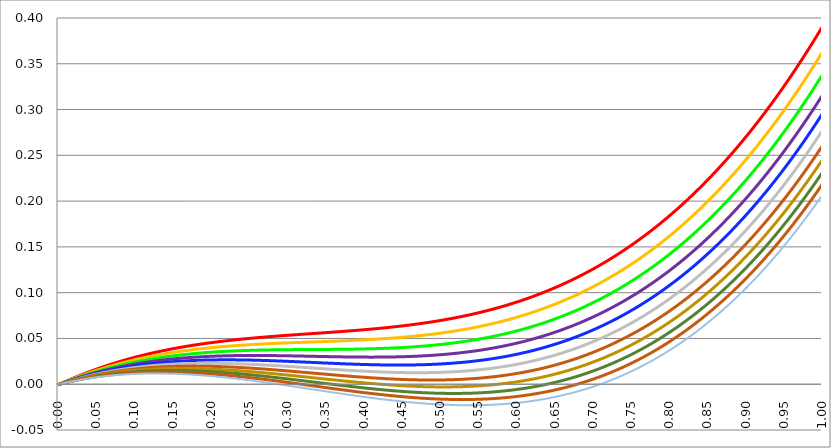
| Category | Series 1 | Series 0 | Series 3 | Series 4 | Series 5 | Series 2 | Series 6 | Series 7 | Series 8 | Series 9 | Series 10 |
|---|---|---|---|---|---|---|---|---|---|---|---|
| 0.0 | -0.001 | -0.001 | -0.001 | -0.001 | -0.001 | -0.001 | -0.001 | 0 | 0 | 0 | 0 |
| 0.0005 | -0.001 | -0.001 | -0.001 | 0 | 0 | 0 | 0 | 0 | 0 | 0 | 0 |
| 0.001 | 0 | 0 | 0 | 0 | 0 | 0 | 0 | 0 | 0 | 0 | 0 |
| 0.0015 | 0 | 0 | 0 | 0 | 0 | 0 | 0 | 0 | 0 | 0 | 0 |
| 0.002 | 0 | 0 | 0 | 0 | 0 | 0 | 0 | 0 | 0 | 0 | 0 |
| 0.0025 | 0 | 0 | 0 | 0 | 0 | 0 | 0 | 0 | 0 | 0 | 0 |
| 0.003 | 0 | 0 | 0 | 0 | 0 | 0 | 0 | 0 | 0 | 0 | 0 |
| 0.0035 | 0.001 | 0.001 | 0 | 0 | 0 | 0 | 0 | 0 | 0 | 0 | 0 |
| 0.004 | 0.001 | 0.001 | 0.001 | 0.001 | 0.001 | 0.001 | 0.001 | 0 | 0 | 0 | 0 |
| 0.0045 | 0.001 | 0.001 | 0.001 | 0.001 | 0.001 | 0.001 | 0.001 | 0.001 | 0.001 | 0.001 | 0 |
| 0.005 | 0.001 | 0.001 | 0.001 | 0.001 | 0.001 | 0.001 | 0.001 | 0.001 | 0.001 | 0.001 | 0.001 |
| 0.0055 | 0.001 | 0.001 | 0.001 | 0.001 | 0.001 | 0.001 | 0.001 | 0.001 | 0.001 | 0.001 | 0.001 |
| 0.006 | 0.002 | 0.001 | 0.001 | 0.001 | 0.001 | 0.001 | 0.001 | 0.001 | 0.001 | 0.001 | 0.001 |
| 0.0065 | 0.002 | 0.002 | 0.001 | 0.001 | 0.001 | 0.001 | 0.001 | 0.001 | 0.001 | 0.001 | 0.001 |
| 0.007 | 0.002 | 0.002 | 0.002 | 0.002 | 0.001 | 0.001 | 0.001 | 0.001 | 0.001 | 0.001 | 0.001 |
| 0.0075 | 0.002 | 0.002 | 0.002 | 0.002 | 0.002 | 0.001 | 0.001 | 0.001 | 0.001 | 0.001 | 0.001 |
| 0.008 | 0.002 | 0.002 | 0.002 | 0.002 | 0.002 | 0.002 | 0.001 | 0.001 | 0.001 | 0.001 | 0.001 |
| 0.0085 | 0.002 | 0.002 | 0.002 | 0.002 | 0.002 | 0.002 | 0.002 | 0.002 | 0.001 | 0.001 | 0.001 |
| 0.009 | 0.003 | 0.002 | 0.002 | 0.002 | 0.002 | 0.002 | 0.002 | 0.002 | 0.002 | 0.001 | 0.001 |
| 0.0095 | 0.003 | 0.003 | 0.002 | 0.002 | 0.002 | 0.002 | 0.002 | 0.002 | 0.002 | 0.002 | 0.001 |
| 0.01 | 0.003 | 0.003 | 0.003 | 0.002 | 0.002 | 0.002 | 0.002 | 0.002 | 0.002 | 0.002 | 0.002 |
| 0.0105 | 0.003 | 0.003 | 0.003 | 0.003 | 0.002 | 0.002 | 0.002 | 0.002 | 0.002 | 0.002 | 0.002 |
| 0.011 | 0.003 | 0.003 | 0.003 | 0.003 | 0.003 | 0.002 | 0.002 | 0.002 | 0.002 | 0.002 | 0.002 |
| 0.0115 | 0.004 | 0.003 | 0.003 | 0.003 | 0.003 | 0.003 | 0.002 | 0.002 | 0.002 | 0.002 | 0.002 |
| 0.012 | 0.004 | 0.003 | 0.003 | 0.003 | 0.003 | 0.003 | 0.002 | 0.002 | 0.002 | 0.002 | 0.002 |
| 0.0125 | 0.004 | 0.004 | 0.003 | 0.003 | 0.003 | 0.003 | 0.003 | 0.002 | 0.002 | 0.002 | 0.002 |
| 0.013 | 0.004 | 0.004 | 0.004 | 0.003 | 0.003 | 0.003 | 0.003 | 0.003 | 0.002 | 0.002 | 0.002 |
| 0.0135 | 0.004 | 0.004 | 0.004 | 0.003 | 0.003 | 0.003 | 0.003 | 0.003 | 0.002 | 0.002 | 0.002 |
| 0.014 | 0.004 | 0.004 | 0.004 | 0.004 | 0.003 | 0.003 | 0.003 | 0.003 | 0.003 | 0.002 | 0.002 |
| 0.0145 | 0.005 | 0.004 | 0.004 | 0.004 | 0.003 | 0.003 | 0.003 | 0.003 | 0.003 | 0.003 | 0.002 |
| 0.015 | 0.005 | 0.004 | 0.004 | 0.004 | 0.004 | 0.003 | 0.003 | 0.003 | 0.003 | 0.003 | 0.002 |
| 0.0155 | 0.005 | 0.005 | 0.004 | 0.004 | 0.004 | 0.004 | 0.003 | 0.003 | 0.003 | 0.003 | 0.003 |
| 0.016 | 0.005 | 0.005 | 0.004 | 0.004 | 0.004 | 0.004 | 0.003 | 0.003 | 0.003 | 0.003 | 0.003 |
| 0.0165 | 0.005 | 0.005 | 0.005 | 0.004 | 0.004 | 0.004 | 0.004 | 0.003 | 0.003 | 0.003 | 0.003 |
| 0.017 | 0.006 | 0.005 | 0.005 | 0.004 | 0.004 | 0.004 | 0.004 | 0.003 | 0.003 | 0.003 | 0.003 |
| 0.0175 | 0.006 | 0.005 | 0.005 | 0.005 | 0.004 | 0.004 | 0.004 | 0.003 | 0.003 | 0.003 | 0.003 |
| 0.018 | 0.006 | 0.005 | 0.005 | 0.005 | 0.004 | 0.004 | 0.004 | 0.004 | 0.003 | 0.003 | 0.003 |
| 0.0185 | 0.006 | 0.006 | 0.005 | 0.005 | 0.005 | 0.004 | 0.004 | 0.004 | 0.003 | 0.003 | 0.003 |
| 0.019 | 0.006 | 0.006 | 0.005 | 0.005 | 0.005 | 0.004 | 0.004 | 0.004 | 0.004 | 0.003 | 0.003 |
| 0.0195 | 0.006 | 0.006 | 0.006 | 0.005 | 0.005 | 0.004 | 0.004 | 0.004 | 0.004 | 0.003 | 0.003 |
| 0.02 | 0.007 | 0.006 | 0.006 | 0.005 | 0.005 | 0.005 | 0.004 | 0.004 | 0.004 | 0.004 | 0.003 |
| 0.0205 | 0.007 | 0.006 | 0.006 | 0.005 | 0.005 | 0.005 | 0.004 | 0.004 | 0.004 | 0.004 | 0.003 |
| 0.021 | 0.007 | 0.006 | 0.006 | 0.006 | 0.005 | 0.005 | 0.005 | 0.004 | 0.004 | 0.004 | 0.003 |
| 0.0215 | 0.007 | 0.007 | 0.006 | 0.006 | 0.005 | 0.005 | 0.005 | 0.004 | 0.004 | 0.004 | 0.004 |
| 0.022 | 0.007 | 0.007 | 0.006 | 0.006 | 0.005 | 0.005 | 0.005 | 0.004 | 0.004 | 0.004 | 0.004 |
| 0.0225 | 0.008 | 0.007 | 0.006 | 0.006 | 0.006 | 0.005 | 0.005 | 0.005 | 0.004 | 0.004 | 0.004 |
| 0.023 | 0.008 | 0.007 | 0.007 | 0.006 | 0.006 | 0.005 | 0.005 | 0.005 | 0.004 | 0.004 | 0.004 |
| 0.0235 | 0.008 | 0.007 | 0.007 | 0.006 | 0.006 | 0.005 | 0.005 | 0.005 | 0.004 | 0.004 | 0.004 |
| 0.024 | 0.008 | 0.007 | 0.007 | 0.006 | 0.006 | 0.006 | 0.005 | 0.005 | 0.005 | 0.004 | 0.004 |
| 0.0245 | 0.008 | 0.008 | 0.007 | 0.007 | 0.006 | 0.006 | 0.005 | 0.005 | 0.005 | 0.004 | 0.004 |
| 0.025 | 0.008 | 0.008 | 0.007 | 0.007 | 0.006 | 0.006 | 0.005 | 0.005 | 0.005 | 0.004 | 0.004 |
| 0.0255 | 0.009 | 0.008 | 0.007 | 0.007 | 0.006 | 0.006 | 0.005 | 0.005 | 0.005 | 0.004 | 0.004 |
| 0.026 | 0.009 | 0.008 | 0.007 | 0.007 | 0.006 | 0.006 | 0.006 | 0.005 | 0.005 | 0.005 | 0.004 |
| 0.0265 | 0.009 | 0.008 | 0.008 | 0.007 | 0.007 | 0.006 | 0.006 | 0.005 | 0.005 | 0.005 | 0.004 |
| 0.027 | 0.009 | 0.008 | 0.008 | 0.007 | 0.007 | 0.006 | 0.006 | 0.005 | 0.005 | 0.005 | 0.004 |
| 0.0275 | 0.009 | 0.009 | 0.008 | 0.007 | 0.007 | 0.006 | 0.006 | 0.006 | 0.005 | 0.005 | 0.005 |
| 0.028 | 0.009 | 0.009 | 0.008 | 0.007 | 0.007 | 0.006 | 0.006 | 0.006 | 0.005 | 0.005 | 0.005 |
| 0.0285 | 0.01 | 0.009 | 0.008 | 0.008 | 0.007 | 0.007 | 0.006 | 0.006 | 0.005 | 0.005 | 0.005 |
| 0.029 | 0.01 | 0.009 | 0.008 | 0.008 | 0.007 | 0.007 | 0.006 | 0.006 | 0.005 | 0.005 | 0.005 |
| 0.0295 | 0.01 | 0.009 | 0.008 | 0.008 | 0.007 | 0.007 | 0.006 | 0.006 | 0.006 | 0.005 | 0.005 |
| 0.03 | 0.01 | 0.009 | 0.009 | 0.008 | 0.007 | 0.007 | 0.006 | 0.006 | 0.006 | 0.005 | 0.005 |
| 0.0305 | 0.01 | 0.009 | 0.009 | 0.008 | 0.008 | 0.007 | 0.007 | 0.006 | 0.006 | 0.005 | 0.005 |
| 0.031 | 0.01 | 0.01 | 0.009 | 0.008 | 0.008 | 0.007 | 0.007 | 0.006 | 0.006 | 0.005 | 0.005 |
| 0.0315 | 0.011 | 0.01 | 0.009 | 0.008 | 0.008 | 0.007 | 0.007 | 0.006 | 0.006 | 0.005 | 0.005 |
| 0.032 | 0.011 | 0.01 | 0.009 | 0.008 | 0.008 | 0.007 | 0.007 | 0.006 | 0.006 | 0.006 | 0.005 |
| 0.0325 | 0.011 | 0.01 | 0.009 | 0.009 | 0.008 | 0.007 | 0.007 | 0.006 | 0.006 | 0.006 | 0.005 |
| 0.033 | 0.011 | 0.01 | 0.009 | 0.009 | 0.008 | 0.008 | 0.007 | 0.007 | 0.006 | 0.006 | 0.005 |
| 0.0335 | 0.011 | 0.01 | 0.01 | 0.009 | 0.008 | 0.008 | 0.007 | 0.007 | 0.006 | 0.006 | 0.005 |
| 0.034 | 0.011 | 0.01 | 0.01 | 0.009 | 0.008 | 0.008 | 0.007 | 0.007 | 0.006 | 0.006 | 0.005 |
| 0.0345 | 0.012 | 0.011 | 0.01 | 0.009 | 0.008 | 0.008 | 0.007 | 0.007 | 0.006 | 0.006 | 0.006 |
| 0.035 | 0.012 | 0.011 | 0.01 | 0.009 | 0.009 | 0.008 | 0.007 | 0.007 | 0.006 | 0.006 | 0.006 |
| 0.0355 | 0.012 | 0.011 | 0.01 | 0.009 | 0.009 | 0.008 | 0.008 | 0.007 | 0.007 | 0.006 | 0.006 |
| 0.036 | 0.012 | 0.011 | 0.01 | 0.009 | 0.009 | 0.008 | 0.008 | 0.007 | 0.007 | 0.006 | 0.006 |
| 0.0365 | 0.012 | 0.011 | 0.01 | 0.01 | 0.009 | 0.008 | 0.008 | 0.007 | 0.007 | 0.006 | 0.006 |
| 0.037 | 0.012 | 0.011 | 0.011 | 0.01 | 0.009 | 0.008 | 0.008 | 0.007 | 0.007 | 0.006 | 0.006 |
| 0.0375 | 0.013 | 0.012 | 0.011 | 0.01 | 0.009 | 0.008 | 0.008 | 0.007 | 0.007 | 0.006 | 0.006 |
| 0.038 | 0.013 | 0.012 | 0.011 | 0.01 | 0.009 | 0.009 | 0.008 | 0.007 | 0.007 | 0.006 | 0.006 |
| 0.0385 | 0.013 | 0.012 | 0.011 | 0.01 | 0.009 | 0.009 | 0.008 | 0.008 | 0.007 | 0.007 | 0.006 |
| 0.039 | 0.013 | 0.012 | 0.011 | 0.01 | 0.009 | 0.009 | 0.008 | 0.008 | 0.007 | 0.007 | 0.006 |
| 0.0395 | 0.013 | 0.012 | 0.011 | 0.01 | 0.01 | 0.009 | 0.008 | 0.008 | 0.007 | 0.007 | 0.006 |
| 0.04 | 0.013 | 0.012 | 0.011 | 0.01 | 0.01 | 0.009 | 0.008 | 0.008 | 0.007 | 0.007 | 0.006 |
| 0.0405 | 0.013 | 0.012 | 0.011 | 0.011 | 0.01 | 0.009 | 0.008 | 0.008 | 0.007 | 0.007 | 0.006 |
| 0.041 | 0.014 | 0.013 | 0.012 | 0.011 | 0.01 | 0.009 | 0.009 | 0.008 | 0.007 | 0.007 | 0.006 |
| 0.0415 | 0.014 | 0.013 | 0.012 | 0.011 | 0.01 | 0.009 | 0.009 | 0.008 | 0.007 | 0.007 | 0.007 |
| 0.042 | 0.014 | 0.013 | 0.012 | 0.011 | 0.01 | 0.009 | 0.009 | 0.008 | 0.008 | 0.007 | 0.007 |
| 0.0425 | 0.014 | 0.013 | 0.012 | 0.011 | 0.01 | 0.009 | 0.009 | 0.008 | 0.008 | 0.007 | 0.007 |
| 0.043 | 0.014 | 0.013 | 0.012 | 0.011 | 0.01 | 0.01 | 0.009 | 0.008 | 0.008 | 0.007 | 0.007 |
| 0.0435 | 0.014 | 0.013 | 0.012 | 0.011 | 0.01 | 0.01 | 0.009 | 0.008 | 0.008 | 0.007 | 0.007 |
| 0.044 | 0.015 | 0.013 | 0.012 | 0.011 | 0.011 | 0.01 | 0.009 | 0.008 | 0.008 | 0.007 | 0.007 |
| 0.0445 | 0.015 | 0.014 | 0.012 | 0.012 | 0.011 | 0.01 | 0.009 | 0.009 | 0.008 | 0.007 | 0.007 |
| 0.045 | 0.015 | 0.014 | 0.013 | 0.012 | 0.011 | 0.01 | 0.009 | 0.009 | 0.008 | 0.007 | 0.007 |
| 0.0455 | 0.015 | 0.014 | 0.013 | 0.012 | 0.011 | 0.01 | 0.009 | 0.009 | 0.008 | 0.008 | 0.007 |
| 0.046 | 0.015 | 0.014 | 0.013 | 0.012 | 0.011 | 0.01 | 0.009 | 0.009 | 0.008 | 0.008 | 0.007 |
| 0.0465 | 0.015 | 0.014 | 0.013 | 0.012 | 0.011 | 0.01 | 0.01 | 0.009 | 0.008 | 0.008 | 0.007 |
| 0.047 | 0.015 | 0.014 | 0.013 | 0.012 | 0.011 | 0.01 | 0.01 | 0.009 | 0.008 | 0.008 | 0.007 |
| 0.0475 | 0.016 | 0.014 | 0.013 | 0.012 | 0.011 | 0.01 | 0.01 | 0.009 | 0.008 | 0.008 | 0.007 |
| 0.048 | 0.016 | 0.015 | 0.013 | 0.012 | 0.011 | 0.011 | 0.01 | 0.009 | 0.008 | 0.008 | 0.007 |
| 0.0485 | 0.016 | 0.015 | 0.013 | 0.012 | 0.011 | 0.011 | 0.01 | 0.009 | 0.009 | 0.008 | 0.007 |
| 0.049 | 0.016 | 0.015 | 0.014 | 0.013 | 0.012 | 0.011 | 0.01 | 0.009 | 0.009 | 0.008 | 0.007 |
| 0.0495 | 0.016 | 0.015 | 0.014 | 0.013 | 0.012 | 0.011 | 0.01 | 0.009 | 0.009 | 0.008 | 0.007 |
| 0.05 | 0.016 | 0.015 | 0.014 | 0.013 | 0.012 | 0.011 | 0.01 | 0.009 | 0.009 | 0.008 | 0.008 |
| 0.0505 | 0.017 | 0.015 | 0.014 | 0.013 | 0.012 | 0.011 | 0.01 | 0.009 | 0.009 | 0.008 | 0.008 |
| 0.051 | 0.017 | 0.015 | 0.014 | 0.013 | 0.012 | 0.011 | 0.01 | 0.01 | 0.009 | 0.008 | 0.008 |
| 0.0515 | 0.017 | 0.015 | 0.014 | 0.013 | 0.012 | 0.011 | 0.01 | 0.01 | 0.009 | 0.008 | 0.008 |
| 0.052 | 0.017 | 0.016 | 0.014 | 0.013 | 0.012 | 0.011 | 0.01 | 0.01 | 0.009 | 0.008 | 0.008 |
| 0.0525 | 0.017 | 0.016 | 0.014 | 0.013 | 0.012 | 0.011 | 0.011 | 0.01 | 0.009 | 0.008 | 0.008 |
| 0.053 | 0.017 | 0.016 | 0.015 | 0.013 | 0.012 | 0.011 | 0.011 | 0.01 | 0.009 | 0.008 | 0.008 |
| 0.0535 | 0.017 | 0.016 | 0.015 | 0.014 | 0.013 | 0.012 | 0.011 | 0.01 | 0.009 | 0.009 | 0.008 |
| 0.054 | 0.018 | 0.016 | 0.015 | 0.014 | 0.013 | 0.012 | 0.011 | 0.01 | 0.009 | 0.009 | 0.008 |
| 0.0545 | 0.018 | 0.016 | 0.015 | 0.014 | 0.013 | 0.012 | 0.011 | 0.01 | 0.009 | 0.009 | 0.008 |
| 0.055 | 0.018 | 0.016 | 0.015 | 0.014 | 0.013 | 0.012 | 0.011 | 0.01 | 0.009 | 0.009 | 0.008 |
| 0.0555 | 0.018 | 0.017 | 0.015 | 0.014 | 0.013 | 0.012 | 0.011 | 0.01 | 0.009 | 0.009 | 0.008 |
| 0.056 | 0.018 | 0.017 | 0.015 | 0.014 | 0.013 | 0.012 | 0.011 | 0.01 | 0.01 | 0.009 | 0.008 |
| 0.0565 | 0.018 | 0.017 | 0.015 | 0.014 | 0.013 | 0.012 | 0.011 | 0.01 | 0.01 | 0.009 | 0.008 |
| 0.057 | 0.018 | 0.017 | 0.016 | 0.014 | 0.013 | 0.012 | 0.011 | 0.01 | 0.01 | 0.009 | 0.008 |
| 0.0575 | 0.019 | 0.017 | 0.016 | 0.014 | 0.013 | 0.012 | 0.011 | 0.01 | 0.01 | 0.009 | 0.008 |
| 0.058 | 0.019 | 0.017 | 0.016 | 0.015 | 0.013 | 0.012 | 0.011 | 0.011 | 0.01 | 0.009 | 0.008 |
| 0.0585 | 0.019 | 0.017 | 0.016 | 0.015 | 0.013 | 0.012 | 0.011 | 0.011 | 0.01 | 0.009 | 0.008 |
| 0.059 | 0.019 | 0.017 | 0.016 | 0.015 | 0.014 | 0.013 | 0.012 | 0.011 | 0.01 | 0.009 | 0.009 |
| 0.0595 | 0.019 | 0.018 | 0.016 | 0.015 | 0.014 | 0.013 | 0.012 | 0.011 | 0.01 | 0.009 | 0.009 |
| 0.06 | 0.019 | 0.018 | 0.016 | 0.015 | 0.014 | 0.013 | 0.012 | 0.011 | 0.01 | 0.009 | 0.009 |
| 0.0605 | 0.019 | 0.018 | 0.016 | 0.015 | 0.014 | 0.013 | 0.012 | 0.011 | 0.01 | 0.009 | 0.009 |
| 0.061 | 0.02 | 0.018 | 0.016 | 0.015 | 0.014 | 0.013 | 0.012 | 0.011 | 0.01 | 0.009 | 0.009 |
| 0.0615 | 0.02 | 0.018 | 0.017 | 0.015 | 0.014 | 0.013 | 0.012 | 0.011 | 0.01 | 0.009 | 0.009 |
| 0.062 | 0.02 | 0.018 | 0.017 | 0.015 | 0.014 | 0.013 | 0.012 | 0.011 | 0.01 | 0.009 | 0.009 |
| 0.0625 | 0.02 | 0.018 | 0.017 | 0.015 | 0.014 | 0.013 | 0.012 | 0.011 | 0.01 | 0.01 | 0.009 |
| 0.063 | 0.02 | 0.018 | 0.017 | 0.016 | 0.014 | 0.013 | 0.012 | 0.011 | 0.01 | 0.01 | 0.009 |
| 0.0635 | 0.02 | 0.019 | 0.017 | 0.016 | 0.014 | 0.013 | 0.012 | 0.011 | 0.01 | 0.01 | 0.009 |
| 0.064 | 0.02 | 0.019 | 0.017 | 0.016 | 0.014 | 0.013 | 0.012 | 0.011 | 0.01 | 0.01 | 0.009 |
| 0.0645 | 0.021 | 0.019 | 0.017 | 0.016 | 0.015 | 0.013 | 0.012 | 0.011 | 0.011 | 0.01 | 0.009 |
| 0.065 | 0.021 | 0.019 | 0.017 | 0.016 | 0.015 | 0.014 | 0.012 | 0.011 | 0.011 | 0.01 | 0.009 |
| 0.0655 | 0.021 | 0.019 | 0.017 | 0.016 | 0.015 | 0.014 | 0.013 | 0.012 | 0.011 | 0.01 | 0.009 |
| 0.066 | 0.021 | 0.019 | 0.018 | 0.016 | 0.015 | 0.014 | 0.013 | 0.012 | 0.011 | 0.01 | 0.009 |
| 0.0665 | 0.021 | 0.019 | 0.018 | 0.016 | 0.015 | 0.014 | 0.013 | 0.012 | 0.011 | 0.01 | 0.009 |
| 0.067 | 0.021 | 0.019 | 0.018 | 0.016 | 0.015 | 0.014 | 0.013 | 0.012 | 0.011 | 0.01 | 0.009 |
| 0.0675 | 0.021 | 0.02 | 0.018 | 0.016 | 0.015 | 0.014 | 0.013 | 0.012 | 0.011 | 0.01 | 0.009 |
| 0.068 | 0.021 | 0.02 | 0.018 | 0.017 | 0.015 | 0.014 | 0.013 | 0.012 | 0.011 | 0.01 | 0.009 |
| 0.0685 | 0.022 | 0.02 | 0.018 | 0.017 | 0.015 | 0.014 | 0.013 | 0.012 | 0.011 | 0.01 | 0.009 |
| 0.069 | 0.022 | 0.02 | 0.018 | 0.017 | 0.015 | 0.014 | 0.013 | 0.012 | 0.011 | 0.01 | 0.009 |
| 0.0695 | 0.022 | 0.02 | 0.018 | 0.017 | 0.015 | 0.014 | 0.013 | 0.012 | 0.011 | 0.01 | 0.009 |
| 0.07 | 0.022 | 0.02 | 0.018 | 0.017 | 0.016 | 0.014 | 0.013 | 0.012 | 0.011 | 0.01 | 0.009 |
| 0.0705 | 0.022 | 0.02 | 0.019 | 0.017 | 0.016 | 0.014 | 0.013 | 0.012 | 0.011 | 0.01 | 0.01 |
| 0.071 | 0.022 | 0.02 | 0.019 | 0.017 | 0.016 | 0.014 | 0.013 | 0.012 | 0.011 | 0.01 | 0.01 |
| 0.0715 | 0.022 | 0.02 | 0.019 | 0.017 | 0.016 | 0.015 | 0.013 | 0.012 | 0.011 | 0.01 | 0.01 |
| 0.072 | 0.023 | 0.021 | 0.019 | 0.017 | 0.016 | 0.015 | 0.013 | 0.012 | 0.011 | 0.01 | 0.01 |
| 0.0725 | 0.023 | 0.021 | 0.019 | 0.017 | 0.016 | 0.015 | 0.013 | 0.012 | 0.011 | 0.011 | 0.01 |
| 0.073 | 0.023 | 0.021 | 0.019 | 0.017 | 0.016 | 0.015 | 0.014 | 0.012 | 0.011 | 0.011 | 0.01 |
| 0.0735 | 0.023 | 0.021 | 0.019 | 0.018 | 0.016 | 0.015 | 0.014 | 0.013 | 0.012 | 0.011 | 0.01 |
| 0.074 | 0.023 | 0.021 | 0.019 | 0.018 | 0.016 | 0.015 | 0.014 | 0.013 | 0.012 | 0.011 | 0.01 |
| 0.0745 | 0.023 | 0.021 | 0.019 | 0.018 | 0.016 | 0.015 | 0.014 | 0.013 | 0.012 | 0.011 | 0.01 |
| 0.075 | 0.023 | 0.021 | 0.019 | 0.018 | 0.016 | 0.015 | 0.014 | 0.013 | 0.012 | 0.011 | 0.01 |
| 0.0755 | 0.023 | 0.021 | 0.02 | 0.018 | 0.016 | 0.015 | 0.014 | 0.013 | 0.012 | 0.011 | 0.01 |
| 0.076 | 0.024 | 0.022 | 0.02 | 0.018 | 0.017 | 0.015 | 0.014 | 0.013 | 0.012 | 0.011 | 0.01 |
| 0.0765 | 0.024 | 0.022 | 0.02 | 0.018 | 0.017 | 0.015 | 0.014 | 0.013 | 0.012 | 0.011 | 0.01 |
| 0.077 | 0.024 | 0.022 | 0.02 | 0.018 | 0.017 | 0.015 | 0.014 | 0.013 | 0.012 | 0.011 | 0.01 |
| 0.0775 | 0.024 | 0.022 | 0.02 | 0.018 | 0.017 | 0.015 | 0.014 | 0.013 | 0.012 | 0.011 | 0.01 |
| 0.078 | 0.024 | 0.022 | 0.02 | 0.018 | 0.017 | 0.015 | 0.014 | 0.013 | 0.012 | 0.011 | 0.01 |
| 0.0785 | 0.024 | 0.022 | 0.02 | 0.018 | 0.017 | 0.016 | 0.014 | 0.013 | 0.012 | 0.011 | 0.01 |
| 0.079 | 0.024 | 0.022 | 0.02 | 0.019 | 0.017 | 0.016 | 0.014 | 0.013 | 0.012 | 0.011 | 0.01 |
| 0.0795 | 0.024 | 0.022 | 0.02 | 0.019 | 0.017 | 0.016 | 0.014 | 0.013 | 0.012 | 0.011 | 0.01 |
| 0.08 | 0.025 | 0.022 | 0.02 | 0.019 | 0.017 | 0.016 | 0.014 | 0.013 | 0.012 | 0.011 | 0.01 |
| 0.0805 | 0.025 | 0.023 | 0.021 | 0.019 | 0.017 | 0.016 | 0.014 | 0.013 | 0.012 | 0.011 | 0.01 |
| 0.081 | 0.025 | 0.023 | 0.021 | 0.019 | 0.017 | 0.016 | 0.015 | 0.013 | 0.012 | 0.011 | 0.01 |
| 0.0815 | 0.025 | 0.023 | 0.021 | 0.019 | 0.017 | 0.016 | 0.015 | 0.013 | 0.012 | 0.011 | 0.01 |
| 0.082 | 0.025 | 0.023 | 0.021 | 0.019 | 0.017 | 0.016 | 0.015 | 0.013 | 0.012 | 0.011 | 0.01 |
| 0.0825 | 0.025 | 0.023 | 0.021 | 0.019 | 0.018 | 0.016 | 0.015 | 0.013 | 0.012 | 0.011 | 0.01 |
| 0.083 | 0.025 | 0.023 | 0.021 | 0.019 | 0.018 | 0.016 | 0.015 | 0.014 | 0.012 | 0.011 | 0.01 |
| 0.0835 | 0.025 | 0.023 | 0.021 | 0.019 | 0.018 | 0.016 | 0.015 | 0.014 | 0.012 | 0.011 | 0.01 |
| 0.084 | 0.026 | 0.023 | 0.021 | 0.019 | 0.018 | 0.016 | 0.015 | 0.014 | 0.012 | 0.011 | 0.01 |
| 0.0845 | 0.026 | 0.023 | 0.021 | 0.02 | 0.018 | 0.016 | 0.015 | 0.014 | 0.013 | 0.011 | 0.011 |
| 0.085 | 0.026 | 0.024 | 0.021 | 0.02 | 0.018 | 0.016 | 0.015 | 0.014 | 0.013 | 0.012 | 0.011 |
| 0.0855 | 0.026 | 0.024 | 0.022 | 0.02 | 0.018 | 0.016 | 0.015 | 0.014 | 0.013 | 0.012 | 0.011 |
| 0.086 | 0.026 | 0.024 | 0.022 | 0.02 | 0.018 | 0.017 | 0.015 | 0.014 | 0.013 | 0.012 | 0.011 |
| 0.0865 | 0.026 | 0.024 | 0.022 | 0.02 | 0.018 | 0.017 | 0.015 | 0.014 | 0.013 | 0.012 | 0.011 |
| 0.087 | 0.026 | 0.024 | 0.022 | 0.02 | 0.018 | 0.017 | 0.015 | 0.014 | 0.013 | 0.012 | 0.011 |
| 0.0875 | 0.026 | 0.024 | 0.022 | 0.02 | 0.018 | 0.017 | 0.015 | 0.014 | 0.013 | 0.012 | 0.011 |
| 0.088 | 0.027 | 0.024 | 0.022 | 0.02 | 0.018 | 0.017 | 0.015 | 0.014 | 0.013 | 0.012 | 0.011 |
| 0.0885 | 0.027 | 0.024 | 0.022 | 0.02 | 0.018 | 0.017 | 0.015 | 0.014 | 0.013 | 0.012 | 0.011 |
| 0.089 | 0.027 | 0.024 | 0.022 | 0.02 | 0.018 | 0.017 | 0.015 | 0.014 | 0.013 | 0.012 | 0.011 |
| 0.0895 | 0.027 | 0.024 | 0.022 | 0.02 | 0.019 | 0.017 | 0.015 | 0.014 | 0.013 | 0.012 | 0.011 |
| 0.09 | 0.027 | 0.025 | 0.022 | 0.02 | 0.019 | 0.017 | 0.016 | 0.014 | 0.013 | 0.012 | 0.011 |
| 0.0905 | 0.027 | 0.025 | 0.022 | 0.02 | 0.019 | 0.017 | 0.016 | 0.014 | 0.013 | 0.012 | 0.011 |
| 0.091 | 0.027 | 0.025 | 0.023 | 0.021 | 0.019 | 0.017 | 0.016 | 0.014 | 0.013 | 0.012 | 0.011 |
| 0.0915 | 0.027 | 0.025 | 0.023 | 0.021 | 0.019 | 0.017 | 0.016 | 0.014 | 0.013 | 0.012 | 0.011 |
| 0.092 | 0.027 | 0.025 | 0.023 | 0.021 | 0.019 | 0.017 | 0.016 | 0.014 | 0.013 | 0.012 | 0.011 |
| 0.0925 | 0.028 | 0.025 | 0.023 | 0.021 | 0.019 | 0.017 | 0.016 | 0.014 | 0.013 | 0.012 | 0.011 |
| 0.093 | 0.028 | 0.025 | 0.023 | 0.021 | 0.019 | 0.017 | 0.016 | 0.014 | 0.013 | 0.012 | 0.011 |
| 0.0935 | 0.028 | 0.025 | 0.023 | 0.021 | 0.019 | 0.017 | 0.016 | 0.014 | 0.013 | 0.012 | 0.011 |
| 0.094 | 0.028 | 0.025 | 0.023 | 0.021 | 0.019 | 0.017 | 0.016 | 0.015 | 0.013 | 0.012 | 0.011 |
| 0.0945 | 0.028 | 0.025 | 0.023 | 0.021 | 0.019 | 0.018 | 0.016 | 0.015 | 0.013 | 0.012 | 0.011 |
| 0.095 | 0.028 | 0.026 | 0.023 | 0.021 | 0.019 | 0.018 | 0.016 | 0.015 | 0.013 | 0.012 | 0.011 |
| 0.0955 | 0.028 | 0.026 | 0.023 | 0.021 | 0.019 | 0.018 | 0.016 | 0.015 | 0.013 | 0.012 | 0.011 |
| 0.096 | 0.028 | 0.026 | 0.023 | 0.021 | 0.019 | 0.018 | 0.016 | 0.015 | 0.013 | 0.012 | 0.011 |
| 0.0965 | 0.029 | 0.026 | 0.024 | 0.021 | 0.019 | 0.018 | 0.016 | 0.015 | 0.013 | 0.012 | 0.011 |
| 0.097 | 0.029 | 0.026 | 0.024 | 0.021 | 0.02 | 0.018 | 0.016 | 0.015 | 0.013 | 0.012 | 0.011 |
| 0.0975 | 0.029 | 0.026 | 0.024 | 0.022 | 0.02 | 0.018 | 0.016 | 0.015 | 0.013 | 0.012 | 0.011 |
| 0.098 | 0.029 | 0.026 | 0.024 | 0.022 | 0.02 | 0.018 | 0.016 | 0.015 | 0.014 | 0.012 | 0.011 |
| 0.0985 | 0.029 | 0.026 | 0.024 | 0.022 | 0.02 | 0.018 | 0.016 | 0.015 | 0.014 | 0.012 | 0.011 |
| 0.099 | 0.029 | 0.026 | 0.024 | 0.022 | 0.02 | 0.018 | 0.016 | 0.015 | 0.014 | 0.012 | 0.011 |
| 0.0995 | 0.029 | 0.026 | 0.024 | 0.022 | 0.02 | 0.018 | 0.016 | 0.015 | 0.014 | 0.012 | 0.011 |
| 0.1 | 0.029 | 0.027 | 0.024 | 0.022 | 0.02 | 0.018 | 0.017 | 0.015 | 0.014 | 0.012 | 0.011 |
| 0.1005 | 0.029 | 0.027 | 0.024 | 0.022 | 0.02 | 0.018 | 0.017 | 0.015 | 0.014 | 0.012 | 0.011 |
| 0.101 | 0.03 | 0.027 | 0.024 | 0.022 | 0.02 | 0.018 | 0.017 | 0.015 | 0.014 | 0.012 | 0.011 |
| 0.1015 | 0.03 | 0.027 | 0.024 | 0.022 | 0.02 | 0.018 | 0.017 | 0.015 | 0.014 | 0.012 | 0.011 |
| 0.102 | 0.03 | 0.027 | 0.024 | 0.022 | 0.02 | 0.018 | 0.017 | 0.015 | 0.014 | 0.012 | 0.011 |
| 0.1025 | 0.03 | 0.027 | 0.025 | 0.022 | 0.02 | 0.018 | 0.017 | 0.015 | 0.014 | 0.013 | 0.011 |
| 0.103 | 0.03 | 0.027 | 0.025 | 0.022 | 0.02 | 0.018 | 0.017 | 0.015 | 0.014 | 0.013 | 0.011 |
| 0.1035 | 0.03 | 0.027 | 0.025 | 0.022 | 0.02 | 0.019 | 0.017 | 0.015 | 0.014 | 0.013 | 0.011 |
| 0.104 | 0.03 | 0.027 | 0.025 | 0.023 | 0.02 | 0.019 | 0.017 | 0.015 | 0.014 | 0.013 | 0.011 |
| 0.1045 | 0.03 | 0.027 | 0.025 | 0.023 | 0.02 | 0.019 | 0.017 | 0.015 | 0.014 | 0.013 | 0.011 |
| 0.105 | 0.03 | 0.028 | 0.025 | 0.023 | 0.021 | 0.019 | 0.017 | 0.015 | 0.014 | 0.013 | 0.011 |
| 0.1055 | 0.03 | 0.028 | 0.025 | 0.023 | 0.021 | 0.019 | 0.017 | 0.015 | 0.014 | 0.013 | 0.011 |
| 0.106 | 0.031 | 0.028 | 0.025 | 0.023 | 0.021 | 0.019 | 0.017 | 0.015 | 0.014 | 0.013 | 0.011 |
| 0.1065 | 0.031 | 0.028 | 0.025 | 0.023 | 0.021 | 0.019 | 0.017 | 0.015 | 0.014 | 0.013 | 0.011 |
| 0.107 | 0.031 | 0.028 | 0.025 | 0.023 | 0.021 | 0.019 | 0.017 | 0.016 | 0.014 | 0.013 | 0.011 |
| 0.1075 | 0.031 | 0.028 | 0.025 | 0.023 | 0.021 | 0.019 | 0.017 | 0.016 | 0.014 | 0.013 | 0.011 |
| 0.108 | 0.031 | 0.028 | 0.025 | 0.023 | 0.021 | 0.019 | 0.017 | 0.016 | 0.014 | 0.013 | 0.011 |
| 0.1085 | 0.031 | 0.028 | 0.026 | 0.023 | 0.021 | 0.019 | 0.017 | 0.016 | 0.014 | 0.013 | 0.012 |
| 0.109 | 0.031 | 0.028 | 0.026 | 0.023 | 0.021 | 0.019 | 0.017 | 0.016 | 0.014 | 0.013 | 0.012 |
| 0.1095 | 0.031 | 0.028 | 0.026 | 0.023 | 0.021 | 0.019 | 0.017 | 0.016 | 0.014 | 0.013 | 0.012 |
| 0.11 | 0.031 | 0.028 | 0.026 | 0.023 | 0.021 | 0.019 | 0.017 | 0.016 | 0.014 | 0.013 | 0.012 |
| 0.1105 | 0.032 | 0.029 | 0.026 | 0.023 | 0.021 | 0.019 | 0.017 | 0.016 | 0.014 | 0.013 | 0.012 |
| 0.111 | 0.032 | 0.029 | 0.026 | 0.023 | 0.021 | 0.019 | 0.017 | 0.016 | 0.014 | 0.013 | 0.012 |
| 0.1115 | 0.032 | 0.029 | 0.026 | 0.024 | 0.021 | 0.019 | 0.017 | 0.016 | 0.014 | 0.013 | 0.012 |
| 0.112 | 0.032 | 0.029 | 0.026 | 0.024 | 0.021 | 0.019 | 0.017 | 0.016 | 0.014 | 0.013 | 0.012 |
| 0.1125 | 0.032 | 0.029 | 0.026 | 0.024 | 0.021 | 0.019 | 0.018 | 0.016 | 0.014 | 0.013 | 0.012 |
| 0.113 | 0.032 | 0.029 | 0.026 | 0.024 | 0.021 | 0.019 | 0.018 | 0.016 | 0.014 | 0.013 | 0.012 |
| 0.1135 | 0.032 | 0.029 | 0.026 | 0.024 | 0.022 | 0.019 | 0.018 | 0.016 | 0.014 | 0.013 | 0.012 |
| 0.114 | 0.032 | 0.029 | 0.026 | 0.024 | 0.022 | 0.02 | 0.018 | 0.016 | 0.014 | 0.013 | 0.012 |
| 0.1145 | 0.032 | 0.029 | 0.026 | 0.024 | 0.022 | 0.02 | 0.018 | 0.016 | 0.014 | 0.013 | 0.012 |
| 0.115 | 0.032 | 0.029 | 0.026 | 0.024 | 0.022 | 0.02 | 0.018 | 0.016 | 0.014 | 0.013 | 0.012 |
| 0.1155 | 0.033 | 0.029 | 0.027 | 0.024 | 0.022 | 0.02 | 0.018 | 0.016 | 0.014 | 0.013 | 0.012 |
| 0.116 | 0.033 | 0.029 | 0.027 | 0.024 | 0.022 | 0.02 | 0.018 | 0.016 | 0.014 | 0.013 | 0.012 |
| 0.1165 | 0.033 | 0.03 | 0.027 | 0.024 | 0.022 | 0.02 | 0.018 | 0.016 | 0.014 | 0.013 | 0.012 |
| 0.117 | 0.033 | 0.03 | 0.027 | 0.024 | 0.022 | 0.02 | 0.018 | 0.016 | 0.014 | 0.013 | 0.012 |
| 0.1175 | 0.033 | 0.03 | 0.027 | 0.024 | 0.022 | 0.02 | 0.018 | 0.016 | 0.015 | 0.013 | 0.012 |
| 0.118 | 0.033 | 0.03 | 0.027 | 0.024 | 0.022 | 0.02 | 0.018 | 0.016 | 0.015 | 0.013 | 0.012 |
| 0.1185 | 0.033 | 0.03 | 0.027 | 0.024 | 0.022 | 0.02 | 0.018 | 0.016 | 0.015 | 0.013 | 0.012 |
| 0.119 | 0.033 | 0.03 | 0.027 | 0.024 | 0.022 | 0.02 | 0.018 | 0.016 | 0.015 | 0.013 | 0.012 |
| 0.1195 | 0.033 | 0.03 | 0.027 | 0.025 | 0.022 | 0.02 | 0.018 | 0.016 | 0.015 | 0.013 | 0.012 |
| 0.12 | 0.033 | 0.03 | 0.027 | 0.025 | 0.022 | 0.02 | 0.018 | 0.016 | 0.015 | 0.013 | 0.012 |
| 0.1205 | 0.034 | 0.03 | 0.027 | 0.025 | 0.022 | 0.02 | 0.018 | 0.016 | 0.015 | 0.013 | 0.012 |
| 0.121 | 0.034 | 0.03 | 0.027 | 0.025 | 0.022 | 0.02 | 0.018 | 0.016 | 0.015 | 0.013 | 0.012 |
| 0.1215 | 0.034 | 0.03 | 0.027 | 0.025 | 0.022 | 0.02 | 0.018 | 0.016 | 0.015 | 0.013 | 0.012 |
| 0.122 | 0.034 | 0.03 | 0.027 | 0.025 | 0.022 | 0.02 | 0.018 | 0.016 | 0.015 | 0.013 | 0.012 |
| 0.1225 | 0.034 | 0.031 | 0.028 | 0.025 | 0.022 | 0.02 | 0.018 | 0.016 | 0.015 | 0.013 | 0.012 |
| 0.123 | 0.034 | 0.031 | 0.028 | 0.025 | 0.022 | 0.02 | 0.018 | 0.016 | 0.015 | 0.013 | 0.012 |
| 0.1235 | 0.034 | 0.031 | 0.028 | 0.025 | 0.023 | 0.02 | 0.018 | 0.016 | 0.015 | 0.013 | 0.012 |
| 0.124 | 0.034 | 0.031 | 0.028 | 0.025 | 0.023 | 0.02 | 0.018 | 0.016 | 0.015 | 0.013 | 0.012 |
| 0.1245 | 0.034 | 0.031 | 0.028 | 0.025 | 0.023 | 0.02 | 0.018 | 0.016 | 0.015 | 0.013 | 0.012 |
| 0.125 | 0.034 | 0.031 | 0.028 | 0.025 | 0.023 | 0.02 | 0.018 | 0.016 | 0.015 | 0.013 | 0.012 |
| 0.1255 | 0.034 | 0.031 | 0.028 | 0.025 | 0.023 | 0.02 | 0.018 | 0.016 | 0.015 | 0.013 | 0.012 |
| 0.126 | 0.035 | 0.031 | 0.028 | 0.025 | 0.023 | 0.02 | 0.018 | 0.017 | 0.015 | 0.013 | 0.012 |
| 0.1265 | 0.035 | 0.031 | 0.028 | 0.025 | 0.023 | 0.021 | 0.018 | 0.017 | 0.015 | 0.013 | 0.012 |
| 0.127 | 0.035 | 0.031 | 0.028 | 0.025 | 0.023 | 0.021 | 0.018 | 0.017 | 0.015 | 0.013 | 0.012 |
| 0.1275 | 0.035 | 0.031 | 0.028 | 0.025 | 0.023 | 0.021 | 0.018 | 0.017 | 0.015 | 0.013 | 0.012 |
| 0.128 | 0.035 | 0.031 | 0.028 | 0.025 | 0.023 | 0.021 | 0.019 | 0.017 | 0.015 | 0.013 | 0.012 |
| 0.1285 | 0.035 | 0.032 | 0.028 | 0.026 | 0.023 | 0.021 | 0.019 | 0.017 | 0.015 | 0.013 | 0.012 |
| 0.129 | 0.035 | 0.032 | 0.028 | 0.026 | 0.023 | 0.021 | 0.019 | 0.017 | 0.015 | 0.013 | 0.012 |
| 0.1295 | 0.035 | 0.032 | 0.028 | 0.026 | 0.023 | 0.021 | 0.019 | 0.017 | 0.015 | 0.013 | 0.012 |
| 0.13 | 0.035 | 0.032 | 0.029 | 0.026 | 0.023 | 0.021 | 0.019 | 0.017 | 0.015 | 0.013 | 0.012 |
| 0.1305 | 0.035 | 0.032 | 0.029 | 0.026 | 0.023 | 0.021 | 0.019 | 0.017 | 0.015 | 0.013 | 0.012 |
| 0.131 | 0.035 | 0.032 | 0.029 | 0.026 | 0.023 | 0.021 | 0.019 | 0.017 | 0.015 | 0.013 | 0.012 |
| 0.1315 | 0.036 | 0.032 | 0.029 | 0.026 | 0.023 | 0.021 | 0.019 | 0.017 | 0.015 | 0.013 | 0.012 |
| 0.132 | 0.036 | 0.032 | 0.029 | 0.026 | 0.023 | 0.021 | 0.019 | 0.017 | 0.015 | 0.013 | 0.012 |
| 0.1325 | 0.036 | 0.032 | 0.029 | 0.026 | 0.023 | 0.021 | 0.019 | 0.017 | 0.015 | 0.013 | 0.012 |
| 0.133 | 0.036 | 0.032 | 0.029 | 0.026 | 0.023 | 0.021 | 0.019 | 0.017 | 0.015 | 0.013 | 0.012 |
| 0.1335 | 0.036 | 0.032 | 0.029 | 0.026 | 0.023 | 0.021 | 0.019 | 0.017 | 0.015 | 0.013 | 0.012 |
| 0.134 | 0.036 | 0.032 | 0.029 | 0.026 | 0.023 | 0.021 | 0.019 | 0.017 | 0.015 | 0.013 | 0.012 |
| 0.1345 | 0.036 | 0.032 | 0.029 | 0.026 | 0.023 | 0.021 | 0.019 | 0.017 | 0.015 | 0.013 | 0.012 |
| 0.135 | 0.036 | 0.033 | 0.029 | 0.026 | 0.024 | 0.021 | 0.019 | 0.017 | 0.015 | 0.013 | 0.012 |
| 0.1355 | 0.036 | 0.033 | 0.029 | 0.026 | 0.024 | 0.021 | 0.019 | 0.017 | 0.015 | 0.013 | 0.012 |
| 0.136 | 0.036 | 0.033 | 0.029 | 0.026 | 0.024 | 0.021 | 0.019 | 0.017 | 0.015 | 0.013 | 0.012 |
| 0.1365 | 0.036 | 0.033 | 0.029 | 0.026 | 0.024 | 0.021 | 0.019 | 0.017 | 0.015 | 0.013 | 0.012 |
| 0.137 | 0.037 | 0.033 | 0.029 | 0.026 | 0.024 | 0.021 | 0.019 | 0.017 | 0.015 | 0.013 | 0.012 |
| 0.1375 | 0.037 | 0.033 | 0.029 | 0.026 | 0.024 | 0.021 | 0.019 | 0.017 | 0.015 | 0.013 | 0.012 |
| 0.138 | 0.037 | 0.033 | 0.03 | 0.027 | 0.024 | 0.021 | 0.019 | 0.017 | 0.015 | 0.013 | 0.012 |
| 0.1385 | 0.037 | 0.033 | 0.03 | 0.027 | 0.024 | 0.021 | 0.019 | 0.017 | 0.015 | 0.013 | 0.012 |
| 0.139 | 0.037 | 0.033 | 0.03 | 0.027 | 0.024 | 0.021 | 0.019 | 0.017 | 0.015 | 0.013 | 0.012 |
| 0.1395 | 0.037 | 0.033 | 0.03 | 0.027 | 0.024 | 0.021 | 0.019 | 0.017 | 0.015 | 0.013 | 0.012 |
| 0.14 | 0.037 | 0.033 | 0.03 | 0.027 | 0.024 | 0.021 | 0.019 | 0.017 | 0.015 | 0.013 | 0.012 |
| 0.1405 | 0.037 | 0.033 | 0.03 | 0.027 | 0.024 | 0.021 | 0.019 | 0.017 | 0.015 | 0.013 | 0.012 |
| 0.141 | 0.037 | 0.033 | 0.03 | 0.027 | 0.024 | 0.021 | 0.019 | 0.017 | 0.015 | 0.013 | 0.012 |
| 0.1415 | 0.037 | 0.033 | 0.03 | 0.027 | 0.024 | 0.021 | 0.019 | 0.017 | 0.015 | 0.013 | 0.012 |
| 0.142 | 0.037 | 0.034 | 0.03 | 0.027 | 0.024 | 0.021 | 0.019 | 0.017 | 0.015 | 0.013 | 0.012 |
| 0.1425 | 0.037 | 0.034 | 0.03 | 0.027 | 0.024 | 0.022 | 0.019 | 0.017 | 0.015 | 0.013 | 0.012 |
| 0.143 | 0.038 | 0.034 | 0.03 | 0.027 | 0.024 | 0.022 | 0.019 | 0.017 | 0.015 | 0.013 | 0.012 |
| 0.1435 | 0.038 | 0.034 | 0.03 | 0.027 | 0.024 | 0.022 | 0.019 | 0.017 | 0.015 | 0.013 | 0.012 |
| 0.144 | 0.038 | 0.034 | 0.03 | 0.027 | 0.024 | 0.022 | 0.019 | 0.017 | 0.015 | 0.013 | 0.012 |
| 0.1445 | 0.038 | 0.034 | 0.03 | 0.027 | 0.024 | 0.022 | 0.019 | 0.017 | 0.015 | 0.013 | 0.012 |
| 0.145 | 0.038 | 0.034 | 0.03 | 0.027 | 0.024 | 0.022 | 0.019 | 0.017 | 0.015 | 0.013 | 0.012 |
| 0.1455 | 0.038 | 0.034 | 0.03 | 0.027 | 0.024 | 0.022 | 0.019 | 0.017 | 0.015 | 0.013 | 0.012 |
| 0.146 | 0.038 | 0.034 | 0.03 | 0.027 | 0.024 | 0.022 | 0.019 | 0.017 | 0.015 | 0.013 | 0.012 |
| 0.1465 | 0.038 | 0.034 | 0.031 | 0.027 | 0.024 | 0.022 | 0.019 | 0.017 | 0.015 | 0.013 | 0.012 |
| 0.147 | 0.038 | 0.034 | 0.031 | 0.027 | 0.024 | 0.022 | 0.019 | 0.017 | 0.015 | 0.013 | 0.012 |
| 0.1475 | 0.038 | 0.034 | 0.031 | 0.027 | 0.024 | 0.022 | 0.019 | 0.017 | 0.015 | 0.013 | 0.012 |
| 0.148 | 0.038 | 0.034 | 0.031 | 0.027 | 0.024 | 0.022 | 0.019 | 0.017 | 0.015 | 0.013 | 0.012 |
| 0.1485 | 0.038 | 0.034 | 0.031 | 0.027 | 0.024 | 0.022 | 0.019 | 0.017 | 0.015 | 0.013 | 0.011 |
| 0.149 | 0.039 | 0.034 | 0.031 | 0.028 | 0.025 | 0.022 | 0.019 | 0.017 | 0.015 | 0.013 | 0.011 |
| 0.1495 | 0.039 | 0.035 | 0.031 | 0.028 | 0.025 | 0.022 | 0.019 | 0.017 | 0.015 | 0.013 | 0.011 |
| 0.15 | 0.039 | 0.035 | 0.031 | 0.028 | 0.025 | 0.022 | 0.019 | 0.017 | 0.015 | 0.013 | 0.011 |
| 0.1505 | 0.039 | 0.035 | 0.031 | 0.028 | 0.025 | 0.022 | 0.019 | 0.017 | 0.015 | 0.013 | 0.011 |
| 0.151 | 0.039 | 0.035 | 0.031 | 0.028 | 0.025 | 0.022 | 0.019 | 0.017 | 0.015 | 0.013 | 0.011 |
| 0.1515 | 0.039 | 0.035 | 0.031 | 0.028 | 0.025 | 0.022 | 0.019 | 0.017 | 0.015 | 0.013 | 0.011 |
| 0.152 | 0.039 | 0.035 | 0.031 | 0.028 | 0.025 | 0.022 | 0.019 | 0.017 | 0.015 | 0.013 | 0.011 |
| 0.1525 | 0.039 | 0.035 | 0.031 | 0.028 | 0.025 | 0.022 | 0.019 | 0.017 | 0.015 | 0.013 | 0.011 |
| 0.153 | 0.039 | 0.035 | 0.031 | 0.028 | 0.025 | 0.022 | 0.019 | 0.017 | 0.015 | 0.013 | 0.011 |
| 0.1535 | 0.039 | 0.035 | 0.031 | 0.028 | 0.025 | 0.022 | 0.019 | 0.017 | 0.015 | 0.013 | 0.011 |
| 0.154 | 0.039 | 0.035 | 0.031 | 0.028 | 0.025 | 0.022 | 0.02 | 0.017 | 0.015 | 0.013 | 0.011 |
| 0.1545 | 0.039 | 0.035 | 0.031 | 0.028 | 0.025 | 0.022 | 0.02 | 0.017 | 0.015 | 0.013 | 0.011 |
| 0.155 | 0.039 | 0.035 | 0.031 | 0.028 | 0.025 | 0.022 | 0.02 | 0.017 | 0.015 | 0.013 | 0.011 |
| 0.1555 | 0.04 | 0.035 | 0.031 | 0.028 | 0.025 | 0.022 | 0.02 | 0.017 | 0.015 | 0.013 | 0.011 |
| 0.156 | 0.04 | 0.035 | 0.032 | 0.028 | 0.025 | 0.022 | 0.02 | 0.017 | 0.015 | 0.013 | 0.011 |
| 0.1565 | 0.04 | 0.035 | 0.032 | 0.028 | 0.025 | 0.022 | 0.02 | 0.017 | 0.015 | 0.013 | 0.011 |
| 0.157 | 0.04 | 0.035 | 0.032 | 0.028 | 0.025 | 0.022 | 0.02 | 0.017 | 0.015 | 0.013 | 0.011 |
| 0.1575 | 0.04 | 0.036 | 0.032 | 0.028 | 0.025 | 0.022 | 0.02 | 0.017 | 0.015 | 0.013 | 0.011 |
| 0.158 | 0.04 | 0.036 | 0.032 | 0.028 | 0.025 | 0.022 | 0.02 | 0.017 | 0.015 | 0.013 | 0.011 |
| 0.1585 | 0.04 | 0.036 | 0.032 | 0.028 | 0.025 | 0.022 | 0.02 | 0.017 | 0.015 | 0.013 | 0.011 |
| 0.159 | 0.04 | 0.036 | 0.032 | 0.028 | 0.025 | 0.022 | 0.02 | 0.017 | 0.015 | 0.013 | 0.011 |
| 0.1595 | 0.04 | 0.036 | 0.032 | 0.028 | 0.025 | 0.022 | 0.02 | 0.017 | 0.015 | 0.013 | 0.011 |
| 0.16 | 0.04 | 0.036 | 0.032 | 0.028 | 0.025 | 0.022 | 0.02 | 0.017 | 0.015 | 0.013 | 0.011 |
| 0.1605 | 0.04 | 0.036 | 0.032 | 0.028 | 0.025 | 0.022 | 0.02 | 0.017 | 0.015 | 0.013 | 0.011 |
| 0.161 | 0.04 | 0.036 | 0.032 | 0.028 | 0.025 | 0.022 | 0.02 | 0.017 | 0.015 | 0.013 | 0.011 |
| 0.1615 | 0.04 | 0.036 | 0.032 | 0.028 | 0.025 | 0.022 | 0.02 | 0.017 | 0.015 | 0.013 | 0.011 |
| 0.162 | 0.041 | 0.036 | 0.032 | 0.029 | 0.025 | 0.022 | 0.02 | 0.017 | 0.015 | 0.013 | 0.011 |
| 0.1625 | 0.041 | 0.036 | 0.032 | 0.029 | 0.025 | 0.022 | 0.02 | 0.017 | 0.015 | 0.013 | 0.011 |
| 0.163 | 0.041 | 0.036 | 0.032 | 0.029 | 0.025 | 0.022 | 0.02 | 0.017 | 0.015 | 0.013 | 0.011 |
| 0.1635 | 0.041 | 0.036 | 0.032 | 0.029 | 0.025 | 0.022 | 0.02 | 0.017 | 0.015 | 0.013 | 0.011 |
| 0.164 | 0.041 | 0.036 | 0.032 | 0.029 | 0.025 | 0.022 | 0.02 | 0.017 | 0.015 | 0.013 | 0.011 |
| 0.1645 | 0.041 | 0.036 | 0.032 | 0.029 | 0.025 | 0.022 | 0.02 | 0.017 | 0.015 | 0.013 | 0.011 |
| 0.165 | 0.041 | 0.036 | 0.032 | 0.029 | 0.025 | 0.022 | 0.02 | 0.017 | 0.015 | 0.013 | 0.011 |
| 0.1655 | 0.041 | 0.036 | 0.032 | 0.029 | 0.025 | 0.022 | 0.02 | 0.017 | 0.015 | 0.013 | 0.011 |
| 0.166 | 0.041 | 0.037 | 0.032 | 0.029 | 0.025 | 0.022 | 0.02 | 0.017 | 0.015 | 0.013 | 0.011 |
| 0.1665 | 0.041 | 0.037 | 0.032 | 0.029 | 0.025 | 0.022 | 0.02 | 0.017 | 0.015 | 0.013 | 0.011 |
| 0.167 | 0.041 | 0.037 | 0.033 | 0.029 | 0.026 | 0.022 | 0.02 | 0.017 | 0.015 | 0.013 | 0.011 |
| 0.1675 | 0.041 | 0.037 | 0.033 | 0.029 | 0.026 | 0.022 | 0.02 | 0.017 | 0.015 | 0.013 | 0.011 |
| 0.168 | 0.041 | 0.037 | 0.033 | 0.029 | 0.026 | 0.023 | 0.02 | 0.017 | 0.015 | 0.013 | 0.011 |
| 0.1685 | 0.041 | 0.037 | 0.033 | 0.029 | 0.026 | 0.023 | 0.02 | 0.017 | 0.015 | 0.013 | 0.011 |
| 0.169 | 0.042 | 0.037 | 0.033 | 0.029 | 0.026 | 0.023 | 0.02 | 0.017 | 0.015 | 0.013 | 0.011 |
| 0.1695 | 0.042 | 0.037 | 0.033 | 0.029 | 0.026 | 0.023 | 0.02 | 0.017 | 0.015 | 0.013 | 0.011 |
| 0.17 | 0.042 | 0.037 | 0.033 | 0.029 | 0.026 | 0.023 | 0.02 | 0.017 | 0.015 | 0.013 | 0.011 |
| 0.1705 | 0.042 | 0.037 | 0.033 | 0.029 | 0.026 | 0.023 | 0.02 | 0.017 | 0.015 | 0.013 | 0.011 |
| 0.171 | 0.042 | 0.037 | 0.033 | 0.029 | 0.026 | 0.023 | 0.02 | 0.017 | 0.015 | 0.013 | 0.011 |
| 0.1715 | 0.042 | 0.037 | 0.033 | 0.029 | 0.026 | 0.023 | 0.02 | 0.017 | 0.015 | 0.013 | 0.011 |
| 0.172 | 0.042 | 0.037 | 0.033 | 0.029 | 0.026 | 0.023 | 0.02 | 0.017 | 0.015 | 0.013 | 0.011 |
| 0.1725 | 0.042 | 0.037 | 0.033 | 0.029 | 0.026 | 0.023 | 0.02 | 0.017 | 0.015 | 0.013 | 0.011 |
| 0.173 | 0.042 | 0.037 | 0.033 | 0.029 | 0.026 | 0.023 | 0.02 | 0.017 | 0.015 | 0.013 | 0.011 |
| 0.1735 | 0.042 | 0.037 | 0.033 | 0.029 | 0.026 | 0.023 | 0.02 | 0.017 | 0.015 | 0.013 | 0.011 |
| 0.174 | 0.042 | 0.037 | 0.033 | 0.029 | 0.026 | 0.023 | 0.02 | 0.017 | 0.015 | 0.013 | 0.011 |
| 0.1745 | 0.042 | 0.037 | 0.033 | 0.029 | 0.026 | 0.023 | 0.02 | 0.017 | 0.015 | 0.013 | 0.011 |
| 0.175 | 0.042 | 0.038 | 0.033 | 0.029 | 0.026 | 0.023 | 0.02 | 0.017 | 0.015 | 0.013 | 0.01 |
| 0.1755 | 0.042 | 0.038 | 0.033 | 0.029 | 0.026 | 0.023 | 0.02 | 0.017 | 0.015 | 0.012 | 0.01 |
| 0.176 | 0.042 | 0.038 | 0.033 | 0.029 | 0.026 | 0.023 | 0.02 | 0.017 | 0.015 | 0.012 | 0.01 |
| 0.1765 | 0.043 | 0.038 | 0.033 | 0.029 | 0.026 | 0.023 | 0.02 | 0.017 | 0.015 | 0.012 | 0.01 |
| 0.177 | 0.043 | 0.038 | 0.033 | 0.029 | 0.026 | 0.023 | 0.02 | 0.017 | 0.015 | 0.012 | 0.01 |
| 0.1775 | 0.043 | 0.038 | 0.033 | 0.029 | 0.026 | 0.023 | 0.02 | 0.017 | 0.015 | 0.012 | 0.01 |
| 0.178 | 0.043 | 0.038 | 0.033 | 0.03 | 0.026 | 0.023 | 0.02 | 0.017 | 0.015 | 0.012 | 0.01 |
| 0.1785 | 0.043 | 0.038 | 0.033 | 0.03 | 0.026 | 0.023 | 0.02 | 0.017 | 0.015 | 0.012 | 0.01 |
| 0.179 | 0.043 | 0.038 | 0.034 | 0.03 | 0.026 | 0.023 | 0.02 | 0.017 | 0.015 | 0.012 | 0.01 |
| 0.1795 | 0.043 | 0.038 | 0.034 | 0.03 | 0.026 | 0.023 | 0.02 | 0.017 | 0.015 | 0.012 | 0.01 |
| 0.18 | 0.043 | 0.038 | 0.034 | 0.03 | 0.026 | 0.023 | 0.02 | 0.017 | 0.015 | 0.012 | 0.01 |
| 0.1805 | 0.043 | 0.038 | 0.034 | 0.03 | 0.026 | 0.023 | 0.02 | 0.017 | 0.015 | 0.012 | 0.01 |
| 0.181 | 0.043 | 0.038 | 0.034 | 0.03 | 0.026 | 0.023 | 0.02 | 0.017 | 0.015 | 0.012 | 0.01 |
| 0.1815 | 0.043 | 0.038 | 0.034 | 0.03 | 0.026 | 0.023 | 0.02 | 0.017 | 0.015 | 0.012 | 0.01 |
| 0.182 | 0.043 | 0.038 | 0.034 | 0.03 | 0.026 | 0.023 | 0.02 | 0.017 | 0.015 | 0.012 | 0.01 |
| 0.1825 | 0.043 | 0.038 | 0.034 | 0.03 | 0.026 | 0.023 | 0.02 | 0.017 | 0.014 | 0.012 | 0.01 |
| 0.183 | 0.043 | 0.038 | 0.034 | 0.03 | 0.026 | 0.023 | 0.02 | 0.017 | 0.014 | 0.012 | 0.01 |
| 0.1835 | 0.043 | 0.038 | 0.034 | 0.03 | 0.026 | 0.023 | 0.02 | 0.017 | 0.014 | 0.012 | 0.01 |
| 0.184 | 0.043 | 0.038 | 0.034 | 0.03 | 0.026 | 0.023 | 0.02 | 0.017 | 0.014 | 0.012 | 0.01 |
| 0.1845 | 0.044 | 0.038 | 0.034 | 0.03 | 0.026 | 0.023 | 0.02 | 0.017 | 0.014 | 0.012 | 0.01 |
| 0.185 | 0.044 | 0.039 | 0.034 | 0.03 | 0.026 | 0.023 | 0.02 | 0.017 | 0.014 | 0.012 | 0.01 |
| 0.1855 | 0.044 | 0.039 | 0.034 | 0.03 | 0.026 | 0.023 | 0.02 | 0.017 | 0.014 | 0.012 | 0.01 |
| 0.186 | 0.044 | 0.039 | 0.034 | 0.03 | 0.026 | 0.023 | 0.02 | 0.017 | 0.014 | 0.012 | 0.01 |
| 0.1865 | 0.044 | 0.039 | 0.034 | 0.03 | 0.026 | 0.023 | 0.02 | 0.017 | 0.014 | 0.012 | 0.01 |
| 0.187 | 0.044 | 0.039 | 0.034 | 0.03 | 0.026 | 0.023 | 0.02 | 0.017 | 0.014 | 0.012 | 0.01 |
| 0.1875 | 0.044 | 0.039 | 0.034 | 0.03 | 0.026 | 0.023 | 0.02 | 0.017 | 0.014 | 0.012 | 0.01 |
| 0.188 | 0.044 | 0.039 | 0.034 | 0.03 | 0.026 | 0.023 | 0.02 | 0.017 | 0.014 | 0.012 | 0.01 |
| 0.1885 | 0.044 | 0.039 | 0.034 | 0.03 | 0.026 | 0.023 | 0.02 | 0.017 | 0.014 | 0.012 | 0.01 |
| 0.189 | 0.044 | 0.039 | 0.034 | 0.03 | 0.026 | 0.023 | 0.02 | 0.017 | 0.014 | 0.012 | 0.01 |
| 0.1895 | 0.044 | 0.039 | 0.034 | 0.03 | 0.026 | 0.023 | 0.02 | 0.017 | 0.014 | 0.012 | 0.01 |
| 0.19 | 0.044 | 0.039 | 0.034 | 0.03 | 0.026 | 0.023 | 0.02 | 0.017 | 0.014 | 0.012 | 0.01 |
| 0.1905 | 0.044 | 0.039 | 0.034 | 0.03 | 0.026 | 0.023 | 0.02 | 0.017 | 0.014 | 0.012 | 0.01 |
| 0.191 | 0.044 | 0.039 | 0.034 | 0.03 | 0.026 | 0.023 | 0.02 | 0.017 | 0.014 | 0.012 | 0.01 |
| 0.1915 | 0.044 | 0.039 | 0.034 | 0.03 | 0.026 | 0.023 | 0.02 | 0.017 | 0.014 | 0.012 | 0.01 |
| 0.192 | 0.044 | 0.039 | 0.034 | 0.03 | 0.026 | 0.023 | 0.02 | 0.017 | 0.014 | 0.012 | 0.009 |
| 0.1925 | 0.044 | 0.039 | 0.034 | 0.03 | 0.026 | 0.023 | 0.02 | 0.017 | 0.014 | 0.012 | 0.009 |
| 0.193 | 0.045 | 0.039 | 0.035 | 0.03 | 0.026 | 0.023 | 0.02 | 0.017 | 0.014 | 0.012 | 0.009 |
| 0.1935 | 0.045 | 0.039 | 0.035 | 0.03 | 0.026 | 0.023 | 0.02 | 0.017 | 0.014 | 0.012 | 0.009 |
| 0.194 | 0.045 | 0.039 | 0.035 | 0.03 | 0.026 | 0.023 | 0.02 | 0.017 | 0.014 | 0.012 | 0.009 |
| 0.1945 | 0.045 | 0.039 | 0.035 | 0.03 | 0.026 | 0.023 | 0.02 | 0.017 | 0.014 | 0.012 | 0.009 |
| 0.195 | 0.045 | 0.039 | 0.035 | 0.03 | 0.026 | 0.023 | 0.02 | 0.017 | 0.014 | 0.012 | 0.009 |
| 0.1955 | 0.045 | 0.039 | 0.035 | 0.03 | 0.026 | 0.023 | 0.02 | 0.017 | 0.014 | 0.012 | 0.009 |
| 0.196 | 0.045 | 0.04 | 0.035 | 0.03 | 0.026 | 0.023 | 0.02 | 0.017 | 0.014 | 0.011 | 0.009 |
| 0.1965 | 0.045 | 0.04 | 0.035 | 0.03 | 0.026 | 0.023 | 0.02 | 0.017 | 0.014 | 0.011 | 0.009 |
| 0.197 | 0.045 | 0.04 | 0.035 | 0.03 | 0.026 | 0.023 | 0.02 | 0.017 | 0.014 | 0.011 | 0.009 |
| 0.1975 | 0.045 | 0.04 | 0.035 | 0.03 | 0.026 | 0.023 | 0.02 | 0.017 | 0.014 | 0.011 | 0.009 |
| 0.198 | 0.045 | 0.04 | 0.035 | 0.03 | 0.026 | 0.023 | 0.02 | 0.017 | 0.014 | 0.011 | 0.009 |
| 0.1985 | 0.045 | 0.04 | 0.035 | 0.03 | 0.026 | 0.023 | 0.02 | 0.017 | 0.014 | 0.011 | 0.009 |
| 0.199 | 0.045 | 0.04 | 0.035 | 0.03 | 0.026 | 0.023 | 0.02 | 0.017 | 0.014 | 0.011 | 0.009 |
| 0.1995 | 0.045 | 0.04 | 0.035 | 0.03 | 0.026 | 0.023 | 0.02 | 0.017 | 0.014 | 0.011 | 0.009 |
| 0.2 | 0.045 | 0.04 | 0.035 | 0.03 | 0.026 | 0.023 | 0.02 | 0.017 | 0.014 | 0.011 | 0.009 |
| 0.2005 | 0.045 | 0.04 | 0.035 | 0.031 | 0.026 | 0.023 | 0.02 | 0.017 | 0.014 | 0.011 | 0.009 |
| 0.201 | 0.045 | 0.04 | 0.035 | 0.031 | 0.026 | 0.023 | 0.02 | 0.016 | 0.014 | 0.011 | 0.009 |
| 0.2015 | 0.046 | 0.04 | 0.035 | 0.031 | 0.027 | 0.023 | 0.02 | 0.016 | 0.014 | 0.011 | 0.009 |
| 0.202 | 0.046 | 0.04 | 0.035 | 0.031 | 0.027 | 0.023 | 0.02 | 0.016 | 0.014 | 0.011 | 0.009 |
| 0.2025 | 0.046 | 0.04 | 0.035 | 0.031 | 0.027 | 0.023 | 0.019 | 0.016 | 0.014 | 0.011 | 0.009 |
| 0.203 | 0.046 | 0.04 | 0.035 | 0.031 | 0.027 | 0.023 | 0.019 | 0.016 | 0.014 | 0.011 | 0.009 |
| 0.2035 | 0.046 | 0.04 | 0.035 | 0.031 | 0.027 | 0.023 | 0.019 | 0.016 | 0.014 | 0.011 | 0.009 |
| 0.204 | 0.046 | 0.04 | 0.035 | 0.031 | 0.027 | 0.023 | 0.019 | 0.016 | 0.014 | 0.011 | 0.009 |
| 0.2045 | 0.046 | 0.04 | 0.035 | 0.031 | 0.027 | 0.023 | 0.019 | 0.016 | 0.014 | 0.011 | 0.009 |
| 0.205 | 0.046 | 0.04 | 0.035 | 0.031 | 0.027 | 0.023 | 0.019 | 0.016 | 0.014 | 0.011 | 0.009 |
| 0.2055 | 0.046 | 0.04 | 0.035 | 0.031 | 0.027 | 0.023 | 0.019 | 0.016 | 0.013 | 0.011 | 0.008 |
| 0.206 | 0.046 | 0.04 | 0.035 | 0.031 | 0.027 | 0.023 | 0.019 | 0.016 | 0.013 | 0.011 | 0.008 |
| 0.2065 | 0.046 | 0.04 | 0.035 | 0.031 | 0.027 | 0.023 | 0.019 | 0.016 | 0.013 | 0.011 | 0.008 |
| 0.207 | 0.046 | 0.04 | 0.035 | 0.031 | 0.027 | 0.023 | 0.019 | 0.016 | 0.013 | 0.011 | 0.008 |
| 0.2075 | 0.046 | 0.04 | 0.035 | 0.031 | 0.027 | 0.023 | 0.019 | 0.016 | 0.013 | 0.011 | 0.008 |
| 0.208 | 0.046 | 0.04 | 0.035 | 0.031 | 0.027 | 0.023 | 0.019 | 0.016 | 0.013 | 0.011 | 0.008 |
| 0.2085 | 0.046 | 0.041 | 0.035 | 0.031 | 0.027 | 0.023 | 0.019 | 0.016 | 0.013 | 0.011 | 0.008 |
| 0.209 | 0.046 | 0.041 | 0.035 | 0.031 | 0.027 | 0.023 | 0.019 | 0.016 | 0.013 | 0.011 | 0.008 |
| 0.2095 | 0.046 | 0.041 | 0.035 | 0.031 | 0.027 | 0.023 | 0.019 | 0.016 | 0.013 | 0.011 | 0.008 |
| 0.21 | 0.046 | 0.041 | 0.035 | 0.031 | 0.027 | 0.023 | 0.019 | 0.016 | 0.013 | 0.011 | 0.008 |
| 0.2105 | 0.046 | 0.041 | 0.035 | 0.031 | 0.027 | 0.023 | 0.019 | 0.016 | 0.013 | 0.011 | 0.008 |
| 0.211 | 0.047 | 0.041 | 0.036 | 0.031 | 0.027 | 0.023 | 0.019 | 0.016 | 0.013 | 0.011 | 0.008 |
| 0.2115 | 0.047 | 0.041 | 0.036 | 0.031 | 0.027 | 0.023 | 0.019 | 0.016 | 0.013 | 0.01 | 0.008 |
| 0.212 | 0.047 | 0.041 | 0.036 | 0.031 | 0.027 | 0.023 | 0.019 | 0.016 | 0.013 | 0.01 | 0.008 |
| 0.2125 | 0.047 | 0.041 | 0.036 | 0.031 | 0.027 | 0.023 | 0.019 | 0.016 | 0.013 | 0.01 | 0.008 |
| 0.213 | 0.047 | 0.041 | 0.036 | 0.031 | 0.027 | 0.023 | 0.019 | 0.016 | 0.013 | 0.01 | 0.008 |
| 0.2135 | 0.047 | 0.041 | 0.036 | 0.031 | 0.027 | 0.023 | 0.019 | 0.016 | 0.013 | 0.01 | 0.008 |
| 0.214 | 0.047 | 0.041 | 0.036 | 0.031 | 0.027 | 0.023 | 0.019 | 0.016 | 0.013 | 0.01 | 0.008 |
| 0.2145 | 0.047 | 0.041 | 0.036 | 0.031 | 0.027 | 0.023 | 0.019 | 0.016 | 0.013 | 0.01 | 0.008 |
| 0.215 | 0.047 | 0.041 | 0.036 | 0.031 | 0.027 | 0.023 | 0.019 | 0.016 | 0.013 | 0.01 | 0.008 |
| 0.2155 | 0.047 | 0.041 | 0.036 | 0.031 | 0.027 | 0.023 | 0.019 | 0.016 | 0.013 | 0.01 | 0.008 |
| 0.216 | 0.047 | 0.041 | 0.036 | 0.031 | 0.027 | 0.023 | 0.019 | 0.016 | 0.013 | 0.01 | 0.008 |
| 0.2165 | 0.047 | 0.041 | 0.036 | 0.031 | 0.027 | 0.023 | 0.019 | 0.016 | 0.013 | 0.01 | 0.008 |
| 0.217 | 0.047 | 0.041 | 0.036 | 0.031 | 0.027 | 0.023 | 0.019 | 0.016 | 0.013 | 0.01 | 0.008 |
| 0.2175 | 0.047 | 0.041 | 0.036 | 0.031 | 0.027 | 0.023 | 0.019 | 0.016 | 0.013 | 0.01 | 0.008 |
| 0.218 | 0.047 | 0.041 | 0.036 | 0.031 | 0.027 | 0.023 | 0.019 | 0.016 | 0.013 | 0.01 | 0.007 |
| 0.2185 | 0.047 | 0.041 | 0.036 | 0.031 | 0.027 | 0.023 | 0.019 | 0.016 | 0.013 | 0.01 | 0.007 |
| 0.219 | 0.047 | 0.041 | 0.036 | 0.031 | 0.027 | 0.023 | 0.019 | 0.016 | 0.013 | 0.01 | 0.007 |
| 0.2195 | 0.047 | 0.041 | 0.036 | 0.031 | 0.027 | 0.023 | 0.019 | 0.016 | 0.013 | 0.01 | 0.007 |
| 0.22 | 0.047 | 0.041 | 0.036 | 0.031 | 0.027 | 0.023 | 0.019 | 0.016 | 0.013 | 0.01 | 0.007 |
| 0.2205 | 0.047 | 0.041 | 0.036 | 0.031 | 0.027 | 0.023 | 0.019 | 0.016 | 0.013 | 0.01 | 0.007 |
| 0.221 | 0.048 | 0.041 | 0.036 | 0.031 | 0.027 | 0.023 | 0.019 | 0.016 | 0.013 | 0.01 | 0.007 |
| 0.2215 | 0.048 | 0.041 | 0.036 | 0.031 | 0.027 | 0.023 | 0.019 | 0.016 | 0.013 | 0.01 | 0.007 |
| 0.222 | 0.048 | 0.041 | 0.036 | 0.031 | 0.027 | 0.023 | 0.019 | 0.016 | 0.013 | 0.01 | 0.007 |
| 0.2225 | 0.048 | 0.042 | 0.036 | 0.031 | 0.027 | 0.023 | 0.019 | 0.016 | 0.012 | 0.01 | 0.007 |
| 0.223 | 0.048 | 0.042 | 0.036 | 0.031 | 0.027 | 0.023 | 0.019 | 0.016 | 0.012 | 0.01 | 0.007 |
| 0.2235 | 0.048 | 0.042 | 0.036 | 0.031 | 0.027 | 0.023 | 0.019 | 0.015 | 0.012 | 0.01 | 0.007 |
| 0.224 | 0.048 | 0.042 | 0.036 | 0.031 | 0.027 | 0.023 | 0.019 | 0.015 | 0.012 | 0.01 | 0.007 |
| 0.2245 | 0.048 | 0.042 | 0.036 | 0.031 | 0.027 | 0.023 | 0.019 | 0.015 | 0.012 | 0.009 | 0.007 |
| 0.225 | 0.048 | 0.042 | 0.036 | 0.031 | 0.027 | 0.023 | 0.019 | 0.015 | 0.012 | 0.009 | 0.007 |
| 0.2255 | 0.048 | 0.042 | 0.036 | 0.031 | 0.027 | 0.023 | 0.019 | 0.015 | 0.012 | 0.009 | 0.007 |
| 0.226 | 0.048 | 0.042 | 0.036 | 0.031 | 0.027 | 0.023 | 0.019 | 0.015 | 0.012 | 0.009 | 0.007 |
| 0.2265 | 0.048 | 0.042 | 0.036 | 0.031 | 0.027 | 0.023 | 0.019 | 0.015 | 0.012 | 0.009 | 0.007 |
| 0.227 | 0.048 | 0.042 | 0.036 | 0.031 | 0.027 | 0.022 | 0.019 | 0.015 | 0.012 | 0.009 | 0.007 |
| 0.2275 | 0.048 | 0.042 | 0.036 | 0.031 | 0.027 | 0.022 | 0.019 | 0.015 | 0.012 | 0.009 | 0.007 |
| 0.228 | 0.048 | 0.042 | 0.036 | 0.031 | 0.027 | 0.022 | 0.019 | 0.015 | 0.012 | 0.009 | 0.007 |
| 0.2285 | 0.048 | 0.042 | 0.036 | 0.031 | 0.027 | 0.022 | 0.019 | 0.015 | 0.012 | 0.009 | 0.007 |
| 0.229 | 0.048 | 0.042 | 0.036 | 0.031 | 0.027 | 0.022 | 0.019 | 0.015 | 0.012 | 0.009 | 0.006 |
| 0.2295 | 0.048 | 0.042 | 0.036 | 0.031 | 0.027 | 0.022 | 0.019 | 0.015 | 0.012 | 0.009 | 0.006 |
| 0.23 | 0.048 | 0.042 | 0.036 | 0.031 | 0.027 | 0.022 | 0.019 | 0.015 | 0.012 | 0.009 | 0.006 |
| 0.2305 | 0.048 | 0.042 | 0.036 | 0.031 | 0.027 | 0.022 | 0.019 | 0.015 | 0.012 | 0.009 | 0.006 |
| 0.231 | 0.048 | 0.042 | 0.036 | 0.031 | 0.027 | 0.022 | 0.019 | 0.015 | 0.012 | 0.009 | 0.006 |
| 0.2315 | 0.048 | 0.042 | 0.036 | 0.031 | 0.027 | 0.022 | 0.019 | 0.015 | 0.012 | 0.009 | 0.006 |
| 0.232 | 0.049 | 0.042 | 0.036 | 0.031 | 0.027 | 0.022 | 0.019 | 0.015 | 0.012 | 0.009 | 0.006 |
| 0.2325 | 0.049 | 0.042 | 0.036 | 0.031 | 0.027 | 0.022 | 0.019 | 0.015 | 0.012 | 0.009 | 0.006 |
| 0.233 | 0.049 | 0.042 | 0.036 | 0.031 | 0.027 | 0.022 | 0.018 | 0.015 | 0.012 | 0.009 | 0.006 |
| 0.2335 | 0.049 | 0.042 | 0.036 | 0.031 | 0.027 | 0.022 | 0.018 | 0.015 | 0.012 | 0.009 | 0.006 |
| 0.234 | 0.049 | 0.042 | 0.036 | 0.031 | 0.027 | 0.022 | 0.018 | 0.015 | 0.012 | 0.009 | 0.006 |
| 0.2345 | 0.049 | 0.042 | 0.036 | 0.031 | 0.027 | 0.022 | 0.018 | 0.015 | 0.012 | 0.009 | 0.006 |
| 0.235 | 0.049 | 0.042 | 0.037 | 0.031 | 0.027 | 0.022 | 0.018 | 0.015 | 0.012 | 0.009 | 0.006 |
| 0.2355 | 0.049 | 0.042 | 0.037 | 0.031 | 0.027 | 0.022 | 0.018 | 0.015 | 0.012 | 0.009 | 0.006 |
| 0.236 | 0.049 | 0.042 | 0.037 | 0.031 | 0.027 | 0.022 | 0.018 | 0.015 | 0.012 | 0.009 | 0.006 |
| 0.2365 | 0.049 | 0.042 | 0.037 | 0.031 | 0.027 | 0.022 | 0.018 | 0.015 | 0.011 | 0.009 | 0.006 |
| 0.237 | 0.049 | 0.042 | 0.037 | 0.031 | 0.027 | 0.022 | 0.018 | 0.015 | 0.011 | 0.008 | 0.006 |
| 0.2375 | 0.049 | 0.042 | 0.037 | 0.031 | 0.027 | 0.022 | 0.018 | 0.015 | 0.011 | 0.008 | 0.006 |
| 0.238 | 0.049 | 0.042 | 0.037 | 0.031 | 0.027 | 0.022 | 0.018 | 0.015 | 0.011 | 0.008 | 0.006 |
| 0.2385 | 0.049 | 0.043 | 0.037 | 0.031 | 0.027 | 0.022 | 0.018 | 0.015 | 0.011 | 0.008 | 0.006 |
| 0.239 | 0.049 | 0.043 | 0.037 | 0.031 | 0.027 | 0.022 | 0.018 | 0.015 | 0.011 | 0.008 | 0.005 |
| 0.2395 | 0.049 | 0.043 | 0.037 | 0.031 | 0.027 | 0.022 | 0.018 | 0.015 | 0.011 | 0.008 | 0.005 |
| 0.24 | 0.049 | 0.043 | 0.037 | 0.031 | 0.027 | 0.022 | 0.018 | 0.015 | 0.011 | 0.008 | 0.005 |
| 0.2405 | 0.049 | 0.043 | 0.037 | 0.031 | 0.027 | 0.022 | 0.018 | 0.015 | 0.011 | 0.008 | 0.005 |
| 0.241 | 0.049 | 0.043 | 0.037 | 0.031 | 0.027 | 0.022 | 0.018 | 0.014 | 0.011 | 0.008 | 0.005 |
| 0.2415 | 0.049 | 0.043 | 0.037 | 0.031 | 0.027 | 0.022 | 0.018 | 0.014 | 0.011 | 0.008 | 0.005 |
| 0.242 | 0.049 | 0.043 | 0.037 | 0.031 | 0.026 | 0.022 | 0.018 | 0.014 | 0.011 | 0.008 | 0.005 |
| 0.2425 | 0.049 | 0.043 | 0.037 | 0.031 | 0.026 | 0.022 | 0.018 | 0.014 | 0.011 | 0.008 | 0.005 |
| 0.243 | 0.049 | 0.043 | 0.037 | 0.031 | 0.026 | 0.022 | 0.018 | 0.014 | 0.011 | 0.008 | 0.005 |
| 0.2435 | 0.049 | 0.043 | 0.037 | 0.031 | 0.026 | 0.022 | 0.018 | 0.014 | 0.011 | 0.008 | 0.005 |
| 0.244 | 0.05 | 0.043 | 0.037 | 0.031 | 0.026 | 0.022 | 0.018 | 0.014 | 0.011 | 0.008 | 0.005 |
| 0.2445 | 0.05 | 0.043 | 0.037 | 0.031 | 0.026 | 0.022 | 0.018 | 0.014 | 0.011 | 0.008 | 0.005 |
| 0.245 | 0.05 | 0.043 | 0.037 | 0.031 | 0.026 | 0.022 | 0.018 | 0.014 | 0.011 | 0.008 | 0.005 |
| 0.2455 | 0.05 | 0.043 | 0.037 | 0.031 | 0.026 | 0.022 | 0.018 | 0.014 | 0.011 | 0.008 | 0.005 |
| 0.246 | 0.05 | 0.043 | 0.037 | 0.031 | 0.026 | 0.022 | 0.018 | 0.014 | 0.011 | 0.008 | 0.005 |
| 0.2465 | 0.05 | 0.043 | 0.037 | 0.031 | 0.026 | 0.022 | 0.018 | 0.014 | 0.011 | 0.008 | 0.005 |
| 0.247 | 0.05 | 0.043 | 0.037 | 0.031 | 0.026 | 0.022 | 0.018 | 0.014 | 0.011 | 0.008 | 0.005 |
| 0.2475 | 0.05 | 0.043 | 0.037 | 0.031 | 0.026 | 0.022 | 0.018 | 0.014 | 0.011 | 0.008 | 0.005 |
| 0.248 | 0.05 | 0.043 | 0.037 | 0.031 | 0.026 | 0.022 | 0.018 | 0.014 | 0.011 | 0.007 | 0.005 |
| 0.2485 | 0.05 | 0.043 | 0.037 | 0.031 | 0.026 | 0.022 | 0.018 | 0.014 | 0.011 | 0.007 | 0.005 |
| 0.249 | 0.05 | 0.043 | 0.037 | 0.031 | 0.026 | 0.022 | 0.018 | 0.014 | 0.011 | 0.007 | 0.004 |
| 0.2495 | 0.05 | 0.043 | 0.037 | 0.031 | 0.026 | 0.022 | 0.018 | 0.014 | 0.01 | 0.007 | 0.004 |
| 0.25 | 0.05 | 0.043 | 0.037 | 0.031 | 0.026 | 0.022 | 0.018 | 0.014 | 0.01 | 0.007 | 0.004 |
| 0.2505 | 0.05 | 0.043 | 0.037 | 0.031 | 0.026 | 0.022 | 0.018 | 0.014 | 0.01 | 0.007 | 0.004 |
| 0.251 | 0.05 | 0.043 | 0.037 | 0.031 | 0.026 | 0.022 | 0.018 | 0.014 | 0.01 | 0.007 | 0.004 |
| 0.2515 | 0.05 | 0.043 | 0.037 | 0.031 | 0.026 | 0.022 | 0.018 | 0.014 | 0.01 | 0.007 | 0.004 |
| 0.252 | 0.05 | 0.043 | 0.037 | 0.031 | 0.026 | 0.022 | 0.018 | 0.014 | 0.01 | 0.007 | 0.004 |
| 0.2525 | 0.05 | 0.043 | 0.037 | 0.031 | 0.026 | 0.022 | 0.018 | 0.014 | 0.01 | 0.007 | 0.004 |
| 0.253 | 0.05 | 0.043 | 0.037 | 0.031 | 0.026 | 0.022 | 0.018 | 0.014 | 0.01 | 0.007 | 0.004 |
| 0.2535 | 0.05 | 0.043 | 0.037 | 0.031 | 0.026 | 0.022 | 0.017 | 0.014 | 0.01 | 0.007 | 0.004 |
| 0.254 | 0.05 | 0.043 | 0.037 | 0.031 | 0.026 | 0.022 | 0.017 | 0.014 | 0.01 | 0.007 | 0.004 |
| 0.2545 | 0.05 | 0.043 | 0.037 | 0.031 | 0.026 | 0.022 | 0.017 | 0.014 | 0.01 | 0.007 | 0.004 |
| 0.255 | 0.05 | 0.043 | 0.037 | 0.031 | 0.026 | 0.022 | 0.017 | 0.014 | 0.01 | 0.007 | 0.004 |
| 0.2555 | 0.05 | 0.043 | 0.037 | 0.031 | 0.026 | 0.022 | 0.017 | 0.014 | 0.01 | 0.007 | 0.004 |
| 0.256 | 0.05 | 0.043 | 0.037 | 0.031 | 0.026 | 0.022 | 0.017 | 0.013 | 0.01 | 0.007 | 0.004 |
| 0.2565 | 0.05 | 0.043 | 0.037 | 0.031 | 0.026 | 0.022 | 0.017 | 0.013 | 0.01 | 0.007 | 0.004 |
| 0.257 | 0.051 | 0.043 | 0.037 | 0.031 | 0.026 | 0.022 | 0.017 | 0.013 | 0.01 | 0.007 | 0.004 |
| 0.2575 | 0.051 | 0.043 | 0.037 | 0.031 | 0.026 | 0.022 | 0.017 | 0.013 | 0.01 | 0.007 | 0.004 |
| 0.258 | 0.051 | 0.044 | 0.037 | 0.031 | 0.026 | 0.022 | 0.017 | 0.013 | 0.01 | 0.007 | 0.004 |
| 0.2585 | 0.051 | 0.044 | 0.037 | 0.031 | 0.026 | 0.022 | 0.017 | 0.013 | 0.01 | 0.006 | 0.003 |
| 0.259 | 0.051 | 0.044 | 0.037 | 0.031 | 0.026 | 0.021 | 0.017 | 0.013 | 0.01 | 0.006 | 0.003 |
| 0.2595 | 0.051 | 0.044 | 0.037 | 0.031 | 0.026 | 0.021 | 0.017 | 0.013 | 0.01 | 0.006 | 0.003 |
| 0.26 | 0.051 | 0.044 | 0.037 | 0.031 | 0.026 | 0.021 | 0.017 | 0.013 | 0.01 | 0.006 | 0.003 |
| 0.2605 | 0.051 | 0.044 | 0.037 | 0.031 | 0.026 | 0.021 | 0.017 | 0.013 | 0.01 | 0.006 | 0.003 |
| 0.261 | 0.051 | 0.044 | 0.037 | 0.031 | 0.026 | 0.021 | 0.017 | 0.013 | 0.01 | 0.006 | 0.003 |
| 0.2615 | 0.051 | 0.044 | 0.037 | 0.031 | 0.026 | 0.021 | 0.017 | 0.013 | 0.009 | 0.006 | 0.003 |
| 0.262 | 0.051 | 0.044 | 0.037 | 0.031 | 0.026 | 0.021 | 0.017 | 0.013 | 0.009 | 0.006 | 0.003 |
| 0.2625 | 0.051 | 0.044 | 0.037 | 0.031 | 0.026 | 0.021 | 0.017 | 0.013 | 0.009 | 0.006 | 0.003 |
| 0.263 | 0.051 | 0.044 | 0.037 | 0.031 | 0.026 | 0.021 | 0.017 | 0.013 | 0.009 | 0.006 | 0.003 |
| 0.2635 | 0.051 | 0.044 | 0.037 | 0.031 | 0.026 | 0.021 | 0.017 | 0.013 | 0.009 | 0.006 | 0.003 |
| 0.264 | 0.051 | 0.044 | 0.037 | 0.031 | 0.026 | 0.021 | 0.017 | 0.013 | 0.009 | 0.006 | 0.003 |
| 0.2645 | 0.051 | 0.044 | 0.037 | 0.031 | 0.026 | 0.021 | 0.017 | 0.013 | 0.009 | 0.006 | 0.003 |
| 0.265 | 0.051 | 0.044 | 0.037 | 0.031 | 0.026 | 0.021 | 0.017 | 0.013 | 0.009 | 0.006 | 0.003 |
| 0.2655 | 0.051 | 0.044 | 0.037 | 0.031 | 0.026 | 0.021 | 0.017 | 0.013 | 0.009 | 0.006 | 0.003 |
| 0.266 | 0.051 | 0.044 | 0.037 | 0.031 | 0.026 | 0.021 | 0.017 | 0.013 | 0.009 | 0.006 | 0.003 |
| 0.2665 | 0.051 | 0.044 | 0.037 | 0.031 | 0.026 | 0.021 | 0.017 | 0.013 | 0.009 | 0.006 | 0.003 |
| 0.267 | 0.051 | 0.044 | 0.037 | 0.031 | 0.026 | 0.021 | 0.017 | 0.013 | 0.009 | 0.006 | 0.002 |
| 0.2675 | 0.051 | 0.044 | 0.037 | 0.031 | 0.026 | 0.021 | 0.017 | 0.013 | 0.009 | 0.006 | 0.002 |
| 0.268 | 0.051 | 0.044 | 0.037 | 0.031 | 0.026 | 0.021 | 0.017 | 0.013 | 0.009 | 0.006 | 0.002 |
| 0.2685 | 0.051 | 0.044 | 0.037 | 0.031 | 0.026 | 0.021 | 0.017 | 0.013 | 0.009 | 0.005 | 0.002 |
| 0.269 | 0.051 | 0.044 | 0.037 | 0.031 | 0.026 | 0.021 | 0.017 | 0.013 | 0.009 | 0.005 | 0.002 |
| 0.2695 | 0.051 | 0.044 | 0.037 | 0.031 | 0.026 | 0.021 | 0.017 | 0.013 | 0.009 | 0.005 | 0.002 |
| 0.27 | 0.051 | 0.044 | 0.037 | 0.031 | 0.026 | 0.021 | 0.017 | 0.012 | 0.009 | 0.005 | 0.002 |
| 0.2705 | 0.052 | 0.044 | 0.037 | 0.031 | 0.026 | 0.021 | 0.017 | 0.012 | 0.009 | 0.005 | 0.002 |
| 0.271 | 0.052 | 0.044 | 0.037 | 0.031 | 0.026 | 0.021 | 0.016 | 0.012 | 0.009 | 0.005 | 0.002 |
| 0.2715 | 0.052 | 0.044 | 0.037 | 0.031 | 0.026 | 0.021 | 0.016 | 0.012 | 0.009 | 0.005 | 0.002 |
| 0.272 | 0.052 | 0.044 | 0.037 | 0.031 | 0.026 | 0.021 | 0.016 | 0.012 | 0.009 | 0.005 | 0.002 |
| 0.2725 | 0.052 | 0.044 | 0.037 | 0.031 | 0.026 | 0.021 | 0.016 | 0.012 | 0.009 | 0.005 | 0.002 |
| 0.273 | 0.052 | 0.044 | 0.037 | 0.031 | 0.026 | 0.021 | 0.016 | 0.012 | 0.008 | 0.005 | 0.002 |
| 0.2735 | 0.052 | 0.044 | 0.037 | 0.031 | 0.026 | 0.021 | 0.016 | 0.012 | 0.008 | 0.005 | 0.002 |
| 0.274 | 0.052 | 0.044 | 0.037 | 0.031 | 0.026 | 0.021 | 0.016 | 0.012 | 0.008 | 0.005 | 0.002 |
| 0.2745 | 0.052 | 0.044 | 0.037 | 0.031 | 0.026 | 0.021 | 0.016 | 0.012 | 0.008 | 0.005 | 0.002 |
| 0.275 | 0.052 | 0.044 | 0.037 | 0.031 | 0.026 | 0.021 | 0.016 | 0.012 | 0.008 | 0.005 | 0.002 |
| 0.2755 | 0.052 | 0.044 | 0.037 | 0.031 | 0.026 | 0.021 | 0.016 | 0.012 | 0.008 | 0.005 | 0.002 |
| 0.276 | 0.052 | 0.044 | 0.037 | 0.031 | 0.026 | 0.021 | 0.016 | 0.012 | 0.008 | 0.005 | 0.001 |
| 0.2765 | 0.052 | 0.044 | 0.037 | 0.031 | 0.026 | 0.021 | 0.016 | 0.012 | 0.008 | 0.005 | 0.001 |
| 0.277 | 0.052 | 0.044 | 0.037 | 0.031 | 0.026 | 0.021 | 0.016 | 0.012 | 0.008 | 0.005 | 0.001 |
| 0.2775 | 0.052 | 0.044 | 0.037 | 0.031 | 0.026 | 0.021 | 0.016 | 0.012 | 0.008 | 0.005 | 0.001 |
| 0.278 | 0.052 | 0.044 | 0.037 | 0.031 | 0.026 | 0.021 | 0.016 | 0.012 | 0.008 | 0.004 | 0.001 |
| 0.2785 | 0.052 | 0.044 | 0.038 | 0.031 | 0.026 | 0.021 | 0.016 | 0.012 | 0.008 | 0.004 | 0.001 |
| 0.279 | 0.052 | 0.044 | 0.038 | 0.031 | 0.026 | 0.021 | 0.016 | 0.012 | 0.008 | 0.004 | 0.001 |
| 0.2795 | 0.052 | 0.044 | 0.038 | 0.031 | 0.026 | 0.021 | 0.016 | 0.012 | 0.008 | 0.004 | 0.001 |
| 0.28 | 0.052 | 0.044 | 0.038 | 0.031 | 0.026 | 0.021 | 0.016 | 0.012 | 0.008 | 0.004 | 0.001 |
| 0.2805 | 0.052 | 0.044 | 0.038 | 0.031 | 0.026 | 0.021 | 0.016 | 0.012 | 0.008 | 0.004 | 0.001 |
| 0.281 | 0.052 | 0.044 | 0.038 | 0.031 | 0.026 | 0.021 | 0.016 | 0.012 | 0.008 | 0.004 | 0.001 |
| 0.2815 | 0.052 | 0.044 | 0.038 | 0.031 | 0.026 | 0.02 | 0.016 | 0.012 | 0.008 | 0.004 | 0.001 |
| 0.282 | 0.052 | 0.045 | 0.038 | 0.031 | 0.026 | 0.02 | 0.016 | 0.012 | 0.008 | 0.004 | 0.001 |
| 0.2825 | 0.052 | 0.045 | 0.038 | 0.031 | 0.026 | 0.02 | 0.016 | 0.011 | 0.008 | 0.004 | 0.001 |
| 0.283 | 0.052 | 0.045 | 0.038 | 0.031 | 0.026 | 0.02 | 0.016 | 0.011 | 0.008 | 0.004 | 0.001 |
| 0.2835 | 0.052 | 0.045 | 0.038 | 0.031 | 0.026 | 0.02 | 0.016 | 0.011 | 0.007 | 0.004 | 0.001 |
| 0.284 | 0.052 | 0.045 | 0.038 | 0.031 | 0.026 | 0.02 | 0.016 | 0.011 | 0.007 | 0.004 | 0.001 |
| 0.2845 | 0.052 | 0.045 | 0.038 | 0.031 | 0.026 | 0.02 | 0.016 | 0.011 | 0.007 | 0.004 | 0 |
| 0.285 | 0.052 | 0.045 | 0.038 | 0.031 | 0.026 | 0.02 | 0.016 | 0.011 | 0.007 | 0.004 | 0 |
| 0.2855 | 0.053 | 0.045 | 0.038 | 0.031 | 0.025 | 0.02 | 0.016 | 0.011 | 0.007 | 0.004 | 0 |
| 0.286 | 0.053 | 0.045 | 0.038 | 0.031 | 0.025 | 0.02 | 0.016 | 0.011 | 0.007 | 0.004 | 0 |
| 0.2865 | 0.053 | 0.045 | 0.038 | 0.031 | 0.025 | 0.02 | 0.015 | 0.011 | 0.007 | 0.004 | 0 |
| 0.287 | 0.053 | 0.045 | 0.038 | 0.031 | 0.025 | 0.02 | 0.015 | 0.011 | 0.007 | 0.004 | 0 |
| 0.2875 | 0.053 | 0.045 | 0.038 | 0.031 | 0.025 | 0.02 | 0.015 | 0.011 | 0.007 | 0.003 | 0 |
| 0.288 | 0.053 | 0.045 | 0.038 | 0.031 | 0.025 | 0.02 | 0.015 | 0.011 | 0.007 | 0.003 | 0 |
| 0.2885 | 0.053 | 0.045 | 0.038 | 0.031 | 0.025 | 0.02 | 0.015 | 0.011 | 0.007 | 0.003 | 0 |
| 0.289 | 0.053 | 0.045 | 0.038 | 0.031 | 0.025 | 0.02 | 0.015 | 0.011 | 0.007 | 0.003 | 0 |
| 0.2895 | 0.053 | 0.045 | 0.038 | 0.031 | 0.025 | 0.02 | 0.015 | 0.011 | 0.007 | 0.003 | 0 |
| 0.29 | 0.053 | 0.045 | 0.038 | 0.031 | 0.025 | 0.02 | 0.015 | 0.011 | 0.007 | 0.003 | 0 |
| 0.2905 | 0.053 | 0.045 | 0.038 | 0.031 | 0.025 | 0.02 | 0.015 | 0.011 | 0.007 | 0.003 | 0 |
| 0.291 | 0.053 | 0.045 | 0.038 | 0.031 | 0.025 | 0.02 | 0.015 | 0.011 | 0.007 | 0.003 | 0 |
| 0.2915 | 0.053 | 0.045 | 0.038 | 0.031 | 0.025 | 0.02 | 0.015 | 0.011 | 0.007 | 0.003 | 0 |
| 0.292 | 0.053 | 0.045 | 0.038 | 0.031 | 0.025 | 0.02 | 0.015 | 0.011 | 0.007 | 0.003 | 0 |
| 0.2925 | 0.053 | 0.045 | 0.038 | 0.031 | 0.025 | 0.02 | 0.015 | 0.011 | 0.007 | 0.003 | -0.001 |
| 0.293 | 0.053 | 0.045 | 0.038 | 0.031 | 0.025 | 0.02 | 0.015 | 0.011 | 0.007 | 0.003 | -0.001 |
| 0.2935 | 0.053 | 0.045 | 0.038 | 0.031 | 0.025 | 0.02 | 0.015 | 0.011 | 0.007 | 0.003 | -0.001 |
| 0.294 | 0.053 | 0.045 | 0.038 | 0.031 | 0.025 | 0.02 | 0.015 | 0.011 | 0.006 | 0.003 | -0.001 |
| 0.2945 | 0.053 | 0.045 | 0.038 | 0.031 | 0.025 | 0.02 | 0.015 | 0.01 | 0.006 | 0.003 | -0.001 |
| 0.295 | 0.053 | 0.045 | 0.038 | 0.031 | 0.025 | 0.02 | 0.015 | 0.01 | 0.006 | 0.003 | -0.001 |
| 0.2955 | 0.053 | 0.045 | 0.038 | 0.031 | 0.025 | 0.02 | 0.015 | 0.01 | 0.006 | 0.003 | -0.001 |
| 0.296 | 0.053 | 0.045 | 0.038 | 0.031 | 0.025 | 0.02 | 0.015 | 0.01 | 0.006 | 0.003 | -0.001 |
| 0.2965 | 0.053 | 0.045 | 0.038 | 0.031 | 0.025 | 0.02 | 0.015 | 0.01 | 0.006 | 0.002 | -0.001 |
| 0.297 | 0.053 | 0.045 | 0.038 | 0.031 | 0.025 | 0.02 | 0.015 | 0.01 | 0.006 | 0.002 | -0.001 |
| 0.2975 | 0.053 | 0.045 | 0.038 | 0.031 | 0.025 | 0.02 | 0.015 | 0.01 | 0.006 | 0.002 | -0.001 |
| 0.298 | 0.053 | 0.045 | 0.038 | 0.031 | 0.025 | 0.02 | 0.015 | 0.01 | 0.006 | 0.002 | -0.001 |
| 0.2985 | 0.053 | 0.045 | 0.038 | 0.031 | 0.025 | 0.02 | 0.015 | 0.01 | 0.006 | 0.002 | -0.001 |
| 0.299 | 0.053 | 0.045 | 0.038 | 0.031 | 0.025 | 0.02 | 0.015 | 0.01 | 0.006 | 0.002 | -0.001 |
| 0.2995 | 0.053 | 0.045 | 0.038 | 0.031 | 0.025 | 0.02 | 0.015 | 0.01 | 0.006 | 0.002 | -0.001 |
| 0.3 | 0.053 | 0.045 | 0.038 | 0.031 | 0.025 | 0.02 | 0.015 | 0.01 | 0.006 | 0.002 | -0.001 |
| 0.3005 | 0.053 | 0.045 | 0.038 | 0.031 | 0.025 | 0.02 | 0.015 | 0.01 | 0.006 | 0.002 | -0.001 |
| 0.301 | 0.053 | 0.045 | 0.038 | 0.031 | 0.025 | 0.019 | 0.015 | 0.01 | 0.006 | 0.002 | -0.002 |
| 0.3015 | 0.053 | 0.045 | 0.038 | 0.031 | 0.025 | 0.019 | 0.014 | 0.01 | 0.006 | 0.002 | -0.002 |
| 0.302 | 0.054 | 0.045 | 0.038 | 0.031 | 0.025 | 0.019 | 0.014 | 0.01 | 0.006 | 0.002 | -0.002 |
| 0.3025 | 0.054 | 0.045 | 0.038 | 0.031 | 0.025 | 0.019 | 0.014 | 0.01 | 0.006 | 0.002 | -0.002 |
| 0.303 | 0.054 | 0.045 | 0.038 | 0.031 | 0.025 | 0.019 | 0.014 | 0.01 | 0.006 | 0.002 | -0.002 |
| 0.3035 | 0.054 | 0.045 | 0.038 | 0.031 | 0.025 | 0.019 | 0.014 | 0.01 | 0.006 | 0.002 | -0.002 |
| 0.304 | 0.054 | 0.045 | 0.038 | 0.031 | 0.025 | 0.019 | 0.014 | 0.01 | 0.005 | 0.002 | -0.002 |
| 0.3045 | 0.054 | 0.045 | 0.038 | 0.031 | 0.025 | 0.019 | 0.014 | 0.01 | 0.005 | 0.002 | -0.002 |
| 0.305 | 0.054 | 0.045 | 0.038 | 0.031 | 0.025 | 0.019 | 0.014 | 0.01 | 0.005 | 0.002 | -0.002 |
| 0.3055 | 0.054 | 0.045 | 0.038 | 0.031 | 0.025 | 0.019 | 0.014 | 0.01 | 0.005 | 0.001 | -0.002 |
| 0.306 | 0.054 | 0.045 | 0.038 | 0.031 | 0.025 | 0.019 | 0.014 | 0.01 | 0.005 | 0.001 | -0.002 |
| 0.3065 | 0.054 | 0.045 | 0.038 | 0.031 | 0.025 | 0.019 | 0.014 | 0.009 | 0.005 | 0.001 | -0.002 |
| 0.307 | 0.054 | 0.045 | 0.038 | 0.031 | 0.025 | 0.019 | 0.014 | 0.009 | 0.005 | 0.001 | -0.002 |
| 0.3075 | 0.054 | 0.045 | 0.038 | 0.031 | 0.025 | 0.019 | 0.014 | 0.009 | 0.005 | 0.001 | -0.002 |
| 0.308 | 0.054 | 0.045 | 0.038 | 0.031 | 0.025 | 0.019 | 0.014 | 0.009 | 0.005 | 0.001 | -0.002 |
| 0.3085 | 0.054 | 0.045 | 0.038 | 0.031 | 0.025 | 0.019 | 0.014 | 0.009 | 0.005 | 0.001 | -0.002 |
| 0.309 | 0.054 | 0.045 | 0.038 | 0.031 | 0.025 | 0.019 | 0.014 | 0.009 | 0.005 | 0.001 | -0.003 |
| 0.3095 | 0.054 | 0.045 | 0.038 | 0.031 | 0.025 | 0.019 | 0.014 | 0.009 | 0.005 | 0.001 | -0.003 |
| 0.31 | 0.054 | 0.045 | 0.038 | 0.031 | 0.025 | 0.019 | 0.014 | 0.009 | 0.005 | 0.001 | -0.003 |
| 0.3105 | 0.054 | 0.045 | 0.038 | 0.031 | 0.025 | 0.019 | 0.014 | 0.009 | 0.005 | 0.001 | -0.003 |
| 0.311 | 0.054 | 0.045 | 0.038 | 0.031 | 0.025 | 0.019 | 0.014 | 0.009 | 0.005 | 0.001 | -0.003 |
| 0.3115 | 0.054 | 0.046 | 0.038 | 0.031 | 0.025 | 0.019 | 0.014 | 0.009 | 0.005 | 0.001 | -0.003 |
| 0.312 | 0.054 | 0.046 | 0.038 | 0.031 | 0.025 | 0.019 | 0.014 | 0.009 | 0.005 | 0.001 | -0.003 |
| 0.3125 | 0.054 | 0.046 | 0.038 | 0.031 | 0.025 | 0.019 | 0.014 | 0.009 | 0.005 | 0.001 | -0.003 |
| 0.313 | 0.054 | 0.046 | 0.038 | 0.031 | 0.025 | 0.019 | 0.014 | 0.009 | 0.005 | 0.001 | -0.003 |
| 0.3135 | 0.054 | 0.046 | 0.038 | 0.031 | 0.025 | 0.019 | 0.014 | 0.009 | 0.005 | 0.001 | -0.003 |
| 0.314 | 0.054 | 0.046 | 0.038 | 0.031 | 0.025 | 0.019 | 0.014 | 0.009 | 0.004 | 0 | -0.003 |
| 0.3145 | 0.054 | 0.046 | 0.038 | 0.031 | 0.025 | 0.019 | 0.014 | 0.009 | 0.004 | 0 | -0.003 |
| 0.315 | 0.054 | 0.046 | 0.038 | 0.031 | 0.024 | 0.019 | 0.014 | 0.009 | 0.004 | 0 | -0.003 |
| 0.3155 | 0.054 | 0.046 | 0.038 | 0.031 | 0.024 | 0.019 | 0.013 | 0.009 | 0.004 | 0 | -0.003 |
| 0.316 | 0.054 | 0.046 | 0.038 | 0.031 | 0.024 | 0.019 | 0.013 | 0.009 | 0.004 | 0 | -0.003 |
| 0.3165 | 0.054 | 0.046 | 0.038 | 0.031 | 0.024 | 0.019 | 0.013 | 0.009 | 0.004 | 0 | -0.003 |
| 0.317 | 0.054 | 0.046 | 0.038 | 0.031 | 0.024 | 0.019 | 0.013 | 0.009 | 0.004 | 0 | -0.004 |
| 0.3175 | 0.054 | 0.046 | 0.038 | 0.031 | 0.024 | 0.019 | 0.013 | 0.009 | 0.004 | 0 | -0.004 |
| 0.318 | 0.054 | 0.046 | 0.038 | 0.031 | 0.024 | 0.019 | 0.013 | 0.008 | 0.004 | 0 | -0.004 |
| 0.3185 | 0.055 | 0.046 | 0.038 | 0.031 | 0.024 | 0.019 | 0.013 | 0.008 | 0.004 | 0 | -0.004 |
| 0.319 | 0.055 | 0.046 | 0.038 | 0.031 | 0.024 | 0.019 | 0.013 | 0.008 | 0.004 | 0 | -0.004 |
| 0.3195 | 0.055 | 0.046 | 0.038 | 0.031 | 0.024 | 0.018 | 0.013 | 0.008 | 0.004 | 0 | -0.004 |
| 0.32 | 0.055 | 0.046 | 0.038 | 0.031 | 0.024 | 0.018 | 0.013 | 0.008 | 0.004 | 0 | -0.004 |
| 0.3205 | 0.055 | 0.046 | 0.038 | 0.031 | 0.024 | 0.018 | 0.013 | 0.008 | 0.004 | 0 | -0.004 |
| 0.321 | 0.055 | 0.046 | 0.038 | 0.031 | 0.024 | 0.018 | 0.013 | 0.008 | 0.004 | 0 | -0.004 |
| 0.3215 | 0.055 | 0.046 | 0.038 | 0.031 | 0.024 | 0.018 | 0.013 | 0.008 | 0.004 | 0 | -0.004 |
| 0.322 | 0.055 | 0.046 | 0.038 | 0.031 | 0.024 | 0.018 | 0.013 | 0.008 | 0.004 | 0 | -0.004 |
| 0.3225 | 0.055 | 0.046 | 0.038 | 0.031 | 0.024 | 0.018 | 0.013 | 0.008 | 0.004 | 0 | -0.004 |
| 0.323 | 0.055 | 0.046 | 0.038 | 0.031 | 0.024 | 0.018 | 0.013 | 0.008 | 0.004 | -0.001 | -0.004 |
| 0.3235 | 0.055 | 0.046 | 0.038 | 0.031 | 0.024 | 0.018 | 0.013 | 0.008 | 0.004 | -0.001 | -0.004 |
| 0.324 | 0.055 | 0.046 | 0.038 | 0.031 | 0.024 | 0.018 | 0.013 | 0.008 | 0.003 | -0.001 | -0.004 |
| 0.3245 | 0.055 | 0.046 | 0.038 | 0.031 | 0.024 | 0.018 | 0.013 | 0.008 | 0.003 | -0.001 | -0.004 |
| 0.325 | 0.055 | 0.046 | 0.038 | 0.031 | 0.024 | 0.018 | 0.013 | 0.008 | 0.003 | -0.001 | -0.005 |
| 0.3255 | 0.055 | 0.046 | 0.038 | 0.031 | 0.024 | 0.018 | 0.013 | 0.008 | 0.003 | -0.001 | -0.005 |
| 0.326 | 0.055 | 0.046 | 0.038 | 0.031 | 0.024 | 0.018 | 0.013 | 0.008 | 0.003 | -0.001 | -0.005 |
| 0.3265 | 0.055 | 0.046 | 0.038 | 0.031 | 0.024 | 0.018 | 0.013 | 0.008 | 0.003 | -0.001 | -0.005 |
| 0.327 | 0.055 | 0.046 | 0.038 | 0.031 | 0.024 | 0.018 | 0.013 | 0.008 | 0.003 | -0.001 | -0.005 |
| 0.3275 | 0.055 | 0.046 | 0.038 | 0.031 | 0.024 | 0.018 | 0.013 | 0.008 | 0.003 | -0.001 | -0.005 |
| 0.328 | 0.055 | 0.046 | 0.038 | 0.031 | 0.024 | 0.018 | 0.013 | 0.008 | 0.003 | -0.001 | -0.005 |
| 0.3285 | 0.055 | 0.046 | 0.038 | 0.031 | 0.024 | 0.018 | 0.013 | 0.008 | 0.003 | -0.001 | -0.005 |
| 0.329 | 0.055 | 0.046 | 0.038 | 0.031 | 0.024 | 0.018 | 0.012 | 0.008 | 0.003 | -0.001 | -0.005 |
| 0.3295 | 0.055 | 0.046 | 0.038 | 0.031 | 0.024 | 0.018 | 0.012 | 0.007 | 0.003 | -0.001 | -0.005 |
| 0.33 | 0.055 | 0.046 | 0.038 | 0.031 | 0.024 | 0.018 | 0.012 | 0.007 | 0.003 | -0.001 | -0.005 |
| 0.3305 | 0.055 | 0.046 | 0.038 | 0.031 | 0.024 | 0.018 | 0.012 | 0.007 | 0.003 | -0.001 | -0.005 |
| 0.331 | 0.055 | 0.046 | 0.038 | 0.031 | 0.024 | 0.018 | 0.012 | 0.007 | 0.003 | -0.001 | -0.005 |
| 0.3315 | 0.055 | 0.046 | 0.038 | 0.031 | 0.024 | 0.018 | 0.012 | 0.007 | 0.003 | -0.002 | -0.005 |
| 0.332 | 0.055 | 0.046 | 0.038 | 0.031 | 0.024 | 0.018 | 0.012 | 0.007 | 0.003 | -0.002 | -0.005 |
| 0.3325 | 0.055 | 0.046 | 0.038 | 0.031 | 0.024 | 0.018 | 0.012 | 0.007 | 0.003 | -0.002 | -0.006 |
| 0.333 | 0.055 | 0.046 | 0.038 | 0.031 | 0.024 | 0.018 | 0.012 | 0.007 | 0.003 | -0.002 | -0.006 |
| 0.3335 | 0.055 | 0.046 | 0.038 | 0.03 | 0.024 | 0.018 | 0.012 | 0.007 | 0.002 | -0.002 | -0.006 |
| 0.334 | 0.055 | 0.046 | 0.038 | 0.03 | 0.024 | 0.018 | 0.012 | 0.007 | 0.002 | -0.002 | -0.006 |
| 0.3345 | 0.055 | 0.046 | 0.038 | 0.03 | 0.024 | 0.018 | 0.012 | 0.007 | 0.002 | -0.002 | -0.006 |
| 0.335 | 0.055 | 0.046 | 0.038 | 0.03 | 0.024 | 0.018 | 0.012 | 0.007 | 0.002 | -0.002 | -0.006 |
| 0.3355 | 0.055 | 0.046 | 0.038 | 0.03 | 0.024 | 0.018 | 0.012 | 0.007 | 0.002 | -0.002 | -0.006 |
| 0.336 | 0.056 | 0.046 | 0.038 | 0.03 | 0.024 | 0.018 | 0.012 | 0.007 | 0.002 | -0.002 | -0.006 |
| 0.3365 | 0.056 | 0.046 | 0.038 | 0.03 | 0.024 | 0.018 | 0.012 | 0.007 | 0.002 | -0.002 | -0.006 |
| 0.337 | 0.056 | 0.046 | 0.038 | 0.03 | 0.024 | 0.018 | 0.012 | 0.007 | 0.002 | -0.002 | -0.006 |
| 0.3375 | 0.056 | 0.046 | 0.038 | 0.03 | 0.024 | 0.017 | 0.012 | 0.007 | 0.002 | -0.002 | -0.006 |
| 0.338 | 0.056 | 0.046 | 0.038 | 0.03 | 0.024 | 0.017 | 0.012 | 0.007 | 0.002 | -0.002 | -0.006 |
| 0.3385 | 0.056 | 0.046 | 0.038 | 0.03 | 0.024 | 0.017 | 0.012 | 0.007 | 0.002 | -0.002 | -0.006 |
| 0.339 | 0.056 | 0.046 | 0.038 | 0.03 | 0.024 | 0.017 | 0.012 | 0.007 | 0.002 | -0.002 | -0.006 |
| 0.3395 | 0.056 | 0.046 | 0.038 | 0.03 | 0.024 | 0.017 | 0.012 | 0.007 | 0.002 | -0.002 | -0.006 |
| 0.34 | 0.056 | 0.046 | 0.038 | 0.03 | 0.024 | 0.017 | 0.012 | 0.007 | 0.002 | -0.002 | -0.006 |
| 0.3405 | 0.056 | 0.046 | 0.038 | 0.03 | 0.024 | 0.017 | 0.012 | 0.006 | 0.002 | -0.003 | -0.007 |
| 0.341 | 0.056 | 0.046 | 0.038 | 0.03 | 0.024 | 0.017 | 0.012 | 0.006 | 0.002 | -0.003 | -0.007 |
| 0.3415 | 0.056 | 0.046 | 0.038 | 0.03 | 0.023 | 0.017 | 0.012 | 0.006 | 0.002 | -0.003 | -0.007 |
| 0.342 | 0.056 | 0.046 | 0.038 | 0.03 | 0.023 | 0.017 | 0.012 | 0.006 | 0.002 | -0.003 | -0.007 |
| 0.3425 | 0.056 | 0.046 | 0.038 | 0.03 | 0.023 | 0.017 | 0.012 | 0.006 | 0.002 | -0.003 | -0.007 |
| 0.343 | 0.056 | 0.046 | 0.038 | 0.03 | 0.023 | 0.017 | 0.011 | 0.006 | 0.002 | -0.003 | -0.007 |
| 0.3435 | 0.056 | 0.046 | 0.038 | 0.03 | 0.023 | 0.017 | 0.011 | 0.006 | 0.001 | -0.003 | -0.007 |
| 0.344 | 0.056 | 0.046 | 0.038 | 0.03 | 0.023 | 0.017 | 0.011 | 0.006 | 0.001 | -0.003 | -0.007 |
| 0.3445 | 0.056 | 0.046 | 0.038 | 0.03 | 0.023 | 0.017 | 0.011 | 0.006 | 0.001 | -0.003 | -0.007 |
| 0.345 | 0.056 | 0.047 | 0.038 | 0.03 | 0.023 | 0.017 | 0.011 | 0.006 | 0.001 | -0.003 | -0.007 |
| 0.3455 | 0.056 | 0.047 | 0.038 | 0.03 | 0.023 | 0.017 | 0.011 | 0.006 | 0.001 | -0.003 | -0.007 |
| 0.346 | 0.056 | 0.047 | 0.038 | 0.03 | 0.023 | 0.017 | 0.011 | 0.006 | 0.001 | -0.003 | -0.007 |
| 0.3465 | 0.056 | 0.047 | 0.038 | 0.03 | 0.023 | 0.017 | 0.011 | 0.006 | 0.001 | -0.003 | -0.007 |
| 0.347 | 0.056 | 0.047 | 0.038 | 0.03 | 0.023 | 0.017 | 0.011 | 0.006 | 0.001 | -0.003 | -0.007 |
| 0.3475 | 0.056 | 0.047 | 0.038 | 0.03 | 0.023 | 0.017 | 0.011 | 0.006 | 0.001 | -0.003 | -0.007 |
| 0.348 | 0.056 | 0.047 | 0.038 | 0.03 | 0.023 | 0.017 | 0.011 | 0.006 | 0.001 | -0.003 | -0.007 |
| 0.3485 | 0.056 | 0.047 | 0.038 | 0.03 | 0.023 | 0.017 | 0.011 | 0.006 | 0.001 | -0.003 | -0.008 |
| 0.349 | 0.056 | 0.047 | 0.038 | 0.03 | 0.023 | 0.017 | 0.011 | 0.006 | 0.001 | -0.004 | -0.008 |
| 0.3495 | 0.056 | 0.047 | 0.038 | 0.03 | 0.023 | 0.017 | 0.011 | 0.006 | 0.001 | -0.004 | -0.008 |
| 0.35 | 0.056 | 0.047 | 0.038 | 0.03 | 0.023 | 0.017 | 0.011 | 0.006 | 0.001 | -0.004 | -0.008 |
| 0.3505 | 0.056 | 0.047 | 0.038 | 0.03 | 0.023 | 0.017 | 0.011 | 0.006 | 0.001 | -0.004 | -0.008 |
| 0.351 | 0.056 | 0.047 | 0.038 | 0.03 | 0.023 | 0.017 | 0.011 | 0.006 | 0.001 | -0.004 | -0.008 |
| 0.3515 | 0.056 | 0.047 | 0.038 | 0.03 | 0.023 | 0.017 | 0.011 | 0.006 | 0.001 | -0.004 | -0.008 |
| 0.352 | 0.056 | 0.047 | 0.038 | 0.03 | 0.023 | 0.017 | 0.011 | 0.005 | 0.001 | -0.004 | -0.008 |
| 0.3525 | 0.056 | 0.047 | 0.038 | 0.03 | 0.023 | 0.017 | 0.011 | 0.005 | 0.001 | -0.004 | -0.008 |
| 0.353 | 0.056 | 0.047 | 0.038 | 0.03 | 0.023 | 0.017 | 0.011 | 0.005 | 0.001 | -0.004 | -0.008 |
| 0.3535 | 0.057 | 0.047 | 0.038 | 0.03 | 0.023 | 0.017 | 0.011 | 0.005 | 0 | -0.004 | -0.008 |
| 0.354 | 0.057 | 0.047 | 0.038 | 0.03 | 0.023 | 0.017 | 0.011 | 0.005 | 0 | -0.004 | -0.008 |
| 0.3545 | 0.057 | 0.047 | 0.038 | 0.03 | 0.023 | 0.017 | 0.011 | 0.005 | 0 | -0.004 | -0.008 |
| 0.355 | 0.057 | 0.047 | 0.038 | 0.03 | 0.023 | 0.016 | 0.011 | 0.005 | 0 | -0.004 | -0.008 |
| 0.3555 | 0.057 | 0.047 | 0.038 | 0.03 | 0.023 | 0.016 | 0.011 | 0.005 | 0 | -0.004 | -0.008 |
| 0.356 | 0.057 | 0.047 | 0.038 | 0.03 | 0.023 | 0.016 | 0.011 | 0.005 | 0 | -0.004 | -0.008 |
| 0.3565 | 0.057 | 0.047 | 0.038 | 0.03 | 0.023 | 0.016 | 0.01 | 0.005 | 0 | -0.004 | -0.009 |
| 0.357 | 0.057 | 0.047 | 0.038 | 0.03 | 0.023 | 0.016 | 0.01 | 0.005 | 0 | -0.004 | -0.009 |
| 0.3575 | 0.057 | 0.047 | 0.038 | 0.03 | 0.023 | 0.016 | 0.01 | 0.005 | 0 | -0.004 | -0.009 |
| 0.358 | 0.057 | 0.047 | 0.038 | 0.03 | 0.023 | 0.016 | 0.01 | 0.005 | 0 | -0.005 | -0.009 |
| 0.3585 | 0.057 | 0.047 | 0.038 | 0.03 | 0.023 | 0.016 | 0.01 | 0.005 | 0 | -0.005 | -0.009 |
| 0.359 | 0.057 | 0.047 | 0.038 | 0.03 | 0.023 | 0.016 | 0.01 | 0.005 | 0 | -0.005 | -0.009 |
| 0.3595 | 0.057 | 0.047 | 0.038 | 0.03 | 0.023 | 0.016 | 0.01 | 0.005 | 0 | -0.005 | -0.009 |
| 0.36 | 0.057 | 0.047 | 0.038 | 0.03 | 0.023 | 0.016 | 0.01 | 0.005 | 0 | -0.005 | -0.009 |
| 0.3605 | 0.057 | 0.047 | 0.038 | 0.03 | 0.023 | 0.016 | 0.01 | 0.005 | 0 | -0.005 | -0.009 |
| 0.361 | 0.057 | 0.047 | 0.038 | 0.03 | 0.023 | 0.016 | 0.01 | 0.005 | 0 | -0.005 | -0.009 |
| 0.3615 | 0.057 | 0.047 | 0.038 | 0.03 | 0.023 | 0.016 | 0.01 | 0.005 | 0 | -0.005 | -0.009 |
| 0.362 | 0.057 | 0.047 | 0.038 | 0.03 | 0.023 | 0.016 | 0.01 | 0.005 | 0 | -0.005 | -0.009 |
| 0.3625 | 0.057 | 0.047 | 0.038 | 0.03 | 0.023 | 0.016 | 0.01 | 0.005 | 0 | -0.005 | -0.009 |
| 0.363 | 0.057 | 0.047 | 0.038 | 0.03 | 0.023 | 0.016 | 0.01 | 0.005 | 0 | -0.005 | -0.009 |
| 0.3635 | 0.057 | 0.047 | 0.038 | 0.03 | 0.023 | 0.016 | 0.01 | 0.004 | -0.001 | -0.005 | -0.009 |
| 0.364 | 0.057 | 0.047 | 0.038 | 0.03 | 0.023 | 0.016 | 0.01 | 0.004 | -0.001 | -0.005 | -0.009 |
| 0.3645 | 0.057 | 0.047 | 0.038 | 0.03 | 0.023 | 0.016 | 0.01 | 0.004 | -0.001 | -0.005 | -0.01 |
| 0.365 | 0.057 | 0.047 | 0.038 | 0.03 | 0.023 | 0.016 | 0.01 | 0.004 | -0.001 | -0.005 | -0.01 |
| 0.3655 | 0.057 | 0.047 | 0.038 | 0.03 | 0.023 | 0.016 | 0.01 | 0.004 | -0.001 | -0.005 | -0.01 |
| 0.366 | 0.057 | 0.047 | 0.038 | 0.03 | 0.023 | 0.016 | 0.01 | 0.004 | -0.001 | -0.005 | -0.01 |
| 0.3665 | 0.057 | 0.047 | 0.038 | 0.03 | 0.023 | 0.016 | 0.01 | 0.004 | -0.001 | -0.006 | -0.01 |
| 0.367 | 0.057 | 0.047 | 0.038 | 0.03 | 0.023 | 0.016 | 0.01 | 0.004 | -0.001 | -0.006 | -0.01 |
| 0.3675 | 0.057 | 0.047 | 0.038 | 0.03 | 0.023 | 0.016 | 0.01 | 0.004 | -0.001 | -0.006 | -0.01 |
| 0.368 | 0.057 | 0.047 | 0.038 | 0.03 | 0.023 | 0.016 | 0.01 | 0.004 | -0.001 | -0.006 | -0.01 |
| 0.3685 | 0.057 | 0.047 | 0.038 | 0.03 | 0.023 | 0.016 | 0.01 | 0.004 | -0.001 | -0.006 | -0.01 |
| 0.369 | 0.057 | 0.047 | 0.038 | 0.03 | 0.022 | 0.016 | 0.01 | 0.004 | -0.001 | -0.006 | -0.01 |
| 0.3695 | 0.057 | 0.047 | 0.038 | 0.03 | 0.022 | 0.016 | 0.01 | 0.004 | -0.001 | -0.006 | -0.01 |
| 0.37 | 0.058 | 0.047 | 0.038 | 0.03 | 0.022 | 0.016 | 0.01 | 0.004 | -0.001 | -0.006 | -0.01 |
| 0.3705 | 0.058 | 0.047 | 0.038 | 0.03 | 0.022 | 0.016 | 0.01 | 0.004 | -0.001 | -0.006 | -0.01 |
| 0.371 | 0.058 | 0.047 | 0.038 | 0.03 | 0.022 | 0.016 | 0.009 | 0.004 | -0.001 | -0.006 | -0.01 |
| 0.3715 | 0.058 | 0.047 | 0.038 | 0.03 | 0.022 | 0.016 | 0.009 | 0.004 | -0.001 | -0.006 | -0.01 |
| 0.372 | 0.058 | 0.047 | 0.038 | 0.03 | 0.022 | 0.016 | 0.009 | 0.004 | -0.001 | -0.006 | -0.01 |
| 0.3725 | 0.058 | 0.047 | 0.038 | 0.03 | 0.022 | 0.016 | 0.009 | 0.004 | -0.001 | -0.006 | -0.011 |
| 0.373 | 0.058 | 0.047 | 0.038 | 0.03 | 0.022 | 0.016 | 0.009 | 0.004 | -0.001 | -0.006 | -0.011 |
| 0.3735 | 0.058 | 0.047 | 0.038 | 0.03 | 0.022 | 0.016 | 0.009 | 0.004 | -0.002 | -0.006 | -0.011 |
| 0.374 | 0.058 | 0.047 | 0.038 | 0.03 | 0.022 | 0.015 | 0.009 | 0.004 | -0.002 | -0.006 | -0.011 |
| 0.3745 | 0.058 | 0.047 | 0.038 | 0.03 | 0.022 | 0.015 | 0.009 | 0.004 | -0.002 | -0.006 | -0.011 |
| 0.375 | 0.058 | 0.047 | 0.038 | 0.03 | 0.022 | 0.015 | 0.009 | 0.004 | -0.002 | -0.006 | -0.011 |
| 0.3755 | 0.058 | 0.047 | 0.038 | 0.03 | 0.022 | 0.015 | 0.009 | 0.003 | -0.002 | -0.006 | -0.011 |
| 0.376 | 0.058 | 0.048 | 0.038 | 0.03 | 0.022 | 0.015 | 0.009 | 0.003 | -0.002 | -0.007 | -0.011 |
| 0.3765 | 0.058 | 0.048 | 0.038 | 0.03 | 0.022 | 0.015 | 0.009 | 0.003 | -0.002 | -0.007 | -0.011 |
| 0.377 | 0.058 | 0.048 | 0.038 | 0.03 | 0.022 | 0.015 | 0.009 | 0.003 | -0.002 | -0.007 | -0.011 |
| 0.3775 | 0.058 | 0.048 | 0.038 | 0.03 | 0.022 | 0.015 | 0.009 | 0.003 | -0.002 | -0.007 | -0.011 |
| 0.378 | 0.058 | 0.048 | 0.038 | 0.03 | 0.022 | 0.015 | 0.009 | 0.003 | -0.002 | -0.007 | -0.011 |
| 0.3785 | 0.058 | 0.048 | 0.038 | 0.03 | 0.022 | 0.015 | 0.009 | 0.003 | -0.002 | -0.007 | -0.011 |
| 0.379 | 0.058 | 0.048 | 0.038 | 0.03 | 0.022 | 0.015 | 0.009 | 0.003 | -0.002 | -0.007 | -0.011 |
| 0.3795 | 0.058 | 0.048 | 0.038 | 0.03 | 0.022 | 0.015 | 0.009 | 0.003 | -0.002 | -0.007 | -0.011 |
| 0.38 | 0.058 | 0.048 | 0.038 | 0.03 | 0.022 | 0.015 | 0.009 | 0.003 | -0.002 | -0.007 | -0.011 |
| 0.3805 | 0.058 | 0.048 | 0.038 | 0.03 | 0.022 | 0.015 | 0.009 | 0.003 | -0.002 | -0.007 | -0.011 |
| 0.381 | 0.058 | 0.048 | 0.038 | 0.03 | 0.022 | 0.015 | 0.009 | 0.003 | -0.002 | -0.007 | -0.012 |
| 0.3815 | 0.058 | 0.048 | 0.038 | 0.03 | 0.022 | 0.015 | 0.009 | 0.003 | -0.002 | -0.007 | -0.012 |
| 0.382 | 0.058 | 0.048 | 0.038 | 0.03 | 0.022 | 0.015 | 0.009 | 0.003 | -0.002 | -0.007 | -0.012 |
| 0.3825 | 0.058 | 0.048 | 0.038 | 0.03 | 0.022 | 0.015 | 0.009 | 0.003 | -0.002 | -0.007 | -0.012 |
| 0.383 | 0.058 | 0.048 | 0.038 | 0.03 | 0.022 | 0.015 | 0.009 | 0.003 | -0.002 | -0.007 | -0.012 |
| 0.3835 | 0.058 | 0.048 | 0.038 | 0.03 | 0.022 | 0.015 | 0.009 | 0.003 | -0.002 | -0.007 | -0.012 |
| 0.384 | 0.058 | 0.048 | 0.038 | 0.03 | 0.022 | 0.015 | 0.009 | 0.003 | -0.003 | -0.007 | -0.012 |
| 0.3845 | 0.058 | 0.048 | 0.038 | 0.03 | 0.022 | 0.015 | 0.009 | 0.003 | -0.003 | -0.007 | -0.012 |
| 0.385 | 0.058 | 0.048 | 0.038 | 0.03 | 0.022 | 0.015 | 0.009 | 0.003 | -0.003 | -0.008 | -0.012 |
| 0.3855 | 0.058 | 0.048 | 0.038 | 0.03 | 0.022 | 0.015 | 0.009 | 0.003 | -0.003 | -0.008 | -0.012 |
| 0.386 | 0.059 | 0.048 | 0.038 | 0.03 | 0.022 | 0.015 | 0.008 | 0.003 | -0.003 | -0.008 | -0.012 |
| 0.3865 | 0.059 | 0.048 | 0.038 | 0.03 | 0.022 | 0.015 | 0.008 | 0.003 | -0.003 | -0.008 | -0.012 |
| 0.387 | 0.059 | 0.048 | 0.038 | 0.03 | 0.022 | 0.015 | 0.008 | 0.003 | -0.003 | -0.008 | -0.012 |
| 0.3875 | 0.059 | 0.048 | 0.038 | 0.03 | 0.022 | 0.015 | 0.008 | 0.003 | -0.003 | -0.008 | -0.012 |
| 0.388 | 0.059 | 0.048 | 0.038 | 0.03 | 0.022 | 0.015 | 0.008 | 0.002 | -0.003 | -0.008 | -0.012 |
| 0.3885 | 0.059 | 0.048 | 0.038 | 0.03 | 0.022 | 0.015 | 0.008 | 0.002 | -0.003 | -0.008 | -0.012 |
| 0.389 | 0.059 | 0.048 | 0.038 | 0.03 | 0.022 | 0.015 | 0.008 | 0.002 | -0.003 | -0.008 | -0.012 |
| 0.3895 | 0.059 | 0.048 | 0.038 | 0.03 | 0.022 | 0.015 | 0.008 | 0.002 | -0.003 | -0.008 | -0.013 |
| 0.39 | 0.059 | 0.048 | 0.038 | 0.03 | 0.022 | 0.015 | 0.008 | 0.002 | -0.003 | -0.008 | -0.013 |
| 0.3905 | 0.059 | 0.048 | 0.038 | 0.03 | 0.022 | 0.015 | 0.008 | 0.002 | -0.003 | -0.008 | -0.013 |
| 0.391 | 0.059 | 0.048 | 0.038 | 0.03 | 0.022 | 0.015 | 0.008 | 0.002 | -0.003 | -0.008 | -0.013 |
| 0.3915 | 0.059 | 0.048 | 0.038 | 0.03 | 0.022 | 0.015 | 0.008 | 0.002 | -0.003 | -0.008 | -0.013 |
| 0.392 | 0.059 | 0.048 | 0.038 | 0.03 | 0.022 | 0.015 | 0.008 | 0.002 | -0.003 | -0.008 | -0.013 |
| 0.3925 | 0.059 | 0.048 | 0.038 | 0.03 | 0.022 | 0.015 | 0.008 | 0.002 | -0.003 | -0.008 | -0.013 |
| 0.393 | 0.059 | 0.048 | 0.038 | 0.03 | 0.022 | 0.015 | 0.008 | 0.002 | -0.003 | -0.008 | -0.013 |
| 0.3935 | 0.059 | 0.048 | 0.038 | 0.03 | 0.022 | 0.015 | 0.008 | 0.002 | -0.003 | -0.008 | -0.013 |
| 0.394 | 0.059 | 0.048 | 0.038 | 0.03 | 0.022 | 0.015 | 0.008 | 0.002 | -0.003 | -0.008 | -0.013 |
| 0.3945 | 0.059 | 0.048 | 0.038 | 0.03 | 0.022 | 0.014 | 0.008 | 0.002 | -0.004 | -0.009 | -0.013 |
| 0.395 | 0.059 | 0.048 | 0.038 | 0.03 | 0.022 | 0.014 | 0.008 | 0.002 | -0.004 | -0.009 | -0.013 |
| 0.3955 | 0.059 | 0.048 | 0.038 | 0.03 | 0.022 | 0.014 | 0.008 | 0.002 | -0.004 | -0.009 | -0.013 |
| 0.396 | 0.059 | 0.048 | 0.038 | 0.03 | 0.022 | 0.014 | 0.008 | 0.002 | -0.004 | -0.009 | -0.013 |
| 0.3965 | 0.059 | 0.048 | 0.038 | 0.03 | 0.022 | 0.014 | 0.008 | 0.002 | -0.004 | -0.009 | -0.013 |
| 0.397 | 0.059 | 0.048 | 0.038 | 0.03 | 0.022 | 0.014 | 0.008 | 0.002 | -0.004 | -0.009 | -0.013 |
| 0.3975 | 0.059 | 0.048 | 0.038 | 0.03 | 0.022 | 0.014 | 0.008 | 0.002 | -0.004 | -0.009 | -0.013 |
| 0.398 | 0.059 | 0.048 | 0.038 | 0.03 | 0.022 | 0.014 | 0.008 | 0.002 | -0.004 | -0.009 | -0.014 |
| 0.3985 | 0.059 | 0.048 | 0.039 | 0.03 | 0.022 | 0.014 | 0.008 | 0.002 | -0.004 | -0.009 | -0.014 |
| 0.399 | 0.059 | 0.048 | 0.039 | 0.03 | 0.022 | 0.014 | 0.008 | 0.002 | -0.004 | -0.009 | -0.014 |
| 0.3995 | 0.059 | 0.048 | 0.039 | 0.03 | 0.022 | 0.014 | 0.008 | 0.002 | -0.004 | -0.009 | -0.014 |
| 0.4 | 0.059 | 0.048 | 0.039 | 0.03 | 0.022 | 0.014 | 0.008 | 0.002 | -0.004 | -0.009 | -0.014 |
| 0.4005 | 0.06 | 0.048 | 0.039 | 0.03 | 0.022 | 0.014 | 0.008 | 0.002 | -0.004 | -0.009 | -0.014 |
| 0.401 | 0.06 | 0.048 | 0.039 | 0.03 | 0.022 | 0.014 | 0.008 | 0.001 | -0.004 | -0.009 | -0.014 |
| 0.4015 | 0.06 | 0.048 | 0.039 | 0.03 | 0.022 | 0.014 | 0.008 | 0.001 | -0.004 | -0.009 | -0.014 |
| 0.402 | 0.06 | 0.049 | 0.039 | 0.03 | 0.022 | 0.014 | 0.007 | 0.001 | -0.004 | -0.009 | -0.014 |
| 0.4025 | 0.06 | 0.049 | 0.039 | 0.03 | 0.021 | 0.014 | 0.007 | 0.001 | -0.004 | -0.009 | -0.014 |
| 0.403 | 0.06 | 0.049 | 0.039 | 0.03 | 0.021 | 0.014 | 0.007 | 0.001 | -0.004 | -0.009 | -0.014 |
| 0.4035 | 0.06 | 0.049 | 0.039 | 0.03 | 0.021 | 0.014 | 0.007 | 0.001 | -0.004 | -0.009 | -0.014 |
| 0.404 | 0.06 | 0.049 | 0.039 | 0.03 | 0.021 | 0.014 | 0.007 | 0.001 | -0.004 | -0.009 | -0.014 |
| 0.4045 | 0.06 | 0.049 | 0.039 | 0.03 | 0.021 | 0.014 | 0.007 | 0.001 | -0.004 | -0.01 | -0.014 |
| 0.405 | 0.06 | 0.049 | 0.039 | 0.03 | 0.021 | 0.014 | 0.007 | 0.001 | -0.004 | -0.01 | -0.014 |
| 0.4055 | 0.06 | 0.049 | 0.039 | 0.03 | 0.021 | 0.014 | 0.007 | 0.001 | -0.004 | -0.01 | -0.014 |
| 0.406 | 0.06 | 0.049 | 0.039 | 0.03 | 0.021 | 0.014 | 0.007 | 0.001 | -0.005 | -0.01 | -0.014 |
| 0.4065 | 0.06 | 0.049 | 0.039 | 0.03 | 0.021 | 0.014 | 0.007 | 0.001 | -0.005 | -0.01 | -0.014 |
| 0.407 | 0.06 | 0.049 | 0.039 | 0.03 | 0.021 | 0.014 | 0.007 | 0.001 | -0.005 | -0.01 | -0.015 |
| 0.4075 | 0.06 | 0.049 | 0.039 | 0.03 | 0.021 | 0.014 | 0.007 | 0.001 | -0.005 | -0.01 | -0.015 |
| 0.408 | 0.06 | 0.049 | 0.039 | 0.03 | 0.021 | 0.014 | 0.007 | 0.001 | -0.005 | -0.01 | -0.015 |
| 0.4085 | 0.06 | 0.049 | 0.039 | 0.03 | 0.021 | 0.014 | 0.007 | 0.001 | -0.005 | -0.01 | -0.015 |
| 0.409 | 0.06 | 0.049 | 0.039 | 0.03 | 0.021 | 0.014 | 0.007 | 0.001 | -0.005 | -0.01 | -0.015 |
| 0.4095 | 0.06 | 0.049 | 0.039 | 0.03 | 0.021 | 0.014 | 0.007 | 0.001 | -0.005 | -0.01 | -0.015 |
| 0.41 | 0.06 | 0.049 | 0.039 | 0.03 | 0.021 | 0.014 | 0.007 | 0.001 | -0.005 | -0.01 | -0.015 |
| 0.4105 | 0.06 | 0.049 | 0.039 | 0.03 | 0.021 | 0.014 | 0.007 | 0.001 | -0.005 | -0.01 | -0.015 |
| 0.411 | 0.06 | 0.049 | 0.039 | 0.03 | 0.021 | 0.014 | 0.007 | 0.001 | -0.005 | -0.01 | -0.015 |
| 0.4115 | 0.06 | 0.049 | 0.039 | 0.03 | 0.021 | 0.014 | 0.007 | 0.001 | -0.005 | -0.01 | -0.015 |
| 0.412 | 0.06 | 0.049 | 0.039 | 0.03 | 0.021 | 0.014 | 0.007 | 0.001 | -0.005 | -0.01 | -0.015 |
| 0.4125 | 0.06 | 0.049 | 0.039 | 0.03 | 0.021 | 0.014 | 0.007 | 0.001 | -0.005 | -0.01 | -0.015 |
| 0.413 | 0.06 | 0.049 | 0.039 | 0.03 | 0.021 | 0.014 | 0.007 | 0.001 | -0.005 | -0.01 | -0.015 |
| 0.4135 | 0.06 | 0.049 | 0.039 | 0.03 | 0.021 | 0.014 | 0.007 | 0.001 | -0.005 | -0.01 | -0.015 |
| 0.414 | 0.06 | 0.049 | 0.039 | 0.03 | 0.021 | 0.014 | 0.007 | 0.001 | -0.005 | -0.01 | -0.015 |
| 0.4145 | 0.061 | 0.049 | 0.039 | 0.03 | 0.021 | 0.014 | 0.007 | 0 | -0.005 | -0.011 | -0.015 |
| 0.415 | 0.061 | 0.049 | 0.039 | 0.03 | 0.021 | 0.014 | 0.007 | 0 | -0.005 | -0.011 | -0.015 |
| 0.4155 | 0.061 | 0.049 | 0.039 | 0.03 | 0.021 | 0.014 | 0.007 | 0 | -0.005 | -0.011 | -0.015 |
| 0.416 | 0.061 | 0.049 | 0.039 | 0.03 | 0.021 | 0.014 | 0.007 | 0 | -0.005 | -0.011 | -0.016 |
| 0.4165 | 0.061 | 0.049 | 0.039 | 0.03 | 0.021 | 0.014 | 0.007 | 0 | -0.005 | -0.011 | -0.016 |
| 0.417 | 0.061 | 0.049 | 0.039 | 0.03 | 0.021 | 0.014 | 0.007 | 0 | -0.005 | -0.011 | -0.016 |
| 0.4175 | 0.061 | 0.049 | 0.039 | 0.03 | 0.021 | 0.014 | 0.007 | 0 | -0.005 | -0.011 | -0.016 |
| 0.418 | 0.061 | 0.049 | 0.039 | 0.03 | 0.021 | 0.014 | 0.007 | 0 | -0.006 | -0.011 | -0.016 |
| 0.4185 | 0.061 | 0.049 | 0.039 | 0.03 | 0.021 | 0.014 | 0.007 | 0 | -0.006 | -0.011 | -0.016 |
| 0.419 | 0.061 | 0.049 | 0.039 | 0.03 | 0.021 | 0.014 | 0.007 | 0 | -0.006 | -0.011 | -0.016 |
| 0.4195 | 0.061 | 0.049 | 0.039 | 0.03 | 0.021 | 0.013 | 0.007 | 0 | -0.006 | -0.011 | -0.016 |
| 0.42 | 0.061 | 0.049 | 0.039 | 0.03 | 0.021 | 0.013 | 0.006 | 0 | -0.006 | -0.011 | -0.016 |
| 0.4205 | 0.061 | 0.049 | 0.039 | 0.03 | 0.021 | 0.013 | 0.006 | 0 | -0.006 | -0.011 | -0.016 |
| 0.421 | 0.061 | 0.049 | 0.039 | 0.03 | 0.021 | 0.013 | 0.006 | 0 | -0.006 | -0.011 | -0.016 |
| 0.4215 | 0.061 | 0.049 | 0.039 | 0.03 | 0.021 | 0.013 | 0.006 | 0 | -0.006 | -0.011 | -0.016 |
| 0.422 | 0.061 | 0.049 | 0.039 | 0.03 | 0.021 | 0.013 | 0.006 | 0 | -0.006 | -0.011 | -0.016 |
| 0.4225 | 0.061 | 0.05 | 0.039 | 0.03 | 0.021 | 0.013 | 0.006 | 0 | -0.006 | -0.011 | -0.016 |
| 0.423 | 0.061 | 0.05 | 0.039 | 0.03 | 0.021 | 0.013 | 0.006 | 0 | -0.006 | -0.011 | -0.016 |
| 0.4235 | 0.061 | 0.05 | 0.039 | 0.03 | 0.021 | 0.013 | 0.006 | 0 | -0.006 | -0.011 | -0.016 |
| 0.424 | 0.061 | 0.05 | 0.039 | 0.03 | 0.021 | 0.013 | 0.006 | 0 | -0.006 | -0.011 | -0.016 |
| 0.4245 | 0.061 | 0.05 | 0.039 | 0.03 | 0.021 | 0.013 | 0.006 | 0 | -0.006 | -0.011 | -0.016 |
| 0.425 | 0.061 | 0.05 | 0.039 | 0.03 | 0.021 | 0.013 | 0.006 | 0 | -0.006 | -0.011 | -0.016 |
| 0.4255 | 0.061 | 0.05 | 0.039 | 0.03 | 0.021 | 0.013 | 0.006 | 0 | -0.006 | -0.012 | -0.017 |
| 0.426 | 0.061 | 0.05 | 0.039 | 0.03 | 0.021 | 0.013 | 0.006 | 0 | -0.006 | -0.012 | -0.017 |
| 0.4265 | 0.061 | 0.05 | 0.039 | 0.03 | 0.021 | 0.013 | 0.006 | 0 | -0.006 | -0.012 | -0.017 |
| 0.427 | 0.062 | 0.05 | 0.039 | 0.03 | 0.021 | 0.013 | 0.006 | 0 | -0.006 | -0.012 | -0.017 |
| 0.4275 | 0.062 | 0.05 | 0.039 | 0.03 | 0.021 | 0.013 | 0.006 | 0 | -0.006 | -0.012 | -0.017 |
| 0.428 | 0.062 | 0.05 | 0.039 | 0.03 | 0.021 | 0.013 | 0.006 | 0 | -0.006 | -0.012 | -0.017 |
| 0.4285 | 0.062 | 0.05 | 0.039 | 0.03 | 0.021 | 0.013 | 0.006 | 0 | -0.006 | -0.012 | -0.017 |
| 0.429 | 0.062 | 0.05 | 0.039 | 0.03 | 0.021 | 0.013 | 0.006 | 0 | -0.006 | -0.012 | -0.017 |
| 0.4295 | 0.062 | 0.05 | 0.039 | 0.03 | 0.021 | 0.013 | 0.006 | 0 | -0.006 | -0.012 | -0.017 |
| 0.43 | 0.062 | 0.05 | 0.039 | 0.03 | 0.021 | 0.013 | 0.006 | -0.001 | -0.006 | -0.012 | -0.017 |
| 0.4305 | 0.062 | 0.05 | 0.039 | 0.03 | 0.021 | 0.013 | 0.006 | -0.001 | -0.007 | -0.012 | -0.017 |
| 0.431 | 0.062 | 0.05 | 0.039 | 0.03 | 0.021 | 0.013 | 0.006 | -0.001 | -0.007 | -0.012 | -0.017 |
| 0.4315 | 0.062 | 0.05 | 0.039 | 0.03 | 0.021 | 0.013 | 0.006 | -0.001 | -0.007 | -0.012 | -0.017 |
| 0.432 | 0.062 | 0.05 | 0.039 | 0.03 | 0.021 | 0.013 | 0.006 | -0.001 | -0.007 | -0.012 | -0.017 |
| 0.4325 | 0.062 | 0.05 | 0.039 | 0.03 | 0.021 | 0.013 | 0.006 | -0.001 | -0.007 | -0.012 | -0.017 |
| 0.433 | 0.062 | 0.05 | 0.039 | 0.03 | 0.021 | 0.013 | 0.006 | -0.001 | -0.007 | -0.012 | -0.017 |
| 0.4335 | 0.062 | 0.05 | 0.039 | 0.03 | 0.021 | 0.013 | 0.006 | -0.001 | -0.007 | -0.012 | -0.017 |
| 0.434 | 0.062 | 0.05 | 0.039 | 0.03 | 0.021 | 0.013 | 0.006 | -0.001 | -0.007 | -0.012 | -0.017 |
| 0.4345 | 0.062 | 0.05 | 0.039 | 0.03 | 0.021 | 0.013 | 0.006 | -0.001 | -0.007 | -0.012 | -0.017 |
| 0.435 | 0.062 | 0.05 | 0.039 | 0.03 | 0.021 | 0.013 | 0.006 | -0.001 | -0.007 | -0.012 | -0.017 |
| 0.4355 | 0.062 | 0.05 | 0.039 | 0.03 | 0.021 | 0.013 | 0.006 | -0.001 | -0.007 | -0.012 | -0.017 |
| 0.436 | 0.062 | 0.05 | 0.039 | 0.03 | 0.021 | 0.013 | 0.006 | -0.001 | -0.007 | -0.012 | -0.018 |
| 0.4365 | 0.062 | 0.05 | 0.04 | 0.03 | 0.021 | 0.013 | 0.006 | -0.001 | -0.007 | -0.012 | -0.018 |
| 0.437 | 0.062 | 0.05 | 0.04 | 0.03 | 0.021 | 0.013 | 0.006 | -0.001 | -0.007 | -0.013 | -0.018 |
| 0.4375 | 0.062 | 0.05 | 0.04 | 0.03 | 0.021 | 0.013 | 0.006 | -0.001 | -0.007 | -0.013 | -0.018 |
| 0.438 | 0.062 | 0.05 | 0.04 | 0.03 | 0.021 | 0.013 | 0.006 | -0.001 | -0.007 | -0.013 | -0.018 |
| 0.4385 | 0.063 | 0.05 | 0.04 | 0.03 | 0.021 | 0.013 | 0.006 | -0.001 | -0.007 | -0.013 | -0.018 |
| 0.439 | 0.063 | 0.05 | 0.04 | 0.03 | 0.021 | 0.013 | 0.006 | -0.001 | -0.007 | -0.013 | -0.018 |
| 0.4395 | 0.063 | 0.051 | 0.04 | 0.03 | 0.021 | 0.013 | 0.006 | -0.001 | -0.007 | -0.013 | -0.018 |
| 0.44 | 0.063 | 0.051 | 0.04 | 0.03 | 0.021 | 0.013 | 0.006 | -0.001 | -0.007 | -0.013 | -0.018 |
| 0.4405 | 0.063 | 0.051 | 0.04 | 0.03 | 0.021 | 0.013 | 0.006 | -0.001 | -0.007 | -0.013 | -0.018 |
| 0.441 | 0.063 | 0.051 | 0.04 | 0.03 | 0.021 | 0.013 | 0.006 | -0.001 | -0.007 | -0.013 | -0.018 |
| 0.4415 | 0.063 | 0.051 | 0.04 | 0.03 | 0.021 | 0.013 | 0.006 | -0.001 | -0.007 | -0.013 | -0.018 |
| 0.442 | 0.063 | 0.051 | 0.04 | 0.03 | 0.021 | 0.013 | 0.006 | -0.001 | -0.007 | -0.013 | -0.018 |
| 0.4425 | 0.063 | 0.051 | 0.04 | 0.03 | 0.021 | 0.013 | 0.006 | -0.001 | -0.007 | -0.013 | -0.018 |
| 0.443 | 0.063 | 0.051 | 0.04 | 0.03 | 0.021 | 0.013 | 0.005 | -0.001 | -0.007 | -0.013 | -0.018 |
| 0.4435 | 0.063 | 0.051 | 0.04 | 0.03 | 0.021 | 0.013 | 0.005 | -0.001 | -0.007 | -0.013 | -0.018 |
| 0.444 | 0.063 | 0.051 | 0.04 | 0.03 | 0.021 | 0.013 | 0.005 | -0.001 | -0.007 | -0.013 | -0.018 |
| 0.4445 | 0.063 | 0.051 | 0.04 | 0.03 | 0.021 | 0.013 | 0.005 | -0.001 | -0.007 | -0.013 | -0.018 |
| 0.445 | 0.063 | 0.051 | 0.04 | 0.03 | 0.021 | 0.013 | 0.005 | -0.001 | -0.008 | -0.013 | -0.018 |
| 0.4455 | 0.063 | 0.051 | 0.04 | 0.03 | 0.021 | 0.013 | 0.005 | -0.001 | -0.008 | -0.013 | -0.018 |
| 0.446 | 0.063 | 0.051 | 0.04 | 0.03 | 0.021 | 0.013 | 0.005 | -0.001 | -0.008 | -0.013 | -0.018 |
| 0.4465 | 0.063 | 0.051 | 0.04 | 0.03 | 0.021 | 0.013 | 0.005 | -0.001 | -0.008 | -0.013 | -0.019 |
| 0.447 | 0.063 | 0.051 | 0.04 | 0.03 | 0.021 | 0.013 | 0.005 | -0.001 | -0.008 | -0.013 | -0.019 |
| 0.4475 | 0.063 | 0.051 | 0.04 | 0.03 | 0.021 | 0.013 | 0.005 | -0.001 | -0.008 | -0.013 | -0.019 |
| 0.448 | 0.063 | 0.051 | 0.04 | 0.03 | 0.021 | 0.013 | 0.005 | -0.001 | -0.008 | -0.013 | -0.019 |
| 0.4485 | 0.063 | 0.051 | 0.04 | 0.03 | 0.021 | 0.013 | 0.005 | -0.002 | -0.008 | -0.013 | -0.019 |
| 0.449 | 0.064 | 0.051 | 0.04 | 0.03 | 0.021 | 0.013 | 0.005 | -0.002 | -0.008 | -0.013 | -0.019 |
| 0.4495 | 0.064 | 0.051 | 0.04 | 0.03 | 0.021 | 0.013 | 0.005 | -0.002 | -0.008 | -0.014 | -0.019 |
| 0.45 | 0.064 | 0.051 | 0.04 | 0.03 | 0.021 | 0.013 | 0.005 | -0.002 | -0.008 | -0.014 | -0.019 |
| 0.4505 | 0.064 | 0.051 | 0.04 | 0.03 | 0.021 | 0.013 | 0.005 | -0.002 | -0.008 | -0.014 | -0.019 |
| 0.451 | 0.064 | 0.051 | 0.04 | 0.03 | 0.021 | 0.013 | 0.005 | -0.002 | -0.008 | -0.014 | -0.019 |
| 0.4515 | 0.064 | 0.051 | 0.04 | 0.03 | 0.021 | 0.013 | 0.005 | -0.002 | -0.008 | -0.014 | -0.019 |
| 0.452 | 0.064 | 0.051 | 0.04 | 0.03 | 0.021 | 0.013 | 0.005 | -0.002 | -0.008 | -0.014 | -0.019 |
| 0.4525 | 0.064 | 0.051 | 0.04 | 0.03 | 0.021 | 0.013 | 0.005 | -0.002 | -0.008 | -0.014 | -0.019 |
| 0.453 | 0.064 | 0.051 | 0.04 | 0.03 | 0.021 | 0.013 | 0.005 | -0.002 | -0.008 | -0.014 | -0.019 |
| 0.4535 | 0.064 | 0.051 | 0.04 | 0.03 | 0.021 | 0.013 | 0.005 | -0.002 | -0.008 | -0.014 | -0.019 |
| 0.454 | 0.064 | 0.051 | 0.04 | 0.03 | 0.021 | 0.013 | 0.005 | -0.002 | -0.008 | -0.014 | -0.019 |
| 0.4545 | 0.064 | 0.052 | 0.04 | 0.03 | 0.021 | 0.013 | 0.005 | -0.002 | -0.008 | -0.014 | -0.019 |
| 0.455 | 0.064 | 0.052 | 0.04 | 0.03 | 0.021 | 0.013 | 0.005 | -0.002 | -0.008 | -0.014 | -0.019 |
| 0.4555 | 0.064 | 0.052 | 0.04 | 0.03 | 0.021 | 0.013 | 0.005 | -0.002 | -0.008 | -0.014 | -0.019 |
| 0.456 | 0.064 | 0.052 | 0.04 | 0.03 | 0.021 | 0.013 | 0.005 | -0.002 | -0.008 | -0.014 | -0.019 |
| 0.4565 | 0.064 | 0.052 | 0.04 | 0.03 | 0.021 | 0.013 | 0.005 | -0.002 | -0.008 | -0.014 | -0.019 |
| 0.457 | 0.064 | 0.052 | 0.04 | 0.03 | 0.021 | 0.013 | 0.005 | -0.002 | -0.008 | -0.014 | -0.019 |
| 0.4575 | 0.064 | 0.052 | 0.04 | 0.03 | 0.021 | 0.013 | 0.005 | -0.002 | -0.008 | -0.014 | -0.019 |
| 0.458 | 0.064 | 0.052 | 0.04 | 0.03 | 0.021 | 0.013 | 0.005 | -0.002 | -0.008 | -0.014 | -0.019 |
| 0.4585 | 0.064 | 0.052 | 0.04 | 0.03 | 0.021 | 0.013 | 0.005 | -0.002 | -0.008 | -0.014 | -0.02 |
| 0.459 | 0.065 | 0.052 | 0.04 | 0.03 | 0.021 | 0.013 | 0.005 | -0.002 | -0.008 | -0.014 | -0.02 |
| 0.4595 | 0.065 | 0.052 | 0.041 | 0.03 | 0.021 | 0.013 | 0.005 | -0.002 | -0.008 | -0.014 | -0.02 |
| 0.46 | 0.065 | 0.052 | 0.041 | 0.03 | 0.021 | 0.013 | 0.005 | -0.002 | -0.008 | -0.014 | -0.02 |
| 0.4605 | 0.065 | 0.052 | 0.041 | 0.03 | 0.021 | 0.013 | 0.005 | -0.002 | -0.008 | -0.014 | -0.02 |
| 0.461 | 0.065 | 0.052 | 0.041 | 0.03 | 0.021 | 0.013 | 0.005 | -0.002 | -0.008 | -0.014 | -0.02 |
| 0.4615 | 0.065 | 0.052 | 0.041 | 0.03 | 0.021 | 0.013 | 0.005 | -0.002 | -0.008 | -0.014 | -0.02 |
| 0.462 | 0.065 | 0.052 | 0.041 | 0.03 | 0.021 | 0.013 | 0.005 | -0.002 | -0.009 | -0.014 | -0.02 |
| 0.4625 | 0.065 | 0.052 | 0.041 | 0.03 | 0.021 | 0.013 | 0.005 | -0.002 | -0.009 | -0.014 | -0.02 |
| 0.463 | 0.065 | 0.052 | 0.041 | 0.03 | 0.021 | 0.013 | 0.005 | -0.002 | -0.009 | -0.014 | -0.02 |
| 0.4635 | 0.065 | 0.052 | 0.041 | 0.03 | 0.021 | 0.013 | 0.005 | -0.002 | -0.009 | -0.014 | -0.02 |
| 0.464 | 0.065 | 0.052 | 0.041 | 0.03 | 0.021 | 0.013 | 0.005 | -0.002 | -0.009 | -0.015 | -0.02 |
| 0.4645 | 0.065 | 0.052 | 0.041 | 0.03 | 0.021 | 0.013 | 0.005 | -0.002 | -0.009 | -0.015 | -0.02 |
| 0.465 | 0.065 | 0.052 | 0.041 | 0.03 | 0.021 | 0.013 | 0.005 | -0.002 | -0.009 | -0.015 | -0.02 |
| 0.4655 | 0.065 | 0.052 | 0.041 | 0.03 | 0.021 | 0.013 | 0.005 | -0.002 | -0.009 | -0.015 | -0.02 |
| 0.466 | 0.065 | 0.052 | 0.041 | 0.03 | 0.021 | 0.013 | 0.005 | -0.002 | -0.009 | -0.015 | -0.02 |
| 0.4665 | 0.065 | 0.052 | 0.041 | 0.031 | 0.021 | 0.013 | 0.005 | -0.002 | -0.009 | -0.015 | -0.02 |
| 0.467 | 0.065 | 0.053 | 0.041 | 0.031 | 0.021 | 0.013 | 0.005 | -0.002 | -0.009 | -0.015 | -0.02 |
| 0.4675 | 0.065 | 0.053 | 0.041 | 0.031 | 0.021 | 0.013 | 0.005 | -0.002 | -0.009 | -0.015 | -0.02 |
| 0.468 | 0.066 | 0.053 | 0.041 | 0.031 | 0.021 | 0.013 | 0.005 | -0.002 | -0.009 | -0.015 | -0.02 |
| 0.4685 | 0.066 | 0.053 | 0.041 | 0.031 | 0.021 | 0.013 | 0.005 | -0.002 | -0.009 | -0.015 | -0.02 |
| 0.469 | 0.066 | 0.053 | 0.041 | 0.031 | 0.021 | 0.013 | 0.005 | -0.002 | -0.009 | -0.015 | -0.02 |
| 0.4695 | 0.066 | 0.053 | 0.041 | 0.031 | 0.021 | 0.013 | 0.005 | -0.002 | -0.009 | -0.015 | -0.02 |
| 0.47 | 0.066 | 0.053 | 0.041 | 0.031 | 0.021 | 0.013 | 0.005 | -0.002 | -0.009 | -0.015 | -0.02 |
| 0.4705 | 0.066 | 0.053 | 0.041 | 0.031 | 0.021 | 0.013 | 0.005 | -0.002 | -0.009 | -0.015 | -0.02 |
| 0.471 | 0.066 | 0.053 | 0.041 | 0.031 | 0.021 | 0.013 | 0.005 | -0.002 | -0.009 | -0.015 | -0.02 |
| 0.4715 | 0.066 | 0.053 | 0.041 | 0.031 | 0.021 | 0.013 | 0.005 | -0.002 | -0.009 | -0.015 | -0.02 |
| 0.472 | 0.066 | 0.053 | 0.041 | 0.031 | 0.021 | 0.013 | 0.005 | -0.002 | -0.009 | -0.015 | -0.021 |
| 0.4725 | 0.066 | 0.053 | 0.041 | 0.031 | 0.021 | 0.013 | 0.005 | -0.002 | -0.009 | -0.015 | -0.021 |
| 0.473 | 0.066 | 0.053 | 0.041 | 0.031 | 0.021 | 0.013 | 0.005 | -0.002 | -0.009 | -0.015 | -0.021 |
| 0.4735 | 0.066 | 0.053 | 0.041 | 0.031 | 0.021 | 0.013 | 0.005 | -0.002 | -0.009 | -0.015 | -0.021 |
| 0.474 | 0.066 | 0.053 | 0.041 | 0.031 | 0.021 | 0.013 | 0.005 | -0.003 | -0.009 | -0.015 | -0.021 |
| 0.4745 | 0.066 | 0.053 | 0.041 | 0.031 | 0.021 | 0.013 | 0.005 | -0.003 | -0.009 | -0.015 | -0.021 |
| 0.475 | 0.066 | 0.053 | 0.041 | 0.031 | 0.021 | 0.013 | 0.005 | -0.003 | -0.009 | -0.015 | -0.021 |
| 0.4755 | 0.066 | 0.053 | 0.041 | 0.031 | 0.021 | 0.013 | 0.005 | -0.003 | -0.009 | -0.015 | -0.021 |
| 0.476 | 0.066 | 0.053 | 0.041 | 0.031 | 0.021 | 0.013 | 0.005 | -0.003 | -0.009 | -0.015 | -0.021 |
| 0.4765 | 0.066 | 0.053 | 0.042 | 0.031 | 0.021 | 0.013 | 0.005 | -0.003 | -0.009 | -0.015 | -0.021 |
| 0.477 | 0.067 | 0.053 | 0.042 | 0.031 | 0.021 | 0.013 | 0.005 | -0.003 | -0.009 | -0.015 | -0.021 |
| 0.4775 | 0.067 | 0.053 | 0.042 | 0.031 | 0.021 | 0.013 | 0.005 | -0.003 | -0.009 | -0.015 | -0.021 |
| 0.478 | 0.067 | 0.053 | 0.042 | 0.031 | 0.021 | 0.013 | 0.005 | -0.003 | -0.009 | -0.015 | -0.021 |
| 0.4785 | 0.067 | 0.054 | 0.042 | 0.031 | 0.021 | 0.013 | 0.005 | -0.003 | -0.009 | -0.015 | -0.021 |
| 0.479 | 0.067 | 0.054 | 0.042 | 0.031 | 0.021 | 0.013 | 0.005 | -0.003 | -0.009 | -0.015 | -0.021 |
| 0.4795 | 0.067 | 0.054 | 0.042 | 0.031 | 0.021 | 0.013 | 0.005 | -0.003 | -0.009 | -0.015 | -0.021 |
| 0.48 | 0.067 | 0.054 | 0.042 | 0.031 | 0.021 | 0.013 | 0.005 | -0.003 | -0.009 | -0.015 | -0.021 |
| 0.4805 | 0.067 | 0.054 | 0.042 | 0.031 | 0.021 | 0.013 | 0.005 | -0.003 | -0.009 | -0.015 | -0.021 |
| 0.481 | 0.067 | 0.054 | 0.042 | 0.031 | 0.021 | 0.013 | 0.005 | -0.003 | -0.009 | -0.015 | -0.021 |
| 0.4815 | 0.067 | 0.054 | 0.042 | 0.031 | 0.021 | 0.013 | 0.005 | -0.003 | -0.009 | -0.016 | -0.021 |
| 0.482 | 0.067 | 0.054 | 0.042 | 0.031 | 0.021 | 0.013 | 0.005 | -0.003 | -0.009 | -0.016 | -0.021 |
| 0.4825 | 0.067 | 0.054 | 0.042 | 0.031 | 0.021 | 0.013 | 0.005 | -0.003 | -0.009 | -0.016 | -0.021 |
| 0.483 | 0.067 | 0.054 | 0.042 | 0.031 | 0.021 | 0.013 | 0.005 | -0.003 | -0.009 | -0.016 | -0.021 |
| 0.4835 | 0.067 | 0.054 | 0.042 | 0.031 | 0.021 | 0.013 | 0.005 | -0.003 | -0.009 | -0.016 | -0.021 |
| 0.484 | 0.067 | 0.054 | 0.042 | 0.031 | 0.021 | 0.013 | 0.005 | -0.003 | -0.009 | -0.016 | -0.021 |
| 0.4845 | 0.067 | 0.054 | 0.042 | 0.031 | 0.022 | 0.013 | 0.005 | -0.003 | -0.009 | -0.016 | -0.021 |
| 0.485 | 0.068 | 0.054 | 0.042 | 0.031 | 0.022 | 0.013 | 0.005 | -0.003 | -0.01 | -0.016 | -0.021 |
| 0.4855 | 0.068 | 0.054 | 0.042 | 0.031 | 0.022 | 0.013 | 0.005 | -0.003 | -0.01 | -0.016 | -0.021 |
| 0.486 | 0.068 | 0.054 | 0.042 | 0.031 | 0.022 | 0.013 | 0.005 | -0.003 | -0.01 | -0.016 | -0.021 |
| 0.4865 | 0.068 | 0.054 | 0.042 | 0.031 | 0.022 | 0.013 | 0.005 | -0.003 | -0.01 | -0.016 | -0.021 |
| 0.487 | 0.068 | 0.054 | 0.042 | 0.031 | 0.022 | 0.013 | 0.005 | -0.003 | -0.01 | -0.016 | -0.021 |
| 0.4875 | 0.068 | 0.054 | 0.042 | 0.031 | 0.022 | 0.013 | 0.005 | -0.003 | -0.01 | -0.016 | -0.021 |
| 0.488 | 0.068 | 0.054 | 0.042 | 0.031 | 0.022 | 0.013 | 0.005 | -0.003 | -0.01 | -0.016 | -0.022 |
| 0.4885 | 0.068 | 0.054 | 0.042 | 0.031 | 0.022 | 0.013 | 0.005 | -0.003 | -0.01 | -0.016 | -0.022 |
| 0.489 | 0.068 | 0.055 | 0.042 | 0.032 | 0.022 | 0.013 | 0.005 | -0.003 | -0.01 | -0.016 | -0.022 |
| 0.4895 | 0.068 | 0.055 | 0.042 | 0.032 | 0.022 | 0.013 | 0.005 | -0.003 | -0.01 | -0.016 | -0.022 |
| 0.49 | 0.068 | 0.055 | 0.043 | 0.032 | 0.022 | 0.013 | 0.005 | -0.003 | -0.01 | -0.016 | -0.022 |
| 0.4905 | 0.068 | 0.055 | 0.043 | 0.032 | 0.022 | 0.013 | 0.005 | -0.003 | -0.01 | -0.016 | -0.022 |
| 0.491 | 0.068 | 0.055 | 0.043 | 0.032 | 0.022 | 0.013 | 0.005 | -0.003 | -0.01 | -0.016 | -0.022 |
| 0.4915 | 0.068 | 0.055 | 0.043 | 0.032 | 0.022 | 0.013 | 0.005 | -0.003 | -0.01 | -0.016 | -0.022 |
| 0.492 | 0.068 | 0.055 | 0.043 | 0.032 | 0.022 | 0.013 | 0.005 | -0.003 | -0.01 | -0.016 | -0.022 |
| 0.4925 | 0.069 | 0.055 | 0.043 | 0.032 | 0.022 | 0.013 | 0.005 | -0.003 | -0.01 | -0.016 | -0.022 |
| 0.493 | 0.069 | 0.055 | 0.043 | 0.032 | 0.022 | 0.013 | 0.005 | -0.003 | -0.01 | -0.016 | -0.022 |
| 0.4935 | 0.069 | 0.055 | 0.043 | 0.032 | 0.022 | 0.013 | 0.005 | -0.003 | -0.01 | -0.016 | -0.022 |
| 0.494 | 0.069 | 0.055 | 0.043 | 0.032 | 0.022 | 0.013 | 0.005 | -0.003 | -0.01 | -0.016 | -0.022 |
| 0.4945 | 0.069 | 0.055 | 0.043 | 0.032 | 0.022 | 0.013 | 0.005 | -0.003 | -0.01 | -0.016 | -0.022 |
| 0.495 | 0.069 | 0.055 | 0.043 | 0.032 | 0.022 | 0.013 | 0.005 | -0.003 | -0.01 | -0.016 | -0.022 |
| 0.4955 | 0.069 | 0.055 | 0.043 | 0.032 | 0.022 | 0.013 | 0.005 | -0.003 | -0.01 | -0.016 | -0.022 |
| 0.496 | 0.069 | 0.055 | 0.043 | 0.032 | 0.022 | 0.013 | 0.005 | -0.003 | -0.01 | -0.016 | -0.022 |
| 0.4965 | 0.069 | 0.055 | 0.043 | 0.032 | 0.022 | 0.013 | 0.005 | -0.003 | -0.01 | -0.016 | -0.022 |
| 0.497 | 0.069 | 0.055 | 0.043 | 0.032 | 0.022 | 0.013 | 0.005 | -0.003 | -0.01 | -0.016 | -0.022 |
| 0.4975 | 0.069 | 0.055 | 0.043 | 0.032 | 0.022 | 0.013 | 0.005 | -0.003 | -0.01 | -0.016 | -0.022 |
| 0.498 | 0.069 | 0.055 | 0.043 | 0.032 | 0.022 | 0.013 | 0.005 | -0.003 | -0.01 | -0.016 | -0.022 |
| 0.4985 | 0.069 | 0.056 | 0.043 | 0.032 | 0.022 | 0.013 | 0.005 | -0.003 | -0.01 | -0.016 | -0.022 |
| 0.499 | 0.069 | 0.056 | 0.043 | 0.032 | 0.022 | 0.013 | 0.005 | -0.003 | -0.01 | -0.016 | -0.022 |
| 0.4995 | 0.069 | 0.056 | 0.043 | 0.032 | 0.022 | 0.013 | 0.005 | -0.003 | -0.01 | -0.016 | -0.022 |
| 0.5 | 0.07 | 0.056 | 0.043 | 0.032 | 0.022 | 0.013 | 0.005 | -0.003 | -0.01 | -0.016 | -0.022 |
| 0.5005 | 0.07 | 0.056 | 0.043 | 0.032 | 0.022 | 0.013 | 0.005 | -0.003 | -0.01 | -0.016 | -0.022 |
| 0.501 | 0.07 | 0.056 | 0.043 | 0.032 | 0.022 | 0.013 | 0.005 | -0.003 | -0.01 | -0.016 | -0.022 |
| 0.5015 | 0.07 | 0.056 | 0.043 | 0.032 | 0.022 | 0.013 | 0.005 | -0.003 | -0.01 | -0.016 | -0.022 |
| 0.502 | 0.07 | 0.056 | 0.044 | 0.032 | 0.022 | 0.013 | 0.005 | -0.003 | -0.01 | -0.016 | -0.022 |
| 0.5025 | 0.07 | 0.056 | 0.044 | 0.032 | 0.022 | 0.013 | 0.005 | -0.003 | -0.01 | -0.016 | -0.022 |
| 0.503 | 0.07 | 0.056 | 0.044 | 0.032 | 0.022 | 0.013 | 0.005 | -0.003 | -0.01 | -0.016 | -0.022 |
| 0.5035 | 0.07 | 0.056 | 0.044 | 0.032 | 0.022 | 0.013 | 0.005 | -0.003 | -0.01 | -0.016 | -0.022 |
| 0.504 | 0.07 | 0.056 | 0.044 | 0.032 | 0.022 | 0.013 | 0.005 | -0.003 | -0.01 | -0.016 | -0.022 |
| 0.5045 | 0.07 | 0.056 | 0.044 | 0.032 | 0.022 | 0.013 | 0.005 | -0.003 | -0.01 | -0.016 | -0.022 |
| 0.505 | 0.07 | 0.056 | 0.044 | 0.033 | 0.022 | 0.013 | 0.005 | -0.003 | -0.01 | -0.016 | -0.022 |
| 0.5055 | 0.07 | 0.056 | 0.044 | 0.033 | 0.022 | 0.013 | 0.005 | -0.003 | -0.01 | -0.016 | -0.022 |
| 0.506 | 0.07 | 0.056 | 0.044 | 0.033 | 0.022 | 0.013 | 0.005 | -0.003 | -0.01 | -0.016 | -0.022 |
| 0.5065 | 0.07 | 0.056 | 0.044 | 0.033 | 0.022 | 0.013 | 0.005 | -0.003 | -0.01 | -0.016 | -0.022 |
| 0.507 | 0.071 | 0.057 | 0.044 | 0.033 | 0.022 | 0.013 | 0.005 | -0.003 | -0.01 | -0.016 | -0.022 |
| 0.5075 | 0.071 | 0.057 | 0.044 | 0.033 | 0.022 | 0.013 | 0.005 | -0.003 | -0.01 | -0.016 | -0.022 |
| 0.507999999999999 | 0.071 | 0.057 | 0.044 | 0.033 | 0.022 | 0.013 | 0.005 | -0.003 | -0.01 | -0.016 | -0.022 |
| 0.508499999999999 | 0.071 | 0.057 | 0.044 | 0.033 | 0.023 | 0.013 | 0.005 | -0.003 | -0.01 | -0.016 | -0.022 |
| 0.508999999999999 | 0.071 | 0.057 | 0.044 | 0.033 | 0.023 | 0.013 | 0.005 | -0.003 | -0.01 | -0.017 | -0.022 |
| 0.509499999999999 | 0.071 | 0.057 | 0.044 | 0.033 | 0.023 | 0.013 | 0.005 | -0.003 | -0.01 | -0.017 | -0.022 |
| 0.509999999999999 | 0.071 | 0.057 | 0.044 | 0.033 | 0.023 | 0.013 | 0.005 | -0.003 | -0.01 | -0.017 | -0.022 |
| 0.510499999999999 | 0.071 | 0.057 | 0.044 | 0.033 | 0.023 | 0.013 | 0.005 | -0.003 | -0.01 | -0.017 | -0.023 |
| 0.510999999999999 | 0.071 | 0.057 | 0.044 | 0.033 | 0.023 | 0.013 | 0.005 | -0.003 | -0.01 | -0.017 | -0.023 |
| 0.511499999999999 | 0.071 | 0.057 | 0.044 | 0.033 | 0.023 | 0.013 | 0.005 | -0.003 | -0.01 | -0.017 | -0.023 |
| 0.511999999999999 | 0.071 | 0.057 | 0.044 | 0.033 | 0.023 | 0.013 | 0.005 | -0.003 | -0.01 | -0.017 | -0.023 |
| 0.512499999999999 | 0.071 | 0.057 | 0.045 | 0.033 | 0.023 | 0.013 | 0.005 | -0.003 | -0.01 | -0.017 | -0.023 |
| 0.512999999999999 | 0.071 | 0.057 | 0.045 | 0.033 | 0.023 | 0.013 | 0.005 | -0.003 | -0.01 | -0.017 | -0.023 |
| 0.513499999999999 | 0.072 | 0.057 | 0.045 | 0.033 | 0.023 | 0.013 | 0.005 | -0.003 | -0.01 | -0.017 | -0.023 |
| 0.513999999999999 | 0.072 | 0.057 | 0.045 | 0.033 | 0.023 | 0.013 | 0.005 | -0.003 | -0.01 | -0.017 | -0.023 |
| 0.514499999999999 | 0.072 | 0.057 | 0.045 | 0.033 | 0.023 | 0.013 | 0.005 | -0.003 | -0.01 | -0.017 | -0.023 |
| 0.514999999999999 | 0.072 | 0.058 | 0.045 | 0.033 | 0.023 | 0.013 | 0.005 | -0.003 | -0.01 | -0.017 | -0.023 |
| 0.515499999999999 | 0.072 | 0.058 | 0.045 | 0.033 | 0.023 | 0.013 | 0.005 | -0.003 | -0.01 | -0.017 | -0.023 |
| 0.515999999999999 | 0.072 | 0.058 | 0.045 | 0.033 | 0.023 | 0.014 | 0.005 | -0.003 | -0.01 | -0.017 | -0.023 |
| 0.516499999999999 | 0.072 | 0.058 | 0.045 | 0.033 | 0.023 | 0.014 | 0.005 | -0.003 | -0.01 | -0.017 | -0.023 |
| 0.516999999999998 | 0.072 | 0.058 | 0.045 | 0.033 | 0.023 | 0.014 | 0.005 | -0.003 | -0.01 | -0.017 | -0.023 |
| 0.517499999999998 | 0.072 | 0.058 | 0.045 | 0.033 | 0.023 | 0.014 | 0.005 | -0.003 | -0.01 | -0.017 | -0.023 |
| 0.517999999999998 | 0.072 | 0.058 | 0.045 | 0.034 | 0.023 | 0.014 | 0.005 | -0.003 | -0.01 | -0.017 | -0.023 |
| 0.518499999999998 | 0.072 | 0.058 | 0.045 | 0.034 | 0.023 | 0.014 | 0.005 | -0.003 | -0.01 | -0.017 | -0.023 |
| 0.518999999999998 | 0.072 | 0.058 | 0.045 | 0.034 | 0.023 | 0.014 | 0.005 | -0.003 | -0.01 | -0.017 | -0.023 |
| 0.519499999999998 | 0.072 | 0.058 | 0.045 | 0.034 | 0.023 | 0.014 | 0.005 | -0.003 | -0.01 | -0.017 | -0.023 |
| 0.519999999999998 | 0.073 | 0.058 | 0.045 | 0.034 | 0.023 | 0.014 | 0.005 | -0.003 | -0.01 | -0.017 | -0.023 |
| 0.520499999999998 | 0.073 | 0.058 | 0.045 | 0.034 | 0.023 | 0.014 | 0.005 | -0.003 | -0.01 | -0.017 | -0.023 |
| 0.520999999999998 | 0.073 | 0.058 | 0.045 | 0.034 | 0.023 | 0.014 | 0.005 | -0.003 | -0.01 | -0.017 | -0.023 |
| 0.521499999999998 | 0.073 | 0.058 | 0.045 | 0.034 | 0.023 | 0.014 | 0.005 | -0.003 | -0.01 | -0.017 | -0.023 |
| 0.521999999999998 | 0.073 | 0.058 | 0.046 | 0.034 | 0.023 | 0.014 | 0.005 | -0.003 | -0.01 | -0.017 | -0.023 |
| 0.522499999999998 | 0.073 | 0.059 | 0.046 | 0.034 | 0.023 | 0.014 | 0.005 | -0.003 | -0.01 | -0.017 | -0.023 |
| 0.522999999999998 | 0.073 | 0.059 | 0.046 | 0.034 | 0.023 | 0.014 | 0.005 | -0.003 | -0.01 | -0.017 | -0.023 |
| 0.523499999999998 | 0.073 | 0.059 | 0.046 | 0.034 | 0.023 | 0.014 | 0.005 | -0.003 | -0.01 | -0.017 | -0.023 |
| 0.523999999999998 | 0.073 | 0.059 | 0.046 | 0.034 | 0.023 | 0.014 | 0.005 | -0.003 | -0.01 | -0.017 | -0.023 |
| 0.524499999999998 | 0.073 | 0.059 | 0.046 | 0.034 | 0.024 | 0.014 | 0.005 | -0.003 | -0.01 | -0.017 | -0.023 |
| 0.524999999999998 | 0.073 | 0.059 | 0.046 | 0.034 | 0.024 | 0.014 | 0.005 | -0.003 | -0.01 | -0.017 | -0.023 |
| 0.525499999999998 | 0.073 | 0.059 | 0.046 | 0.034 | 0.024 | 0.014 | 0.005 | -0.003 | -0.01 | -0.017 | -0.023 |
| 0.525999999999997 | 0.074 | 0.059 | 0.046 | 0.034 | 0.024 | 0.014 | 0.005 | -0.003 | -0.01 | -0.017 | -0.023 |
| 0.526499999999997 | 0.074 | 0.059 | 0.046 | 0.034 | 0.024 | 0.014 | 0.005 | -0.003 | -0.01 | -0.017 | -0.023 |
| 0.526999999999997 | 0.074 | 0.059 | 0.046 | 0.034 | 0.024 | 0.014 | 0.005 | -0.003 | -0.01 | -0.017 | -0.023 |
| 0.527499999999997 | 0.074 | 0.059 | 0.046 | 0.034 | 0.024 | 0.014 | 0.005 | -0.003 | -0.01 | -0.017 | -0.023 |
| 0.527999999999997 | 0.074 | 0.059 | 0.046 | 0.034 | 0.024 | 0.014 | 0.005 | -0.003 | -0.01 | -0.017 | -0.023 |
| 0.528499999999997 | 0.074 | 0.059 | 0.046 | 0.034 | 0.024 | 0.014 | 0.005 | -0.003 | -0.01 | -0.017 | -0.023 |
| 0.528999999999997 | 0.074 | 0.059 | 0.046 | 0.035 | 0.024 | 0.014 | 0.005 | -0.003 | -0.01 | -0.017 | -0.023 |
| 0.529499999999997 | 0.074 | 0.06 | 0.046 | 0.035 | 0.024 | 0.014 | 0.005 | -0.003 | -0.01 | -0.017 | -0.023 |
| 0.529999999999997 | 0.074 | 0.06 | 0.046 | 0.035 | 0.024 | 0.014 | 0.005 | -0.003 | -0.01 | -0.017 | -0.023 |
| 0.530499999999997 | 0.074 | 0.06 | 0.047 | 0.035 | 0.024 | 0.014 | 0.005 | -0.003 | -0.01 | -0.017 | -0.023 |
| 0.530999999999997 | 0.074 | 0.06 | 0.047 | 0.035 | 0.024 | 0.014 | 0.005 | -0.003 | -0.01 | -0.017 | -0.023 |
| 0.531499999999997 | 0.074 | 0.06 | 0.047 | 0.035 | 0.024 | 0.014 | 0.005 | -0.003 | -0.01 | -0.017 | -0.023 |
| 0.531999999999997 | 0.075 | 0.06 | 0.047 | 0.035 | 0.024 | 0.014 | 0.006 | -0.003 | -0.01 | -0.017 | -0.023 |
| 0.532499999999997 | 0.075 | 0.06 | 0.047 | 0.035 | 0.024 | 0.014 | 0.006 | -0.003 | -0.01 | -0.017 | -0.023 |
| 0.532999999999997 | 0.075 | 0.06 | 0.047 | 0.035 | 0.024 | 0.014 | 0.006 | -0.003 | -0.01 | -0.017 | -0.023 |
| 0.533499999999997 | 0.075 | 0.06 | 0.047 | 0.035 | 0.024 | 0.014 | 0.006 | -0.003 | -0.01 | -0.017 | -0.023 |
| 0.533999999999997 | 0.075 | 0.06 | 0.047 | 0.035 | 0.024 | 0.014 | 0.006 | -0.003 | -0.01 | -0.017 | -0.023 |
| 0.534499999999997 | 0.075 | 0.06 | 0.047 | 0.035 | 0.024 | 0.015 | 0.006 | -0.002 | -0.01 | -0.017 | -0.023 |
| 0.534999999999996 | 0.075 | 0.06 | 0.047 | 0.035 | 0.024 | 0.015 | 0.006 | -0.002 | -0.01 | -0.017 | -0.023 |
| 0.535499999999996 | 0.075 | 0.06 | 0.047 | 0.035 | 0.024 | 0.015 | 0.006 | -0.002 | -0.01 | -0.017 | -0.023 |
| 0.535999999999996 | 0.075 | 0.06 | 0.047 | 0.035 | 0.024 | 0.015 | 0.006 | -0.002 | -0.01 | -0.017 | -0.023 |
| 0.536499999999996 | 0.075 | 0.061 | 0.047 | 0.035 | 0.024 | 0.015 | 0.006 | -0.002 | -0.01 | -0.017 | -0.023 |
| 0.536999999999996 | 0.075 | 0.061 | 0.047 | 0.035 | 0.025 | 0.015 | 0.006 | -0.002 | -0.01 | -0.017 | -0.023 |
| 0.537499999999996 | 0.076 | 0.061 | 0.047 | 0.035 | 0.025 | 0.015 | 0.006 | -0.002 | -0.01 | -0.017 | -0.023 |
| 0.537999999999996 | 0.076 | 0.061 | 0.047 | 0.035 | 0.025 | 0.015 | 0.006 | -0.002 | -0.01 | -0.017 | -0.023 |
| 0.538499999999996 | 0.076 | 0.061 | 0.048 | 0.036 | 0.025 | 0.015 | 0.006 | -0.002 | -0.01 | -0.017 | -0.023 |
| 0.538999999999996 | 0.076 | 0.061 | 0.048 | 0.036 | 0.025 | 0.015 | 0.006 | -0.002 | -0.01 | -0.017 | -0.023 |
| 0.539499999999996 | 0.076 | 0.061 | 0.048 | 0.036 | 0.025 | 0.015 | 0.006 | -0.002 | -0.01 | -0.017 | -0.023 |
| 0.539999999999996 | 0.076 | 0.061 | 0.048 | 0.036 | 0.025 | 0.015 | 0.006 | -0.002 | -0.01 | -0.017 | -0.023 |
| 0.540499999999996 | 0.076 | 0.061 | 0.048 | 0.036 | 0.025 | 0.015 | 0.006 | -0.002 | -0.01 | -0.017 | -0.023 |
| 0.540999999999996 | 0.076 | 0.061 | 0.048 | 0.036 | 0.025 | 0.015 | 0.006 | -0.002 | -0.01 | -0.017 | -0.023 |
| 0.541499999999996 | 0.076 | 0.061 | 0.048 | 0.036 | 0.025 | 0.015 | 0.006 | -0.002 | -0.01 | -0.017 | -0.023 |
| 0.541999999999996 | 0.076 | 0.061 | 0.048 | 0.036 | 0.025 | 0.015 | 0.006 | -0.002 | -0.01 | -0.017 | -0.023 |
| 0.542499999999996 | 0.076 | 0.062 | 0.048 | 0.036 | 0.025 | 0.015 | 0.006 | -0.002 | -0.01 | -0.017 | -0.023 |
| 0.542999999999996 | 0.077 | 0.062 | 0.048 | 0.036 | 0.025 | 0.015 | 0.006 | -0.002 | -0.01 | -0.017 | -0.023 |
| 0.543499999999996 | 0.077 | 0.062 | 0.048 | 0.036 | 0.025 | 0.015 | 0.006 | -0.002 | -0.01 | -0.017 | -0.023 |
| 0.543999999999995 | 0.077 | 0.062 | 0.048 | 0.036 | 0.025 | 0.015 | 0.006 | -0.002 | -0.01 | -0.017 | -0.023 |
| 0.544499999999995 | 0.077 | 0.062 | 0.048 | 0.036 | 0.025 | 0.015 | 0.006 | -0.002 | -0.01 | -0.017 | -0.023 |
| 0.544999999999995 | 0.077 | 0.062 | 0.048 | 0.036 | 0.025 | 0.015 | 0.006 | -0.002 | -0.01 | -0.017 | -0.023 |
| 0.545499999999995 | 0.077 | 0.062 | 0.048 | 0.036 | 0.025 | 0.015 | 0.006 | -0.002 | -0.01 | -0.017 | -0.023 |
| 0.545999999999995 | 0.077 | 0.062 | 0.049 | 0.036 | 0.025 | 0.015 | 0.006 | -0.002 | -0.01 | -0.017 | -0.023 |
| 0.546499999999995 | 0.077 | 0.062 | 0.049 | 0.036 | 0.025 | 0.015 | 0.006 | -0.002 | -0.01 | -0.017 | -0.023 |
| 0.546999999999995 | 0.077 | 0.062 | 0.049 | 0.036 | 0.025 | 0.015 | 0.006 | -0.002 | -0.01 | -0.017 | -0.023 |
| 0.547499999999995 | 0.077 | 0.062 | 0.049 | 0.037 | 0.025 | 0.015 | 0.006 | -0.002 | -0.01 | -0.017 | -0.023 |
| 0.547999999999995 | 0.078 | 0.062 | 0.049 | 0.037 | 0.026 | 0.016 | 0.006 | -0.002 | -0.01 | -0.017 | -0.023 |
| 0.548499999999995 | 0.078 | 0.062 | 0.049 | 0.037 | 0.026 | 0.016 | 0.006 | -0.002 | -0.01 | -0.017 | -0.023 |
| 0.548999999999995 | 0.078 | 0.063 | 0.049 | 0.037 | 0.026 | 0.016 | 0.006 | -0.002 | -0.009 | -0.016 | -0.023 |
| 0.549499999999995 | 0.078 | 0.063 | 0.049 | 0.037 | 0.026 | 0.016 | 0.006 | -0.002 | -0.009 | -0.016 | -0.023 |
| 0.549999999999995 | 0.078 | 0.063 | 0.049 | 0.037 | 0.026 | 0.016 | 0.007 | -0.002 | -0.009 | -0.016 | -0.023 |
| 0.550499999999995 | 0.078 | 0.063 | 0.049 | 0.037 | 0.026 | 0.016 | 0.007 | -0.002 | -0.009 | -0.016 | -0.023 |
| 0.550999999999995 | 0.078 | 0.063 | 0.049 | 0.037 | 0.026 | 0.016 | 0.007 | -0.002 | -0.009 | -0.016 | -0.023 |
| 0.551499999999995 | 0.078 | 0.063 | 0.049 | 0.037 | 0.026 | 0.016 | 0.007 | -0.002 | -0.009 | -0.016 | -0.023 |
| 0.551999999999995 | 0.078 | 0.063 | 0.049 | 0.037 | 0.026 | 0.016 | 0.007 | -0.002 | -0.009 | -0.016 | -0.023 |
| 0.552499999999995 | 0.078 | 0.063 | 0.049 | 0.037 | 0.026 | 0.016 | 0.007 | -0.002 | -0.009 | -0.016 | -0.023 |
| 0.552999999999994 | 0.079 | 0.063 | 0.05 | 0.037 | 0.026 | 0.016 | 0.007 | -0.002 | -0.009 | -0.016 | -0.023 |
| 0.553499999999994 | 0.079 | 0.063 | 0.05 | 0.037 | 0.026 | 0.016 | 0.007 | -0.002 | -0.009 | -0.016 | -0.023 |
| 0.553999999999994 | 0.079 | 0.063 | 0.05 | 0.037 | 0.026 | 0.016 | 0.007 | -0.002 | -0.009 | -0.016 | -0.023 |
| 0.554499999999994 | 0.079 | 0.064 | 0.05 | 0.037 | 0.026 | 0.016 | 0.007 | -0.002 | -0.009 | -0.016 | -0.023 |
| 0.554999999999994 | 0.079 | 0.064 | 0.05 | 0.037 | 0.026 | 0.016 | 0.007 | -0.002 | -0.009 | -0.016 | -0.023 |
| 0.555499999999994 | 0.079 | 0.064 | 0.05 | 0.038 | 0.026 | 0.016 | 0.007 | -0.002 | -0.009 | -0.016 | -0.023 |
| 0.555999999999994 | 0.079 | 0.064 | 0.05 | 0.038 | 0.026 | 0.016 | 0.007 | -0.001 | -0.009 | -0.016 | -0.023 |
| 0.556499999999994 | 0.079 | 0.064 | 0.05 | 0.038 | 0.026 | 0.016 | 0.007 | -0.001 | -0.009 | -0.016 | -0.023 |
| 0.556999999999994 | 0.079 | 0.064 | 0.05 | 0.038 | 0.026 | 0.016 | 0.007 | -0.001 | -0.009 | -0.016 | -0.023 |
| 0.557499999999994 | 0.079 | 0.064 | 0.05 | 0.038 | 0.027 | 0.016 | 0.007 | -0.001 | -0.009 | -0.016 | -0.023 |
| 0.557999999999994 | 0.08 | 0.064 | 0.05 | 0.038 | 0.027 | 0.016 | 0.007 | -0.001 | -0.009 | -0.016 | -0.023 |
| 0.558499999999994 | 0.08 | 0.064 | 0.05 | 0.038 | 0.027 | 0.016 | 0.007 | -0.001 | -0.009 | -0.016 | -0.023 |
| 0.558999999999994 | 0.08 | 0.064 | 0.05 | 0.038 | 0.027 | 0.016 | 0.007 | -0.001 | -0.009 | -0.016 | -0.023 |
| 0.559499999999994 | 0.08 | 0.064 | 0.051 | 0.038 | 0.027 | 0.017 | 0.007 | -0.001 | -0.009 | -0.016 | -0.023 |
| 0.559999999999994 | 0.08 | 0.065 | 0.051 | 0.038 | 0.027 | 0.017 | 0.007 | -0.001 | -0.009 | -0.016 | -0.023 |
| 0.560499999999994 | 0.08 | 0.065 | 0.051 | 0.038 | 0.027 | 0.017 | 0.007 | -0.001 | -0.009 | -0.016 | -0.023 |
| 0.560999999999994 | 0.08 | 0.065 | 0.051 | 0.038 | 0.027 | 0.017 | 0.007 | -0.001 | -0.009 | -0.016 | -0.023 |
| 0.561499999999994 | 0.08 | 0.065 | 0.051 | 0.038 | 0.027 | 0.017 | 0.007 | -0.001 | -0.009 | -0.016 | -0.023 |
| 0.561999999999993 | 0.08 | 0.065 | 0.051 | 0.038 | 0.027 | 0.017 | 0.007 | -0.001 | -0.009 | -0.016 | -0.023 |
| 0.562499999999993 | 0.081 | 0.065 | 0.051 | 0.038 | 0.027 | 0.017 | 0.007 | -0.001 | -0.009 | -0.016 | -0.023 |
| 0.562999999999993 | 0.081 | 0.065 | 0.051 | 0.039 | 0.027 | 0.017 | 0.008 | -0.001 | -0.009 | -0.016 | -0.023 |
| 0.563499999999993 | 0.081 | 0.065 | 0.051 | 0.039 | 0.027 | 0.017 | 0.008 | -0.001 | -0.009 | -0.016 | -0.023 |
| 0.563999999999993 | 0.081 | 0.065 | 0.051 | 0.039 | 0.027 | 0.017 | 0.008 | -0.001 | -0.009 | -0.016 | -0.023 |
| 0.564499999999993 | 0.081 | 0.065 | 0.051 | 0.039 | 0.027 | 0.017 | 0.008 | -0.001 | -0.009 | -0.016 | -0.023 |
| 0.564999999999993 | 0.081 | 0.065 | 0.051 | 0.039 | 0.027 | 0.017 | 0.008 | -0.001 | -0.009 | -0.016 | -0.023 |
| 0.565499999999993 | 0.081 | 0.066 | 0.052 | 0.039 | 0.027 | 0.017 | 0.008 | -0.001 | -0.009 | -0.016 | -0.023 |
| 0.565999999999993 | 0.081 | 0.066 | 0.052 | 0.039 | 0.028 | 0.017 | 0.008 | -0.001 | -0.009 | -0.016 | -0.023 |
| 0.566499999999993 | 0.081 | 0.066 | 0.052 | 0.039 | 0.028 | 0.017 | 0.008 | -0.001 | -0.009 | -0.016 | -0.022 |
| 0.566999999999993 | 0.081 | 0.066 | 0.052 | 0.039 | 0.028 | 0.017 | 0.008 | -0.001 | -0.009 | -0.016 | -0.022 |
| 0.567499999999993 | 0.082 | 0.066 | 0.052 | 0.039 | 0.028 | 0.017 | 0.008 | -0.001 | -0.009 | -0.016 | -0.022 |
| 0.567999999999993 | 0.082 | 0.066 | 0.052 | 0.039 | 0.028 | 0.017 | 0.008 | -0.001 | -0.009 | -0.016 | -0.022 |
| 0.568499999999993 | 0.082 | 0.066 | 0.052 | 0.039 | 0.028 | 0.017 | 0.008 | -0.001 | -0.009 | -0.016 | -0.022 |
| 0.568999999999993 | 0.082 | 0.066 | 0.052 | 0.039 | 0.028 | 0.018 | 0.008 | -0.001 | -0.008 | -0.016 | -0.022 |
| 0.569499999999993 | 0.082 | 0.066 | 0.052 | 0.039 | 0.028 | 0.018 | 0.008 | -0.001 | -0.008 | -0.016 | -0.022 |
| 0.569999999999993 | 0.082 | 0.066 | 0.052 | 0.04 | 0.028 | 0.018 | 0.008 | -0.001 | -0.008 | -0.016 | -0.022 |
| 0.570499999999993 | 0.082 | 0.067 | 0.052 | 0.04 | 0.028 | 0.018 | 0.008 | 0 | -0.008 | -0.016 | -0.022 |
| 0.570999999999993 | 0.082 | 0.067 | 0.052 | 0.04 | 0.028 | 0.018 | 0.008 | 0 | -0.008 | -0.016 | -0.022 |
| 0.571499999999992 | 0.083 | 0.067 | 0.053 | 0.04 | 0.028 | 0.018 | 0.008 | 0 | -0.008 | -0.016 | -0.022 |
| 0.571999999999992 | 0.083 | 0.067 | 0.053 | 0.04 | 0.028 | 0.018 | 0.008 | 0 | -0.008 | -0.016 | -0.022 |
| 0.572499999999992 | 0.083 | 0.067 | 0.053 | 0.04 | 0.028 | 0.018 | 0.008 | 0 | -0.008 | -0.016 | -0.022 |
| 0.572999999999992 | 0.083 | 0.067 | 0.053 | 0.04 | 0.028 | 0.018 | 0.008 | 0 | -0.008 | -0.016 | -0.022 |
| 0.573499999999992 | 0.083 | 0.067 | 0.053 | 0.04 | 0.029 | 0.018 | 0.008 | 0 | -0.008 | -0.015 | -0.022 |
| 0.573999999999992 | 0.083 | 0.067 | 0.053 | 0.04 | 0.029 | 0.018 | 0.009 | 0 | -0.008 | -0.015 | -0.022 |
| 0.574499999999992 | 0.083 | 0.067 | 0.053 | 0.04 | 0.029 | 0.018 | 0.009 | 0 | -0.008 | -0.015 | -0.022 |
| 0.574999999999992 | 0.083 | 0.067 | 0.053 | 0.04 | 0.029 | 0.018 | 0.009 | 0 | -0.008 | -0.015 | -0.022 |
| 0.575499999999992 | 0.083 | 0.068 | 0.053 | 0.04 | 0.029 | 0.018 | 0.009 | 0 | -0.008 | -0.015 | -0.022 |
| 0.575999999999992 | 0.084 | 0.068 | 0.053 | 0.04 | 0.029 | 0.018 | 0.009 | 0 | -0.008 | -0.015 | -0.022 |
| 0.576499999999992 | 0.084 | 0.068 | 0.053 | 0.041 | 0.029 | 0.018 | 0.009 | 0 | -0.008 | -0.015 | -0.022 |
| 0.576999999999992 | 0.084 | 0.068 | 0.054 | 0.041 | 0.029 | 0.018 | 0.009 | 0 | -0.008 | -0.015 | -0.022 |
| 0.577499999999992 | 0.084 | 0.068 | 0.054 | 0.041 | 0.029 | 0.019 | 0.009 | 0 | -0.008 | -0.015 | -0.022 |
| 0.577999999999992 | 0.084 | 0.068 | 0.054 | 0.041 | 0.029 | 0.019 | 0.009 | 0 | -0.008 | -0.015 | -0.022 |
| 0.578499999999992 | 0.084 | 0.068 | 0.054 | 0.041 | 0.029 | 0.019 | 0.009 | 0 | -0.008 | -0.015 | -0.022 |
| 0.578999999999992 | 0.084 | 0.068 | 0.054 | 0.041 | 0.029 | 0.019 | 0.009 | 0 | -0.008 | -0.015 | -0.022 |
| 0.579499999999992 | 0.084 | 0.068 | 0.054 | 0.041 | 0.029 | 0.019 | 0.009 | 0 | -0.008 | -0.015 | -0.022 |
| 0.579999999999992 | 0.084 | 0.068 | 0.054 | 0.041 | 0.029 | 0.019 | 0.009 | 0 | -0.008 | -0.015 | -0.022 |
| 0.580499999999991 | 0.085 | 0.069 | 0.054 | 0.041 | 0.03 | 0.019 | 0.009 | 0 | -0.008 | -0.015 | -0.022 |
| 0.580999999999991 | 0.085 | 0.069 | 0.054 | 0.041 | 0.03 | 0.019 | 0.009 | 0 | -0.008 | -0.015 | -0.022 |
| 0.581499999999991 | 0.085 | 0.069 | 0.054 | 0.041 | 0.03 | 0.019 | 0.009 | 0.001 | -0.008 | -0.015 | -0.022 |
| 0.581999999999991 | 0.085 | 0.069 | 0.054 | 0.041 | 0.03 | 0.019 | 0.009 | 0.001 | -0.008 | -0.015 | -0.022 |
| 0.582499999999991 | 0.085 | 0.069 | 0.055 | 0.042 | 0.03 | 0.019 | 0.009 | 0.001 | -0.007 | -0.015 | -0.022 |
| 0.582999999999991 | 0.085 | 0.069 | 0.055 | 0.042 | 0.03 | 0.019 | 0.01 | 0.001 | -0.007 | -0.015 | -0.022 |
| 0.583499999999991 | 0.085 | 0.069 | 0.055 | 0.042 | 0.03 | 0.019 | 0.01 | 0.001 | -0.007 | -0.015 | -0.022 |
| 0.583999999999991 | 0.085 | 0.069 | 0.055 | 0.042 | 0.03 | 0.019 | 0.01 | 0.001 | -0.007 | -0.015 | -0.022 |
| 0.584499999999991 | 0.086 | 0.069 | 0.055 | 0.042 | 0.03 | 0.019 | 0.01 | 0.001 | -0.007 | -0.015 | -0.022 |
| 0.584999999999991 | 0.086 | 0.07 | 0.055 | 0.042 | 0.03 | 0.019 | 0.01 | 0.001 | -0.007 | -0.015 | -0.022 |
| 0.585499999999991 | 0.086 | 0.07 | 0.055 | 0.042 | 0.03 | 0.02 | 0.01 | 0.001 | -0.007 | -0.015 | -0.022 |
| 0.585999999999991 | 0.086 | 0.07 | 0.055 | 0.042 | 0.03 | 0.02 | 0.01 | 0.001 | -0.007 | -0.015 | -0.022 |
| 0.586499999999991 | 0.086 | 0.07 | 0.055 | 0.042 | 0.03 | 0.02 | 0.01 | 0.001 | -0.007 | -0.015 | -0.021 |
| 0.586999999999991 | 0.086 | 0.07 | 0.055 | 0.042 | 0.03 | 0.02 | 0.01 | 0.001 | -0.007 | -0.015 | -0.021 |
| 0.587499999999991 | 0.086 | 0.07 | 0.056 | 0.042 | 0.031 | 0.02 | 0.01 | 0.001 | -0.007 | -0.015 | -0.021 |
| 0.587999999999991 | 0.086 | 0.07 | 0.056 | 0.043 | 0.031 | 0.02 | 0.01 | 0.001 | -0.007 | -0.014 | -0.021 |
| 0.588499999999991 | 0.087 | 0.07 | 0.056 | 0.043 | 0.031 | 0.02 | 0.01 | 0.001 | -0.007 | -0.014 | -0.021 |
| 0.588999999999991 | 0.087 | 0.07 | 0.056 | 0.043 | 0.031 | 0.02 | 0.01 | 0.001 | -0.007 | -0.014 | -0.021 |
| 0.58949999999999 | 0.087 | 0.071 | 0.056 | 0.043 | 0.031 | 0.02 | 0.01 | 0.001 | -0.007 | -0.014 | -0.021 |
| 0.58999999999999 | 0.087 | 0.071 | 0.056 | 0.043 | 0.031 | 0.02 | 0.01 | 0.001 | -0.007 | -0.014 | -0.021 |
| 0.59049999999999 | 0.087 | 0.071 | 0.056 | 0.043 | 0.031 | 0.02 | 0.01 | 0.001 | -0.007 | -0.014 | -0.021 |
| 0.59099999999999 | 0.087 | 0.071 | 0.056 | 0.043 | 0.031 | 0.02 | 0.01 | 0.001 | -0.007 | -0.014 | -0.021 |
| 0.59149999999999 | 0.087 | 0.071 | 0.056 | 0.043 | 0.031 | 0.02 | 0.011 | 0.002 | -0.007 | -0.014 | -0.021 |
| 0.59199999999999 | 0.087 | 0.071 | 0.056 | 0.043 | 0.031 | 0.02 | 0.011 | 0.002 | -0.007 | -0.014 | -0.021 |
| 0.59249999999999 | 0.088 | 0.071 | 0.057 | 0.043 | 0.031 | 0.021 | 0.011 | 0.002 | -0.007 | -0.014 | -0.021 |
| 0.59299999999999 | 0.088 | 0.071 | 0.057 | 0.043 | 0.031 | 0.021 | 0.011 | 0.002 | -0.007 | -0.014 | -0.021 |
| 0.59349999999999 | 0.088 | 0.071 | 0.057 | 0.044 | 0.032 | 0.021 | 0.011 | 0.002 | -0.006 | -0.014 | -0.021 |
| 0.59399999999999 | 0.088 | 0.072 | 0.057 | 0.044 | 0.032 | 0.021 | 0.011 | 0.002 | -0.006 | -0.014 | -0.021 |
| 0.59449999999999 | 0.088 | 0.072 | 0.057 | 0.044 | 0.032 | 0.021 | 0.011 | 0.002 | -0.006 | -0.014 | -0.021 |
| 0.59499999999999 | 0.088 | 0.072 | 0.057 | 0.044 | 0.032 | 0.021 | 0.011 | 0.002 | -0.006 | -0.014 | -0.021 |
| 0.59549999999999 | 0.088 | 0.072 | 0.057 | 0.044 | 0.032 | 0.021 | 0.011 | 0.002 | -0.006 | -0.014 | -0.021 |
| 0.59599999999999 | 0.089 | 0.072 | 0.057 | 0.044 | 0.032 | 0.021 | 0.011 | 0.002 | -0.006 | -0.014 | -0.021 |
| 0.59649999999999 | 0.089 | 0.072 | 0.057 | 0.044 | 0.032 | 0.021 | 0.011 | 0.002 | -0.006 | -0.014 | -0.021 |
| 0.59699999999999 | 0.089 | 0.072 | 0.057 | 0.044 | 0.032 | 0.021 | 0.011 | 0.002 | -0.006 | -0.014 | -0.021 |
| 0.59749999999999 | 0.089 | 0.072 | 0.058 | 0.044 | 0.032 | 0.021 | 0.011 | 0.002 | -0.006 | -0.014 | -0.021 |
| 0.59799999999999 | 0.089 | 0.073 | 0.058 | 0.044 | 0.032 | 0.021 | 0.011 | 0.002 | -0.006 | -0.014 | -0.021 |
| 0.598499999999989 | 0.089 | 0.073 | 0.058 | 0.044 | 0.032 | 0.021 | 0.011 | 0.002 | -0.006 | -0.014 | -0.021 |
| 0.598999999999989 | 0.089 | 0.073 | 0.058 | 0.045 | 0.032 | 0.021 | 0.012 | 0.002 | -0.006 | -0.014 | -0.021 |
| 0.599499999999989 | 0.089 | 0.073 | 0.058 | 0.045 | 0.033 | 0.022 | 0.012 | 0.002 | -0.006 | -0.013 | -0.02 |
| 0.599999999999989 | 0.09 | 0.073 | 0.058 | 0.045 | 0.033 | 0.022 | 0.012 | 0.003 | -0.006 | -0.013 | -0.02 |
| 0.600499999999989 | 0.09 | 0.073 | 0.058 | 0.045 | 0.033 | 0.022 | 0.012 | 0.003 | -0.006 | -0.013 | -0.02 |
| 0.600999999999989 | 0.09 | 0.073 | 0.058 | 0.045 | 0.033 | 0.022 | 0.012 | 0.003 | -0.006 | -0.013 | -0.02 |
| 0.601499999999989 | 0.09 | 0.073 | 0.058 | 0.045 | 0.033 | 0.022 | 0.012 | 0.003 | -0.006 | -0.013 | -0.02 |
| 0.601999999999989 | 0.09 | 0.074 | 0.059 | 0.045 | 0.033 | 0.022 | 0.012 | 0.003 | -0.006 | -0.013 | -0.02 |
| 0.602499999999989 | 0.09 | 0.074 | 0.059 | 0.045 | 0.033 | 0.022 | 0.012 | 0.003 | -0.005 | -0.013 | -0.02 |
| 0.602999999999989 | 0.09 | 0.074 | 0.059 | 0.045 | 0.033 | 0.022 | 0.012 | 0.003 | -0.005 | -0.013 | -0.02 |
| 0.603499999999989 | 0.091 | 0.074 | 0.059 | 0.045 | 0.033 | 0.022 | 0.012 | 0.003 | -0.005 | -0.013 | -0.02 |
| 0.603999999999989 | 0.091 | 0.074 | 0.059 | 0.046 | 0.033 | 0.022 | 0.012 | 0.003 | -0.005 | -0.013 | -0.02 |
| 0.604499999999989 | 0.091 | 0.074 | 0.059 | 0.046 | 0.033 | 0.022 | 0.012 | 0.003 | -0.005 | -0.013 | -0.02 |
| 0.604999999999989 | 0.091 | 0.074 | 0.059 | 0.046 | 0.034 | 0.022 | 0.012 | 0.003 | -0.005 | -0.013 | -0.02 |
| 0.605499999999989 | 0.091 | 0.074 | 0.059 | 0.046 | 0.034 | 0.023 | 0.012 | 0.003 | -0.005 | -0.013 | -0.02 |
| 0.605999999999989 | 0.091 | 0.074 | 0.059 | 0.046 | 0.034 | 0.023 | 0.013 | 0.003 | -0.005 | -0.013 | -0.02 |
| 0.606499999999989 | 0.091 | 0.075 | 0.06 | 0.046 | 0.034 | 0.023 | 0.013 | 0.003 | -0.005 | -0.013 | -0.02 |
| 0.606999999999988 | 0.092 | 0.075 | 0.06 | 0.046 | 0.034 | 0.023 | 0.013 | 0.003 | -0.005 | -0.013 | -0.02 |
| 0.607499999999988 | 0.092 | 0.075 | 0.06 | 0.046 | 0.034 | 0.023 | 0.013 | 0.004 | -0.005 | -0.013 | -0.02 |
| 0.607999999999988 | 0.092 | 0.075 | 0.06 | 0.046 | 0.034 | 0.023 | 0.013 | 0.004 | -0.005 | -0.013 | -0.02 |
| 0.608499999999988 | 0.092 | 0.075 | 0.06 | 0.046 | 0.034 | 0.023 | 0.013 | 0.004 | -0.005 | -0.013 | -0.02 |
| 0.608999999999988 | 0.092 | 0.075 | 0.06 | 0.047 | 0.034 | 0.023 | 0.013 | 0.004 | -0.005 | -0.012 | -0.02 |
| 0.609499999999988 | 0.092 | 0.075 | 0.06 | 0.047 | 0.034 | 0.023 | 0.013 | 0.004 | -0.005 | -0.012 | -0.02 |
| 0.609999999999988 | 0.092 | 0.076 | 0.06 | 0.047 | 0.034 | 0.023 | 0.013 | 0.004 | -0.005 | -0.012 | -0.019 |
| 0.610499999999988 | 0.093 | 0.076 | 0.061 | 0.047 | 0.035 | 0.023 | 0.013 | 0.004 | -0.005 | -0.012 | -0.019 |
| 0.610999999999988 | 0.093 | 0.076 | 0.061 | 0.047 | 0.035 | 0.023 | 0.013 | 0.004 | -0.004 | -0.012 | -0.019 |
| 0.611499999999988 | 0.093 | 0.076 | 0.061 | 0.047 | 0.035 | 0.024 | 0.013 | 0.004 | -0.004 | -0.012 | -0.019 |
| 0.611999999999988 | 0.093 | 0.076 | 0.061 | 0.047 | 0.035 | 0.024 | 0.013 | 0.004 | -0.004 | -0.012 | -0.019 |
| 0.612499999999988 | 0.093 | 0.076 | 0.061 | 0.047 | 0.035 | 0.024 | 0.014 | 0.004 | -0.004 | -0.012 | -0.019 |
| 0.612999999999988 | 0.093 | 0.076 | 0.061 | 0.047 | 0.035 | 0.024 | 0.014 | 0.004 | -0.004 | -0.012 | -0.019 |
| 0.613499999999988 | 0.093 | 0.076 | 0.061 | 0.048 | 0.035 | 0.024 | 0.014 | 0.004 | -0.004 | -0.012 | -0.019 |
| 0.613999999999988 | 0.094 | 0.077 | 0.061 | 0.048 | 0.035 | 0.024 | 0.014 | 0.004 | -0.004 | -0.012 | -0.019 |
| 0.614499999999988 | 0.094 | 0.077 | 0.061 | 0.048 | 0.035 | 0.024 | 0.014 | 0.005 | -0.004 | -0.012 | -0.019 |
| 0.614999999999988 | 0.094 | 0.077 | 0.062 | 0.048 | 0.035 | 0.024 | 0.014 | 0.005 | -0.004 | -0.012 | -0.019 |
| 0.615499999999988 | 0.094 | 0.077 | 0.062 | 0.048 | 0.036 | 0.024 | 0.014 | 0.005 | -0.004 | -0.012 | -0.019 |
| 0.615999999999987 | 0.094 | 0.077 | 0.062 | 0.048 | 0.036 | 0.024 | 0.014 | 0.005 | -0.004 | -0.012 | -0.019 |
| 0.616499999999987 | 0.094 | 0.077 | 0.062 | 0.048 | 0.036 | 0.024 | 0.014 | 0.005 | -0.004 | -0.012 | -0.019 |
| 0.616999999999987 | 0.094 | 0.077 | 0.062 | 0.048 | 0.036 | 0.025 | 0.014 | 0.005 | -0.004 | -0.012 | -0.019 |
| 0.617499999999987 | 0.095 | 0.078 | 0.062 | 0.048 | 0.036 | 0.025 | 0.014 | 0.005 | -0.004 | -0.011 | -0.019 |
| 0.617999999999987 | 0.095 | 0.078 | 0.062 | 0.049 | 0.036 | 0.025 | 0.014 | 0.005 | -0.004 | -0.011 | -0.019 |
| 0.618499999999987 | 0.095 | 0.078 | 0.062 | 0.049 | 0.036 | 0.025 | 0.015 | 0.005 | -0.003 | -0.011 | -0.019 |
| 0.618999999999987 | 0.095 | 0.078 | 0.063 | 0.049 | 0.036 | 0.025 | 0.015 | 0.005 | -0.003 | -0.011 | -0.019 |
| 0.619499999999987 | 0.095 | 0.078 | 0.063 | 0.049 | 0.036 | 0.025 | 0.015 | 0.005 | -0.003 | -0.011 | -0.018 |
| 0.619999999999987 | 0.095 | 0.078 | 0.063 | 0.049 | 0.036 | 0.025 | 0.015 | 0.005 | -0.003 | -0.011 | -0.018 |
| 0.620499999999987 | 0.095 | 0.078 | 0.063 | 0.049 | 0.037 | 0.025 | 0.015 | 0.005 | -0.003 | -0.011 | -0.018 |
| 0.620999999999987 | 0.096 | 0.078 | 0.063 | 0.049 | 0.037 | 0.025 | 0.015 | 0.006 | -0.003 | -0.011 | -0.018 |
| 0.621499999999987 | 0.096 | 0.079 | 0.063 | 0.049 | 0.037 | 0.025 | 0.015 | 0.006 | -0.003 | -0.011 | -0.018 |
| 0.621999999999987 | 0.096 | 0.079 | 0.063 | 0.049 | 0.037 | 0.026 | 0.015 | 0.006 | -0.003 | -0.011 | -0.018 |
| 0.622499999999987 | 0.096 | 0.079 | 0.063 | 0.05 | 0.037 | 0.026 | 0.015 | 0.006 | -0.003 | -0.011 | -0.018 |
| 0.622999999999987 | 0.096 | 0.079 | 0.064 | 0.05 | 0.037 | 0.026 | 0.015 | 0.006 | -0.003 | -0.011 | -0.018 |
| 0.623499999999987 | 0.096 | 0.079 | 0.064 | 0.05 | 0.037 | 0.026 | 0.015 | 0.006 | -0.003 | -0.011 | -0.018 |
| 0.623999999999987 | 0.097 | 0.079 | 0.064 | 0.05 | 0.037 | 0.026 | 0.016 | 0.006 | -0.003 | -0.011 | -0.018 |
| 0.624499999999987 | 0.097 | 0.079 | 0.064 | 0.05 | 0.037 | 0.026 | 0.016 | 0.006 | -0.003 | -0.011 | -0.018 |
| 0.624999999999986 | 0.097 | 0.08 | 0.064 | 0.05 | 0.038 | 0.026 | 0.016 | 0.006 | -0.002 | -0.01 | -0.018 |
| 0.625499999999986 | 0.097 | 0.08 | 0.064 | 0.05 | 0.038 | 0.026 | 0.016 | 0.006 | -0.002 | -0.01 | -0.018 |
| 0.625999999999986 | 0.097 | 0.08 | 0.064 | 0.05 | 0.038 | 0.026 | 0.016 | 0.006 | -0.002 | -0.01 | -0.018 |
| 0.626499999999986 | 0.097 | 0.08 | 0.064 | 0.051 | 0.038 | 0.026 | 0.016 | 0.006 | -0.002 | -0.01 | -0.018 |
| 0.626999999999986 | 0.098 | 0.08 | 0.065 | 0.051 | 0.038 | 0.026 | 0.016 | 0.007 | -0.002 | -0.01 | -0.018 |
| 0.627499999999986 | 0.098 | 0.08 | 0.065 | 0.051 | 0.038 | 0.027 | 0.016 | 0.007 | -0.002 | -0.01 | -0.017 |
| 0.627999999999986 | 0.098 | 0.08 | 0.065 | 0.051 | 0.038 | 0.027 | 0.016 | 0.007 | -0.002 | -0.01 | -0.017 |
| 0.628499999999986 | 0.098 | 0.081 | 0.065 | 0.051 | 0.038 | 0.027 | 0.016 | 0.007 | -0.002 | -0.01 | -0.017 |
| 0.628999999999986 | 0.098 | 0.081 | 0.065 | 0.051 | 0.038 | 0.027 | 0.016 | 0.007 | -0.002 | -0.01 | -0.017 |
| 0.629499999999986 | 0.098 | 0.081 | 0.065 | 0.051 | 0.039 | 0.027 | 0.017 | 0.007 | -0.002 | -0.01 | -0.017 |
| 0.629999999999986 | 0.098 | 0.081 | 0.065 | 0.051 | 0.039 | 0.027 | 0.017 | 0.007 | -0.002 | -0.01 | -0.017 |
| 0.630499999999986 | 0.099 | 0.081 | 0.066 | 0.051 | 0.039 | 0.027 | 0.017 | 0.007 | -0.002 | -0.01 | -0.017 |
| 0.630999999999986 | 0.099 | 0.081 | 0.066 | 0.052 | 0.039 | 0.027 | 0.017 | 0.007 | -0.002 | -0.01 | -0.017 |
| 0.631499999999986 | 0.099 | 0.081 | 0.066 | 0.052 | 0.039 | 0.027 | 0.017 | 0.007 | -0.001 | -0.009 | -0.017 |
| 0.631999999999986 | 0.099 | 0.082 | 0.066 | 0.052 | 0.039 | 0.028 | 0.017 | 0.007 | -0.001 | -0.009 | -0.017 |
| 0.632499999999986 | 0.099 | 0.082 | 0.066 | 0.052 | 0.039 | 0.028 | 0.017 | 0.007 | -0.001 | -0.009 | -0.017 |
| 0.632999999999986 | 0.099 | 0.082 | 0.066 | 0.052 | 0.039 | 0.028 | 0.017 | 0.008 | -0.001 | -0.009 | -0.017 |
| 0.633499999999986 | 0.1 | 0.082 | 0.066 | 0.052 | 0.039 | 0.028 | 0.017 | 0.008 | -0.001 | -0.009 | -0.017 |
| 0.633999999999985 | 0.1 | 0.082 | 0.067 | 0.052 | 0.04 | 0.028 | 0.017 | 0.008 | -0.001 | -0.009 | -0.017 |
| 0.634499999999985 | 0.1 | 0.082 | 0.067 | 0.052 | 0.04 | 0.028 | 0.017 | 0.008 | -0.001 | -0.009 | -0.016 |
| 0.634999999999985 | 0.1 | 0.083 | 0.067 | 0.053 | 0.04 | 0.028 | 0.018 | 0.008 | -0.001 | -0.009 | -0.016 |
| 0.635499999999985 | 0.1 | 0.083 | 0.067 | 0.053 | 0.04 | 0.028 | 0.018 | 0.008 | -0.001 | -0.009 | -0.016 |
| 0.635999999999985 | 0.1 | 0.083 | 0.067 | 0.053 | 0.04 | 0.028 | 0.018 | 0.008 | -0.001 | -0.009 | -0.016 |
| 0.636499999999985 | 0.101 | 0.083 | 0.067 | 0.053 | 0.04 | 0.028 | 0.018 | 0.008 | -0.001 | -0.009 | -0.016 |
| 0.636999999999985 | 0.101 | 0.083 | 0.067 | 0.053 | 0.04 | 0.029 | 0.018 | 0.008 | -0.001 | -0.009 | -0.016 |
| 0.637499999999985 | 0.101 | 0.083 | 0.067 | 0.053 | 0.04 | 0.029 | 0.018 | 0.008 | 0 | -0.009 | -0.016 |
| 0.637999999999985 | 0.101 | 0.083 | 0.068 | 0.053 | 0.041 | 0.029 | 0.018 | 0.009 | 0 | -0.008 | -0.016 |
| 0.638499999999985 | 0.101 | 0.084 | 0.068 | 0.054 | 0.041 | 0.029 | 0.018 | 0.009 | 0 | -0.008 | -0.016 |
| 0.638999999999985 | 0.101 | 0.084 | 0.068 | 0.054 | 0.041 | 0.029 | 0.018 | 0.009 | 0 | -0.008 | -0.016 |
| 0.639499999999985 | 0.102 | 0.084 | 0.068 | 0.054 | 0.041 | 0.029 | 0.019 | 0.009 | 0 | -0.008 | -0.016 |
| 0.639999999999985 | 0.102 | 0.084 | 0.068 | 0.054 | 0.041 | 0.029 | 0.019 | 0.009 | 0 | -0.008 | -0.016 |
| 0.640499999999985 | 0.102 | 0.084 | 0.068 | 0.054 | 0.041 | 0.029 | 0.019 | 0.009 | 0 | -0.008 | -0.016 |
| 0.640999999999985 | 0.102 | 0.084 | 0.068 | 0.054 | 0.041 | 0.03 | 0.019 | 0.009 | 0 | -0.008 | -0.015 |
| 0.641499999999985 | 0.102 | 0.085 | 0.069 | 0.054 | 0.041 | 0.03 | 0.019 | 0.009 | 0 | -0.008 | -0.015 |
| 0.641999999999985 | 0.102 | 0.085 | 0.069 | 0.054 | 0.041 | 0.03 | 0.019 | 0.009 | 0 | -0.008 | -0.015 |
| 0.642499999999985 | 0.103 | 0.085 | 0.069 | 0.055 | 0.042 | 0.03 | 0.019 | 0.009 | 0 | -0.008 | -0.015 |
| 0.642999999999984 | 0.103 | 0.085 | 0.069 | 0.055 | 0.042 | 0.03 | 0.019 | 0.009 | 0.001 | -0.008 | -0.015 |
| 0.643499999999984 | 0.103 | 0.085 | 0.069 | 0.055 | 0.042 | 0.03 | 0.019 | 0.01 | 0.001 | -0.008 | -0.015 |
| 0.643999999999984 | 0.103 | 0.085 | 0.069 | 0.055 | 0.042 | 0.03 | 0.019 | 0.01 | 0.001 | -0.007 | -0.015 |
| 0.644499999999984 | 0.103 | 0.085 | 0.07 | 0.055 | 0.042 | 0.03 | 0.02 | 0.01 | 0.001 | -0.007 | -0.015 |
| 0.644999999999984 | 0.103 | 0.086 | 0.07 | 0.055 | 0.042 | 0.03 | 0.02 | 0.01 | 0.001 | -0.007 | -0.015 |
| 0.645499999999984 | 0.104 | 0.086 | 0.07 | 0.055 | 0.042 | 0.031 | 0.02 | 0.01 | 0.001 | -0.007 | -0.015 |
| 0.645999999999984 | 0.104 | 0.086 | 0.07 | 0.056 | 0.042 | 0.031 | 0.02 | 0.01 | 0.001 | -0.007 | -0.015 |
| 0.646499999999984 | 0.104 | 0.086 | 0.07 | 0.056 | 0.043 | 0.031 | 0.02 | 0.01 | 0.001 | -0.007 | -0.015 |
| 0.646999999999984 | 0.104 | 0.086 | 0.07 | 0.056 | 0.043 | 0.031 | 0.02 | 0.01 | 0.001 | -0.007 | -0.015 |
| 0.647499999999984 | 0.104 | 0.086 | 0.07 | 0.056 | 0.043 | 0.031 | 0.02 | 0.01 | 0.001 | -0.007 | -0.014 |
| 0.647999999999984 | 0.105 | 0.087 | 0.071 | 0.056 | 0.043 | 0.031 | 0.02 | 0.011 | 0.002 | -0.007 | -0.014 |
| 0.648499999999984 | 0.105 | 0.087 | 0.071 | 0.056 | 0.043 | 0.031 | 0.02 | 0.011 | 0.002 | -0.007 | -0.014 |
| 0.648999999999984 | 0.105 | 0.087 | 0.071 | 0.056 | 0.043 | 0.031 | 0.021 | 0.011 | 0.002 | -0.007 | -0.014 |
| 0.649499999999984 | 0.105 | 0.087 | 0.071 | 0.057 | 0.043 | 0.032 | 0.021 | 0.011 | 0.002 | -0.006 | -0.014 |
| 0.649999999999984 | 0.105 | 0.087 | 0.071 | 0.057 | 0.044 | 0.032 | 0.021 | 0.011 | 0.002 | -0.006 | -0.014 |
| 0.650499999999984 | 0.105 | 0.087 | 0.071 | 0.057 | 0.044 | 0.032 | 0.021 | 0.011 | 0.002 | -0.006 | -0.014 |
| 0.650999999999984 | 0.106 | 0.088 | 0.071 | 0.057 | 0.044 | 0.032 | 0.021 | 0.011 | 0.002 | -0.006 | -0.014 |
| 0.651499999999984 | 0.106 | 0.088 | 0.072 | 0.057 | 0.044 | 0.032 | 0.021 | 0.011 | 0.002 | -0.006 | -0.014 |
| 0.651999999999983 | 0.106 | 0.088 | 0.072 | 0.057 | 0.044 | 0.032 | 0.021 | 0.011 | 0.002 | -0.006 | -0.014 |
| 0.652499999999983 | 0.106 | 0.088 | 0.072 | 0.057 | 0.044 | 0.032 | 0.021 | 0.011 | 0.002 | -0.006 | -0.014 |
| 0.652999999999983 | 0.106 | 0.088 | 0.072 | 0.058 | 0.044 | 0.032 | 0.021 | 0.012 | 0.003 | -0.006 | -0.013 |
| 0.653499999999983 | 0.107 | 0.088 | 0.072 | 0.058 | 0.044 | 0.032 | 0.022 | 0.012 | 0.003 | -0.006 | -0.013 |
| 0.653999999999983 | 0.107 | 0.089 | 0.072 | 0.058 | 0.045 | 0.033 | 0.022 | 0.012 | 0.003 | -0.006 | -0.013 |
| 0.654499999999983 | 0.107 | 0.089 | 0.073 | 0.058 | 0.045 | 0.033 | 0.022 | 0.012 | 0.003 | -0.006 | -0.013 |
| 0.654999999999983 | 0.107 | 0.089 | 0.073 | 0.058 | 0.045 | 0.033 | 0.022 | 0.012 | 0.003 | -0.005 | -0.013 |
| 0.655499999999983 | 0.107 | 0.089 | 0.073 | 0.058 | 0.045 | 0.033 | 0.022 | 0.012 | 0.003 | -0.005 | -0.013 |
| 0.655999999999983 | 0.107 | 0.089 | 0.073 | 0.058 | 0.045 | 0.033 | 0.022 | 0.012 | 0.003 | -0.005 | -0.013 |
| 0.656499999999983 | 0.108 | 0.089 | 0.073 | 0.059 | 0.045 | 0.033 | 0.022 | 0.012 | 0.003 | -0.005 | -0.013 |
| 0.656999999999983 | 0.108 | 0.09 | 0.073 | 0.059 | 0.045 | 0.033 | 0.022 | 0.012 | 0.003 | -0.005 | -0.013 |
| 0.657499999999983 | 0.108 | 0.09 | 0.074 | 0.059 | 0.046 | 0.034 | 0.023 | 0.013 | 0.003 | -0.005 | -0.013 |
| 0.657999999999983 | 0.108 | 0.09 | 0.074 | 0.059 | 0.046 | 0.034 | 0.023 | 0.013 | 0.004 | -0.005 | -0.013 |
| 0.658499999999983 | 0.108 | 0.09 | 0.074 | 0.059 | 0.046 | 0.034 | 0.023 | 0.013 | 0.004 | -0.005 | -0.012 |
| 0.658999999999983 | 0.109 | 0.09 | 0.074 | 0.059 | 0.046 | 0.034 | 0.023 | 0.013 | 0.004 | -0.005 | -0.012 |
| 0.659499999999983 | 0.109 | 0.091 | 0.074 | 0.059 | 0.046 | 0.034 | 0.023 | 0.013 | 0.004 | -0.005 | -0.012 |
| 0.659999999999983 | 0.109 | 0.091 | 0.074 | 0.06 | 0.046 | 0.034 | 0.023 | 0.013 | 0.004 | -0.004 | -0.012 |
| 0.660499999999983 | 0.109 | 0.091 | 0.074 | 0.06 | 0.046 | 0.034 | 0.023 | 0.013 | 0.004 | -0.004 | -0.012 |
| 0.660999999999983 | 0.109 | 0.091 | 0.075 | 0.06 | 0.047 | 0.034 | 0.023 | 0.013 | 0.004 | -0.004 | -0.012 |
| 0.661499999999982 | 0.109 | 0.091 | 0.075 | 0.06 | 0.047 | 0.035 | 0.024 | 0.014 | 0.004 | -0.004 | -0.012 |
| 0.661999999999982 | 0.11 | 0.091 | 0.075 | 0.06 | 0.047 | 0.035 | 0.024 | 0.014 | 0.004 | -0.004 | -0.012 |
| 0.662499999999982 | 0.11 | 0.092 | 0.075 | 0.06 | 0.047 | 0.035 | 0.024 | 0.014 | 0.005 | -0.004 | -0.012 |
| 0.662999999999982 | 0.11 | 0.092 | 0.075 | 0.06 | 0.047 | 0.035 | 0.024 | 0.014 | 0.005 | -0.004 | -0.012 |
| 0.663499999999982 | 0.11 | 0.092 | 0.075 | 0.061 | 0.047 | 0.035 | 0.024 | 0.014 | 0.005 | -0.004 | -0.011 |
| 0.663999999999982 | 0.11 | 0.092 | 0.076 | 0.061 | 0.047 | 0.035 | 0.024 | 0.014 | 0.005 | -0.004 | -0.011 |
| 0.664499999999982 | 0.111 | 0.092 | 0.076 | 0.061 | 0.048 | 0.035 | 0.024 | 0.014 | 0.005 | -0.003 | -0.011 |
| 0.664999999999982 | 0.111 | 0.092 | 0.076 | 0.061 | 0.048 | 0.036 | 0.024 | 0.014 | 0.005 | -0.003 | -0.011 |
| 0.665499999999982 | 0.111 | 0.093 | 0.076 | 0.061 | 0.048 | 0.036 | 0.025 | 0.014 | 0.005 | -0.003 | -0.011 |
| 0.665999999999982 | 0.111 | 0.093 | 0.076 | 0.061 | 0.048 | 0.036 | 0.025 | 0.015 | 0.005 | -0.003 | -0.011 |
| 0.666499999999982 | 0.111 | 0.093 | 0.076 | 0.062 | 0.048 | 0.036 | 0.025 | 0.015 | 0.005 | -0.003 | -0.011 |
| 0.666999999999982 | 0.112 | 0.093 | 0.077 | 0.062 | 0.048 | 0.036 | 0.025 | 0.015 | 0.006 | -0.003 | -0.011 |
| 0.667499999999982 | 0.112 | 0.093 | 0.077 | 0.062 | 0.048 | 0.036 | 0.025 | 0.015 | 0.006 | -0.003 | -0.011 |
| 0.667999999999982 | 0.112 | 0.094 | 0.077 | 0.062 | 0.049 | 0.036 | 0.025 | 0.015 | 0.006 | -0.003 | -0.011 |
| 0.668499999999982 | 0.112 | 0.094 | 0.077 | 0.062 | 0.049 | 0.036 | 0.025 | 0.015 | 0.006 | -0.003 | -0.01 |
| 0.668999999999982 | 0.112 | 0.094 | 0.077 | 0.062 | 0.049 | 0.037 | 0.025 | 0.015 | 0.006 | -0.002 | -0.01 |
| 0.669499999999982 | 0.113 | 0.094 | 0.077 | 0.063 | 0.049 | 0.037 | 0.026 | 0.015 | 0.006 | -0.002 | -0.01 |
| 0.669999999999982 | 0.113 | 0.094 | 0.078 | 0.063 | 0.049 | 0.037 | 0.026 | 0.016 | 0.006 | -0.002 | -0.01 |
| 0.670499999999981 | 0.113 | 0.094 | 0.078 | 0.063 | 0.049 | 0.037 | 0.026 | 0.016 | 0.006 | -0.002 | -0.01 |
| 0.670999999999981 | 0.113 | 0.095 | 0.078 | 0.063 | 0.049 | 0.037 | 0.026 | 0.016 | 0.007 | -0.002 | -0.01 |
| 0.671499999999981 | 0.113 | 0.095 | 0.078 | 0.063 | 0.05 | 0.037 | 0.026 | 0.016 | 0.007 | -0.002 | -0.01 |
| 0.671999999999981 | 0.114 | 0.095 | 0.078 | 0.063 | 0.05 | 0.037 | 0.026 | 0.016 | 0.007 | -0.002 | -0.01 |
| 0.672499999999981 | 0.114 | 0.095 | 0.079 | 0.064 | 0.05 | 0.038 | 0.026 | 0.016 | 0.007 | -0.002 | -0.01 |
| 0.672999999999981 | 0.114 | 0.095 | 0.079 | 0.064 | 0.05 | 0.038 | 0.027 | 0.016 | 0.007 | -0.002 | -0.009 |
| 0.673499999999981 | 0.114 | 0.096 | 0.079 | 0.064 | 0.05 | 0.038 | 0.027 | 0.016 | 0.007 | -0.001 | -0.009 |
| 0.673999999999981 | 0.114 | 0.096 | 0.079 | 0.064 | 0.05 | 0.038 | 0.027 | 0.017 | 0.007 | -0.001 | -0.009 |
| 0.674499999999981 | 0.115 | 0.096 | 0.079 | 0.064 | 0.051 | 0.038 | 0.027 | 0.017 | 0.007 | -0.001 | -0.009 |
| 0.674999999999981 | 0.115 | 0.096 | 0.079 | 0.064 | 0.051 | 0.038 | 0.027 | 0.017 | 0.007 | -0.001 | -0.009 |
| 0.675499999999981 | 0.115 | 0.096 | 0.08 | 0.064 | 0.051 | 0.038 | 0.027 | 0.017 | 0.008 | -0.001 | -0.009 |
| 0.675999999999981 | 0.115 | 0.097 | 0.08 | 0.065 | 0.051 | 0.039 | 0.027 | 0.017 | 0.008 | -0.001 | -0.009 |
| 0.676499999999981 | 0.115 | 0.097 | 0.08 | 0.065 | 0.051 | 0.039 | 0.028 | 0.017 | 0.008 | -0.001 | -0.009 |
| 0.676999999999981 | 0.116 | 0.097 | 0.08 | 0.065 | 0.051 | 0.039 | 0.028 | 0.017 | 0.008 | -0.001 | -0.009 |
| 0.677499999999981 | 0.116 | 0.097 | 0.08 | 0.065 | 0.051 | 0.039 | 0.028 | 0.018 | 0.008 | -0.001 | -0.008 |
| 0.677999999999981 | 0.116 | 0.097 | 0.08 | 0.065 | 0.052 | 0.039 | 0.028 | 0.018 | 0.008 | 0 | -0.008 |
| 0.678499999999981 | 0.116 | 0.097 | 0.081 | 0.066 | 0.052 | 0.039 | 0.028 | 0.018 | 0.008 | 0 | -0.008 |
| 0.678999999999981 | 0.116 | 0.098 | 0.081 | 0.066 | 0.052 | 0.04 | 0.028 | 0.018 | 0.008 | 0 | -0.008 |
| 0.67949999999998 | 0.117 | 0.098 | 0.081 | 0.066 | 0.052 | 0.04 | 0.028 | 0.018 | 0.009 | 0 | -0.008 |
| 0.67999999999998 | 0.117 | 0.098 | 0.081 | 0.066 | 0.052 | 0.04 | 0.029 | 0.018 | 0.009 | 0 | -0.008 |
| 0.68049999999998 | 0.117 | 0.098 | 0.081 | 0.066 | 0.052 | 0.04 | 0.029 | 0.018 | 0.009 | 0 | -0.008 |
| 0.68099999999998 | 0.117 | 0.098 | 0.082 | 0.066 | 0.053 | 0.04 | 0.029 | 0.018 | 0.009 | 0 | -0.008 |
| 0.68149999999998 | 0.118 | 0.099 | 0.082 | 0.067 | 0.053 | 0.04 | 0.029 | 0.019 | 0.009 | 0 | -0.008 |
| 0.68199999999998 | 0.118 | 0.099 | 0.082 | 0.067 | 0.053 | 0.04 | 0.029 | 0.019 | 0.009 | 0.001 | -0.007 |
| 0.68249999999998 | 0.118 | 0.099 | 0.082 | 0.067 | 0.053 | 0.041 | 0.029 | 0.019 | 0.009 | 0.001 | -0.007 |
| 0.68299999999998 | 0.118 | 0.099 | 0.082 | 0.067 | 0.053 | 0.041 | 0.029 | 0.019 | 0.01 | 0.001 | -0.007 |
| 0.68349999999998 | 0.118 | 0.099 | 0.083 | 0.067 | 0.053 | 0.041 | 0.03 | 0.019 | 0.01 | 0.001 | -0.007 |
| 0.68399999999998 | 0.119 | 0.1 | 0.083 | 0.067 | 0.054 | 0.041 | 0.03 | 0.019 | 0.01 | 0.001 | -0.007 |
| 0.68449999999998 | 0.119 | 0.1 | 0.083 | 0.068 | 0.054 | 0.041 | 0.03 | 0.019 | 0.01 | 0.001 | -0.007 |
| 0.68499999999998 | 0.119 | 0.1 | 0.083 | 0.068 | 0.054 | 0.041 | 0.03 | 0.02 | 0.01 | 0.001 | -0.007 |
| 0.68549999999998 | 0.119 | 0.1 | 0.083 | 0.068 | 0.054 | 0.042 | 0.03 | 0.02 | 0.01 | 0.001 | -0.007 |
| 0.68599999999998 | 0.119 | 0.1 | 0.083 | 0.068 | 0.054 | 0.042 | 0.03 | 0.02 | 0.01 | 0.002 | -0.006 |
| 0.68649999999998 | 0.12 | 0.101 | 0.084 | 0.068 | 0.054 | 0.042 | 0.03 | 0.02 | 0.01 | 0.002 | -0.006 |
| 0.68699999999998 | 0.12 | 0.101 | 0.084 | 0.068 | 0.055 | 0.042 | 0.031 | 0.02 | 0.011 | 0.002 | -0.006 |
| 0.68749999999998 | 0.12 | 0.101 | 0.084 | 0.069 | 0.055 | 0.042 | 0.031 | 0.02 | 0.011 | 0.002 | -0.006 |
| 0.68799999999998 | 0.12 | 0.101 | 0.084 | 0.069 | 0.055 | 0.042 | 0.031 | 0.02 | 0.011 | 0.002 | -0.006 |
| 0.688499999999979 | 0.121 | 0.101 | 0.084 | 0.069 | 0.055 | 0.043 | 0.031 | 0.021 | 0.011 | 0.002 | -0.006 |
| 0.688999999999979 | 0.121 | 0.102 | 0.085 | 0.069 | 0.055 | 0.043 | 0.031 | 0.021 | 0.011 | 0.002 | -0.006 |
| 0.689499999999979 | 0.121 | 0.102 | 0.085 | 0.069 | 0.055 | 0.043 | 0.031 | 0.021 | 0.011 | 0.003 | -0.006 |
| 0.689999999999979 | 0.121 | 0.102 | 0.085 | 0.07 | 0.056 | 0.043 | 0.032 | 0.021 | 0.011 | 0.003 | -0.005 |
| 0.690499999999979 | 0.121 | 0.102 | 0.085 | 0.07 | 0.056 | 0.043 | 0.032 | 0.021 | 0.012 | 0.003 | -0.005 |
| 0.690999999999979 | 0.122 | 0.102 | 0.085 | 0.07 | 0.056 | 0.043 | 0.032 | 0.021 | 0.012 | 0.003 | -0.005 |
| 0.691499999999979 | 0.122 | 0.103 | 0.086 | 0.07 | 0.056 | 0.043 | 0.032 | 0.021 | 0.012 | 0.003 | -0.005 |
| 0.691999999999979 | 0.122 | 0.103 | 0.086 | 0.07 | 0.056 | 0.044 | 0.032 | 0.022 | 0.012 | 0.003 | -0.005 |
| 0.692499999999979 | 0.122 | 0.103 | 0.086 | 0.07 | 0.056 | 0.044 | 0.032 | 0.022 | 0.012 | 0.003 | -0.005 |
| 0.692999999999979 | 0.122 | 0.103 | 0.086 | 0.071 | 0.057 | 0.044 | 0.032 | 0.022 | 0.012 | 0.003 | -0.005 |
| 0.693499999999979 | 0.123 | 0.104 | 0.086 | 0.071 | 0.057 | 0.044 | 0.033 | 0.022 | 0.012 | 0.004 | -0.005 |
| 0.693999999999979 | 0.123 | 0.104 | 0.087 | 0.071 | 0.057 | 0.044 | 0.033 | 0.022 | 0.013 | 0.004 | -0.004 |
| 0.694499999999979 | 0.123 | 0.104 | 0.087 | 0.071 | 0.057 | 0.044 | 0.033 | 0.022 | 0.013 | 0.004 | -0.004 |
| 0.694999999999979 | 0.123 | 0.104 | 0.087 | 0.071 | 0.057 | 0.045 | 0.033 | 0.023 | 0.013 | 0.004 | -0.004 |
| 0.695499999999979 | 0.124 | 0.104 | 0.087 | 0.072 | 0.058 | 0.045 | 0.033 | 0.023 | 0.013 | 0.004 | -0.004 |
| 0.695999999999979 | 0.124 | 0.105 | 0.087 | 0.072 | 0.058 | 0.045 | 0.033 | 0.023 | 0.013 | 0.004 | -0.004 |
| 0.696499999999979 | 0.124 | 0.105 | 0.088 | 0.072 | 0.058 | 0.045 | 0.034 | 0.023 | 0.013 | 0.004 | -0.004 |
| 0.696999999999979 | 0.124 | 0.105 | 0.088 | 0.072 | 0.058 | 0.045 | 0.034 | 0.023 | 0.013 | 0.005 | -0.004 |
| 0.697499999999978 | 0.125 | 0.105 | 0.088 | 0.072 | 0.058 | 0.045 | 0.034 | 0.023 | 0.014 | 0.005 | -0.003 |
| 0.697999999999978 | 0.125 | 0.105 | 0.088 | 0.073 | 0.058 | 0.046 | 0.034 | 0.023 | 0.014 | 0.005 | -0.003 |
| 0.698499999999978 | 0.125 | 0.106 | 0.088 | 0.073 | 0.059 | 0.046 | 0.034 | 0.024 | 0.014 | 0.005 | -0.003 |
| 0.698999999999978 | 0.125 | 0.106 | 0.089 | 0.073 | 0.059 | 0.046 | 0.034 | 0.024 | 0.014 | 0.005 | -0.003 |
| 0.699499999999978 | 0.125 | 0.106 | 0.089 | 0.073 | 0.059 | 0.046 | 0.035 | 0.024 | 0.014 | 0.005 | -0.003 |
| 0.699999999999978 | 0.126 | 0.106 | 0.089 | 0.073 | 0.059 | 0.046 | 0.035 | 0.024 | 0.014 | 0.005 | -0.003 |
| 0.700499999999978 | 0.126 | 0.107 | 0.089 | 0.073 | 0.059 | 0.047 | 0.035 | 0.024 | 0.014 | 0.006 | -0.003 |
| 0.700999999999978 | 0.126 | 0.107 | 0.089 | 0.074 | 0.06 | 0.047 | 0.035 | 0.024 | 0.015 | 0.006 | -0.003 |
| 0.701499999999978 | 0.126 | 0.107 | 0.09 | 0.074 | 0.06 | 0.047 | 0.035 | 0.025 | 0.015 | 0.006 | -0.002 |
| 0.701999999999978 | 0.127 | 0.107 | 0.09 | 0.074 | 0.06 | 0.047 | 0.035 | 0.025 | 0.015 | 0.006 | -0.002 |
| 0.702499999999978 | 0.127 | 0.107 | 0.09 | 0.074 | 0.06 | 0.047 | 0.036 | 0.025 | 0.015 | 0.006 | -0.002 |
| 0.702999999999978 | 0.127 | 0.108 | 0.09 | 0.074 | 0.06 | 0.047 | 0.036 | 0.025 | 0.015 | 0.006 | -0.002 |
| 0.703499999999978 | 0.127 | 0.108 | 0.09 | 0.075 | 0.06 | 0.048 | 0.036 | 0.025 | 0.015 | 0.006 | -0.002 |
| 0.703999999999978 | 0.128 | 0.108 | 0.091 | 0.075 | 0.061 | 0.048 | 0.036 | 0.025 | 0.016 | 0.007 | -0.002 |
| 0.704499999999978 | 0.128 | 0.108 | 0.091 | 0.075 | 0.061 | 0.048 | 0.036 | 0.026 | 0.016 | 0.007 | -0.002 |
| 0.704999999999978 | 0.128 | 0.108 | 0.091 | 0.075 | 0.061 | 0.048 | 0.036 | 0.026 | 0.016 | 0.007 | -0.001 |
| 0.705499999999978 | 0.128 | 0.109 | 0.091 | 0.075 | 0.061 | 0.048 | 0.037 | 0.026 | 0.016 | 0.007 | -0.001 |
| 0.705999999999978 | 0.128 | 0.109 | 0.091 | 0.076 | 0.061 | 0.048 | 0.037 | 0.026 | 0.016 | 0.007 | -0.001 |
| 0.706499999999978 | 0.129 | 0.109 | 0.092 | 0.076 | 0.062 | 0.049 | 0.037 | 0.026 | 0.016 | 0.007 | -0.001 |
| 0.706999999999977 | 0.129 | 0.109 | 0.092 | 0.076 | 0.062 | 0.049 | 0.037 | 0.026 | 0.016 | 0.007 | -0.001 |
| 0.707499999999977 | 0.129 | 0.11 | 0.092 | 0.076 | 0.062 | 0.049 | 0.037 | 0.026 | 0.017 | 0.008 | -0.001 |
| 0.707999999999977 | 0.129 | 0.11 | 0.092 | 0.076 | 0.062 | 0.049 | 0.037 | 0.027 | 0.017 | 0.008 | -0.001 |
| 0.708499999999977 | 0.13 | 0.11 | 0.092 | 0.077 | 0.062 | 0.049 | 0.038 | 0.027 | 0.017 | 0.008 | 0 |
| 0.708999999999977 | 0.13 | 0.11 | 0.093 | 0.077 | 0.063 | 0.05 | 0.038 | 0.027 | 0.017 | 0.008 | 0 |
| 0.709499999999977 | 0.13 | 0.111 | 0.093 | 0.077 | 0.063 | 0.05 | 0.038 | 0.027 | 0.017 | 0.008 | 0 |
| 0.709999999999977 | 0.13 | 0.111 | 0.093 | 0.077 | 0.063 | 0.05 | 0.038 | 0.027 | 0.017 | 0.008 | 0 |
| 0.710499999999977 | 0.131 | 0.111 | 0.093 | 0.077 | 0.063 | 0.05 | 0.038 | 0.027 | 0.018 | 0.009 | 0 |
| 0.710999999999977 | 0.131 | 0.111 | 0.094 | 0.078 | 0.063 | 0.05 | 0.038 | 0.028 | 0.018 | 0.009 | 0 |
| 0.711499999999977 | 0.131 | 0.111 | 0.094 | 0.078 | 0.064 | 0.05 | 0.039 | 0.028 | 0.018 | 0.009 | 0.001 |
| 0.711999999999977 | 0.131 | 0.112 | 0.094 | 0.078 | 0.064 | 0.051 | 0.039 | 0.028 | 0.018 | 0.009 | 0.001 |
| 0.712499999999977 | 0.132 | 0.112 | 0.094 | 0.078 | 0.064 | 0.051 | 0.039 | 0.028 | 0.018 | 0.009 | 0.001 |
| 0.712999999999977 | 0.132 | 0.112 | 0.094 | 0.079 | 0.064 | 0.051 | 0.039 | 0.028 | 0.018 | 0.009 | 0.001 |
| 0.713499999999977 | 0.132 | 0.112 | 0.095 | 0.079 | 0.064 | 0.051 | 0.039 | 0.029 | 0.019 | 0.01 | 0.001 |
| 0.713999999999977 | 0.132 | 0.113 | 0.095 | 0.079 | 0.065 | 0.051 | 0.04 | 0.029 | 0.019 | 0.01 | 0.001 |
| 0.714499999999977 | 0.133 | 0.113 | 0.095 | 0.079 | 0.065 | 0.052 | 0.04 | 0.029 | 0.019 | 0.01 | 0.001 |
| 0.714999999999977 | 0.133 | 0.113 | 0.095 | 0.079 | 0.065 | 0.052 | 0.04 | 0.029 | 0.019 | 0.01 | 0.002 |
| 0.715499999999977 | 0.133 | 0.113 | 0.096 | 0.08 | 0.065 | 0.052 | 0.04 | 0.029 | 0.019 | 0.01 | 0.002 |
| 0.715999999999976 | 0.133 | 0.114 | 0.096 | 0.08 | 0.065 | 0.052 | 0.04 | 0.029 | 0.019 | 0.01 | 0.002 |
| 0.716499999999976 | 0.134 | 0.114 | 0.096 | 0.08 | 0.066 | 0.052 | 0.04 | 0.03 | 0.02 | 0.01 | 0.002 |
| 0.716999999999976 | 0.134 | 0.114 | 0.096 | 0.08 | 0.066 | 0.053 | 0.041 | 0.03 | 0.02 | 0.011 | 0.002 |
| 0.717499999999976 | 0.134 | 0.114 | 0.096 | 0.08 | 0.066 | 0.053 | 0.041 | 0.03 | 0.02 | 0.011 | 0.002 |
| 0.717999999999976 | 0.134 | 0.114 | 0.097 | 0.081 | 0.066 | 0.053 | 0.041 | 0.03 | 0.02 | 0.011 | 0.003 |
| 0.718499999999976 | 0.135 | 0.115 | 0.097 | 0.081 | 0.066 | 0.053 | 0.041 | 0.03 | 0.02 | 0.011 | 0.003 |
| 0.718999999999976 | 0.135 | 0.115 | 0.097 | 0.081 | 0.067 | 0.053 | 0.041 | 0.03 | 0.02 | 0.011 | 0.003 |
| 0.719499999999976 | 0.135 | 0.115 | 0.097 | 0.081 | 0.067 | 0.054 | 0.042 | 0.031 | 0.021 | 0.011 | 0.003 |
| 0.719999999999976 | 0.135 | 0.115 | 0.098 | 0.081 | 0.067 | 0.054 | 0.042 | 0.031 | 0.021 | 0.012 | 0.003 |
| 0.720499999999976 | 0.136 | 0.116 | 0.098 | 0.082 | 0.067 | 0.054 | 0.042 | 0.031 | 0.021 | 0.012 | 0.003 |
| 0.720999999999976 | 0.136 | 0.116 | 0.098 | 0.082 | 0.067 | 0.054 | 0.042 | 0.031 | 0.021 | 0.012 | 0.004 |
| 0.721499999999976 | 0.136 | 0.116 | 0.098 | 0.082 | 0.068 | 0.054 | 0.042 | 0.031 | 0.021 | 0.012 | 0.004 |
| 0.721999999999976 | 0.136 | 0.116 | 0.098 | 0.082 | 0.068 | 0.055 | 0.043 | 0.032 | 0.022 | 0.012 | 0.004 |
| 0.722499999999976 | 0.137 | 0.117 | 0.099 | 0.083 | 0.068 | 0.055 | 0.043 | 0.032 | 0.022 | 0.012 | 0.004 |
| 0.722999999999976 | 0.137 | 0.117 | 0.099 | 0.083 | 0.068 | 0.055 | 0.043 | 0.032 | 0.022 | 0.013 | 0.004 |
| 0.723499999999976 | 0.137 | 0.117 | 0.099 | 0.083 | 0.068 | 0.055 | 0.043 | 0.032 | 0.022 | 0.013 | 0.004 |
| 0.723999999999976 | 0.137 | 0.117 | 0.099 | 0.083 | 0.069 | 0.055 | 0.043 | 0.032 | 0.022 | 0.013 | 0.005 |
| 0.724499999999976 | 0.138 | 0.118 | 0.1 | 0.083 | 0.069 | 0.056 | 0.043 | 0.032 | 0.022 | 0.013 | 0.005 |
| 0.724999999999975 | 0.138 | 0.118 | 0.1 | 0.084 | 0.069 | 0.056 | 0.044 | 0.033 | 0.023 | 0.013 | 0.005 |
| 0.725499999999975 | 0.138 | 0.118 | 0.1 | 0.084 | 0.069 | 0.056 | 0.044 | 0.033 | 0.023 | 0.014 | 0.005 |
| 0.725999999999975 | 0.138 | 0.118 | 0.1 | 0.084 | 0.069 | 0.056 | 0.044 | 0.033 | 0.023 | 0.014 | 0.005 |
| 0.726499999999975 | 0.139 | 0.119 | 0.101 | 0.084 | 0.07 | 0.056 | 0.044 | 0.033 | 0.023 | 0.014 | 0.005 |
| 0.726999999999975 | 0.139 | 0.119 | 0.101 | 0.085 | 0.07 | 0.057 | 0.044 | 0.033 | 0.023 | 0.014 | 0.006 |
| 0.727499999999975 | 0.139 | 0.119 | 0.101 | 0.085 | 0.07 | 0.057 | 0.045 | 0.034 | 0.023 | 0.014 | 0.006 |
| 0.727999999999975 | 0.139 | 0.119 | 0.101 | 0.085 | 0.07 | 0.057 | 0.045 | 0.034 | 0.024 | 0.014 | 0.006 |
| 0.728499999999975 | 0.14 | 0.12 | 0.101 | 0.085 | 0.07 | 0.057 | 0.045 | 0.034 | 0.024 | 0.015 | 0.006 |
| 0.728999999999975 | 0.14 | 0.12 | 0.102 | 0.085 | 0.071 | 0.057 | 0.045 | 0.034 | 0.024 | 0.015 | 0.006 |
| 0.729499999999975 | 0.14 | 0.12 | 0.102 | 0.086 | 0.071 | 0.058 | 0.045 | 0.034 | 0.024 | 0.015 | 0.006 |
| 0.729999999999975 | 0.14 | 0.12 | 0.102 | 0.086 | 0.071 | 0.058 | 0.046 | 0.035 | 0.024 | 0.015 | 0.007 |
| 0.730499999999975 | 0.141 | 0.121 | 0.102 | 0.086 | 0.071 | 0.058 | 0.046 | 0.035 | 0.025 | 0.015 | 0.007 |
| 0.730999999999975 | 0.141 | 0.121 | 0.103 | 0.086 | 0.072 | 0.058 | 0.046 | 0.035 | 0.025 | 0.015 | 0.007 |
| 0.731499999999975 | 0.141 | 0.121 | 0.103 | 0.087 | 0.072 | 0.058 | 0.046 | 0.035 | 0.025 | 0.016 | 0.007 |
| 0.731999999999975 | 0.142 | 0.121 | 0.103 | 0.087 | 0.072 | 0.059 | 0.046 | 0.035 | 0.025 | 0.016 | 0.007 |
| 0.732499999999975 | 0.142 | 0.122 | 0.103 | 0.087 | 0.072 | 0.059 | 0.047 | 0.035 | 0.025 | 0.016 | 0.007 |
| 0.732999999999975 | 0.142 | 0.122 | 0.104 | 0.087 | 0.072 | 0.059 | 0.047 | 0.036 | 0.026 | 0.016 | 0.008 |
| 0.733499999999975 | 0.142 | 0.122 | 0.104 | 0.087 | 0.073 | 0.059 | 0.047 | 0.036 | 0.026 | 0.016 | 0.008 |
| 0.733999999999974 | 0.143 | 0.122 | 0.104 | 0.088 | 0.073 | 0.059 | 0.047 | 0.036 | 0.026 | 0.017 | 0.008 |
| 0.734499999999974 | 0.143 | 0.123 | 0.104 | 0.088 | 0.073 | 0.06 | 0.047 | 0.036 | 0.026 | 0.017 | 0.008 |
| 0.734999999999974 | 0.143 | 0.123 | 0.105 | 0.088 | 0.073 | 0.06 | 0.048 | 0.036 | 0.026 | 0.017 | 0.008 |
| 0.735499999999974 | 0.143 | 0.123 | 0.105 | 0.088 | 0.074 | 0.06 | 0.048 | 0.037 | 0.026 | 0.017 | 0.008 |
| 0.735999999999974 | 0.144 | 0.123 | 0.105 | 0.089 | 0.074 | 0.06 | 0.048 | 0.037 | 0.027 | 0.017 | 0.009 |
| 0.736499999999974 | 0.144 | 0.124 | 0.105 | 0.089 | 0.074 | 0.061 | 0.048 | 0.037 | 0.027 | 0.017 | 0.009 |
| 0.736999999999974 | 0.144 | 0.124 | 0.106 | 0.089 | 0.074 | 0.061 | 0.048 | 0.037 | 0.027 | 0.018 | 0.009 |
| 0.737499999999974 | 0.145 | 0.124 | 0.106 | 0.089 | 0.074 | 0.061 | 0.049 | 0.037 | 0.027 | 0.018 | 0.009 |
| 0.737999999999974 | 0.145 | 0.124 | 0.106 | 0.09 | 0.075 | 0.061 | 0.049 | 0.038 | 0.027 | 0.018 | 0.009 |
| 0.738499999999974 | 0.145 | 0.125 | 0.106 | 0.09 | 0.075 | 0.061 | 0.049 | 0.038 | 0.028 | 0.018 | 0.01 |
| 0.738999999999974 | 0.145 | 0.125 | 0.107 | 0.09 | 0.075 | 0.062 | 0.049 | 0.038 | 0.028 | 0.018 | 0.01 |
| 0.739499999999974 | 0.146 | 0.125 | 0.107 | 0.09 | 0.075 | 0.062 | 0.05 | 0.038 | 0.028 | 0.019 | 0.01 |
| 0.739999999999974 | 0.146 | 0.125 | 0.107 | 0.091 | 0.076 | 0.062 | 0.05 | 0.038 | 0.028 | 0.019 | 0.01 |
| 0.740499999999974 | 0.146 | 0.126 | 0.107 | 0.091 | 0.076 | 0.062 | 0.05 | 0.039 | 0.028 | 0.019 | 0.01 |
| 0.740999999999974 | 0.146 | 0.126 | 0.108 | 0.091 | 0.076 | 0.062 | 0.05 | 0.039 | 0.029 | 0.019 | 0.01 |
| 0.741499999999974 | 0.147 | 0.126 | 0.108 | 0.091 | 0.076 | 0.063 | 0.05 | 0.039 | 0.029 | 0.019 | 0.011 |
| 0.741999999999974 | 0.147 | 0.126 | 0.108 | 0.092 | 0.077 | 0.063 | 0.051 | 0.039 | 0.029 | 0.02 | 0.011 |
| 0.742499999999974 | 0.147 | 0.127 | 0.108 | 0.092 | 0.077 | 0.063 | 0.051 | 0.04 | 0.029 | 0.02 | 0.011 |
| 0.742999999999973 | 0.148 | 0.127 | 0.109 | 0.092 | 0.077 | 0.063 | 0.051 | 0.04 | 0.029 | 0.02 | 0.011 |
| 0.743499999999973 | 0.148 | 0.127 | 0.109 | 0.092 | 0.077 | 0.064 | 0.051 | 0.04 | 0.03 | 0.02 | 0.011 |
| 0.743999999999973 | 0.148 | 0.128 | 0.109 | 0.092 | 0.077 | 0.064 | 0.051 | 0.04 | 0.03 | 0.02 | 0.012 |
| 0.744499999999973 | 0.148 | 0.128 | 0.109 | 0.093 | 0.078 | 0.064 | 0.052 | 0.04 | 0.03 | 0.021 | 0.012 |
| 0.744999999999973 | 0.149 | 0.128 | 0.11 | 0.093 | 0.078 | 0.064 | 0.052 | 0.041 | 0.03 | 0.021 | 0.012 |
| 0.745499999999973 | 0.149 | 0.128 | 0.11 | 0.093 | 0.078 | 0.065 | 0.052 | 0.041 | 0.03 | 0.021 | 0.012 |
| 0.745999999999973 | 0.149 | 0.129 | 0.11 | 0.093 | 0.078 | 0.065 | 0.052 | 0.041 | 0.031 | 0.021 | 0.012 |
| 0.746499999999973 | 0.15 | 0.129 | 0.11 | 0.094 | 0.079 | 0.065 | 0.053 | 0.041 | 0.031 | 0.021 | 0.013 |
| 0.746999999999973 | 0.15 | 0.129 | 0.111 | 0.094 | 0.079 | 0.065 | 0.053 | 0.041 | 0.031 | 0.022 | 0.013 |
| 0.747499999999973 | 0.15 | 0.129 | 0.111 | 0.094 | 0.079 | 0.065 | 0.053 | 0.042 | 0.031 | 0.022 | 0.013 |
| 0.747999999999973 | 0.15 | 0.13 | 0.111 | 0.094 | 0.079 | 0.066 | 0.053 | 0.042 | 0.031 | 0.022 | 0.013 |
| 0.748499999999973 | 0.151 | 0.13 | 0.111 | 0.095 | 0.08 | 0.066 | 0.053 | 0.042 | 0.032 | 0.022 | 0.013 |
| 0.748999999999973 | 0.151 | 0.13 | 0.112 | 0.095 | 0.08 | 0.066 | 0.054 | 0.042 | 0.032 | 0.022 | 0.014 |
| 0.749499999999973 | 0.151 | 0.131 | 0.112 | 0.095 | 0.08 | 0.066 | 0.054 | 0.042 | 0.032 | 0.023 | 0.014 |
| 0.749999999999973 | 0.152 | 0.131 | 0.112 | 0.095 | 0.08 | 0.067 | 0.054 | 0.043 | 0.032 | 0.023 | 0.014 |
| 0.750499999999973 | 0.152 | 0.131 | 0.112 | 0.096 | 0.081 | 0.067 | 0.054 | 0.043 | 0.032 | 0.023 | 0.014 |
| 0.750999999999973 | 0.152 | 0.131 | 0.113 | 0.096 | 0.081 | 0.067 | 0.055 | 0.043 | 0.033 | 0.023 | 0.014 |
| 0.751499999999973 | 0.152 | 0.132 | 0.113 | 0.096 | 0.081 | 0.067 | 0.055 | 0.043 | 0.033 | 0.023 | 0.015 |
| 0.751999999999973 | 0.153 | 0.132 | 0.113 | 0.096 | 0.081 | 0.068 | 0.055 | 0.044 | 0.033 | 0.024 | 0.015 |
| 0.752499999999972 | 0.153 | 0.132 | 0.114 | 0.097 | 0.082 | 0.068 | 0.055 | 0.044 | 0.033 | 0.024 | 0.015 |
| 0.752999999999972 | 0.153 | 0.132 | 0.114 | 0.097 | 0.082 | 0.068 | 0.055 | 0.044 | 0.034 | 0.024 | 0.015 |
| 0.753499999999972 | 0.154 | 0.133 | 0.114 | 0.097 | 0.082 | 0.068 | 0.056 | 0.044 | 0.034 | 0.024 | 0.015 |
| 0.753999999999972 | 0.154 | 0.133 | 0.114 | 0.097 | 0.082 | 0.068 | 0.056 | 0.044 | 0.034 | 0.024 | 0.016 |
| 0.754499999999972 | 0.154 | 0.133 | 0.115 | 0.098 | 0.083 | 0.069 | 0.056 | 0.045 | 0.034 | 0.025 | 0.016 |
| 0.754999999999972 | 0.154 | 0.134 | 0.115 | 0.098 | 0.083 | 0.069 | 0.056 | 0.045 | 0.034 | 0.025 | 0.016 |
| 0.755499999999972 | 0.155 | 0.134 | 0.115 | 0.098 | 0.083 | 0.069 | 0.057 | 0.045 | 0.035 | 0.025 | 0.016 |
| 0.755999999999972 | 0.155 | 0.134 | 0.115 | 0.099 | 0.083 | 0.069 | 0.057 | 0.045 | 0.035 | 0.025 | 0.016 |
| 0.756499999999972 | 0.155 | 0.134 | 0.116 | 0.099 | 0.084 | 0.07 | 0.057 | 0.046 | 0.035 | 0.025 | 0.017 |
| 0.756999999999972 | 0.156 | 0.135 | 0.116 | 0.099 | 0.084 | 0.07 | 0.057 | 0.046 | 0.035 | 0.026 | 0.017 |
| 0.757499999999972 | 0.156 | 0.135 | 0.116 | 0.099 | 0.084 | 0.07 | 0.058 | 0.046 | 0.035 | 0.026 | 0.017 |
| 0.757999999999972 | 0.156 | 0.135 | 0.116 | 0.1 | 0.084 | 0.07 | 0.058 | 0.046 | 0.036 | 0.026 | 0.017 |
| 0.758499999999972 | 0.157 | 0.136 | 0.117 | 0.1 | 0.085 | 0.071 | 0.058 | 0.046 | 0.036 | 0.026 | 0.017 |
| 0.758999999999972 | 0.157 | 0.136 | 0.117 | 0.1 | 0.085 | 0.071 | 0.058 | 0.047 | 0.036 | 0.026 | 0.018 |
| 0.759499999999972 | 0.157 | 0.136 | 0.117 | 0.1 | 0.085 | 0.071 | 0.058 | 0.047 | 0.036 | 0.027 | 0.018 |
| 0.759999999999972 | 0.157 | 0.136 | 0.118 | 0.101 | 0.085 | 0.071 | 0.059 | 0.047 | 0.037 | 0.027 | 0.018 |
| 0.760499999999972 | 0.158 | 0.137 | 0.118 | 0.101 | 0.086 | 0.072 | 0.059 | 0.047 | 0.037 | 0.027 | 0.018 |
| 0.760999999999972 | 0.158 | 0.137 | 0.118 | 0.101 | 0.086 | 0.072 | 0.059 | 0.048 | 0.037 | 0.027 | 0.018 |
| 0.761499999999971 | 0.158 | 0.137 | 0.118 | 0.101 | 0.086 | 0.072 | 0.059 | 0.048 | 0.037 | 0.028 | 0.019 |
| 0.761999999999971 | 0.159 | 0.138 | 0.119 | 0.102 | 0.086 | 0.072 | 0.06 | 0.048 | 0.037 | 0.028 | 0.019 |
| 0.762499999999971 | 0.159 | 0.138 | 0.119 | 0.102 | 0.087 | 0.073 | 0.06 | 0.048 | 0.038 | 0.028 | 0.019 |
| 0.762999999999971 | 0.159 | 0.138 | 0.119 | 0.102 | 0.087 | 0.073 | 0.06 | 0.049 | 0.038 | 0.028 | 0.019 |
| 0.763499999999971 | 0.16 | 0.138 | 0.12 | 0.102 | 0.087 | 0.073 | 0.06 | 0.049 | 0.038 | 0.028 | 0.019 |
| 0.763999999999971 | 0.16 | 0.139 | 0.12 | 0.103 | 0.087 | 0.073 | 0.061 | 0.049 | 0.038 | 0.029 | 0.02 |
| 0.764499999999971 | 0.16 | 0.139 | 0.12 | 0.103 | 0.088 | 0.074 | 0.061 | 0.049 | 0.039 | 0.029 | 0.02 |
| 0.764999999999971 | 0.161 | 0.139 | 0.12 | 0.103 | 0.088 | 0.074 | 0.061 | 0.049 | 0.039 | 0.029 | 0.02 |
| 0.765499999999971 | 0.161 | 0.14 | 0.121 | 0.104 | 0.088 | 0.074 | 0.061 | 0.05 | 0.039 | 0.029 | 0.02 |
| 0.765999999999971 | 0.161 | 0.14 | 0.121 | 0.104 | 0.088 | 0.074 | 0.062 | 0.05 | 0.039 | 0.03 | 0.021 |
| 0.766499999999971 | 0.161 | 0.14 | 0.121 | 0.104 | 0.089 | 0.075 | 0.062 | 0.05 | 0.04 | 0.03 | 0.021 |
| 0.766999999999971 | 0.162 | 0.141 | 0.122 | 0.104 | 0.089 | 0.075 | 0.062 | 0.05 | 0.04 | 0.03 | 0.021 |
| 0.767499999999971 | 0.162 | 0.141 | 0.122 | 0.105 | 0.089 | 0.075 | 0.062 | 0.051 | 0.04 | 0.03 | 0.021 |
| 0.767999999999971 | 0.162 | 0.141 | 0.122 | 0.105 | 0.089 | 0.075 | 0.063 | 0.051 | 0.04 | 0.03 | 0.021 |
| 0.768499999999971 | 0.163 | 0.141 | 0.122 | 0.105 | 0.09 | 0.076 | 0.063 | 0.051 | 0.04 | 0.031 | 0.022 |
| 0.768999999999971 | 0.163 | 0.142 | 0.123 | 0.105 | 0.09 | 0.076 | 0.063 | 0.051 | 0.041 | 0.031 | 0.022 |
| 0.769499999999971 | 0.163 | 0.142 | 0.123 | 0.106 | 0.09 | 0.076 | 0.063 | 0.052 | 0.041 | 0.031 | 0.022 |
| 0.769999999999971 | 0.164 | 0.142 | 0.123 | 0.106 | 0.09 | 0.076 | 0.064 | 0.052 | 0.041 | 0.031 | 0.022 |
| 0.77049999999997 | 0.164 | 0.143 | 0.124 | 0.106 | 0.091 | 0.077 | 0.064 | 0.052 | 0.041 | 0.032 | 0.023 |
| 0.77099999999997 | 0.164 | 0.143 | 0.124 | 0.107 | 0.091 | 0.077 | 0.064 | 0.052 | 0.042 | 0.032 | 0.023 |
| 0.77149999999997 | 0.165 | 0.143 | 0.124 | 0.107 | 0.091 | 0.077 | 0.064 | 0.053 | 0.042 | 0.032 | 0.023 |
| 0.77199999999997 | 0.165 | 0.144 | 0.124 | 0.107 | 0.092 | 0.077 | 0.065 | 0.053 | 0.042 | 0.032 | 0.023 |
| 0.77249999999997 | 0.165 | 0.144 | 0.125 | 0.107 | 0.092 | 0.078 | 0.065 | 0.053 | 0.042 | 0.032 | 0.023 |
| 0.77299999999997 | 0.166 | 0.144 | 0.125 | 0.108 | 0.092 | 0.078 | 0.065 | 0.053 | 0.043 | 0.033 | 0.024 |
| 0.77349999999997 | 0.166 | 0.144 | 0.125 | 0.108 | 0.092 | 0.078 | 0.065 | 0.054 | 0.043 | 0.033 | 0.024 |
| 0.77399999999997 | 0.166 | 0.145 | 0.126 | 0.108 | 0.093 | 0.078 | 0.066 | 0.054 | 0.043 | 0.033 | 0.024 |
| 0.77449999999997 | 0.166 | 0.145 | 0.126 | 0.109 | 0.093 | 0.079 | 0.066 | 0.054 | 0.043 | 0.033 | 0.024 |
| 0.77499999999997 | 0.167 | 0.145 | 0.126 | 0.109 | 0.093 | 0.079 | 0.066 | 0.054 | 0.044 | 0.034 | 0.025 |
| 0.77549999999997 | 0.167 | 0.146 | 0.126 | 0.109 | 0.093 | 0.079 | 0.066 | 0.055 | 0.044 | 0.034 | 0.025 |
| 0.77599999999997 | 0.167 | 0.146 | 0.127 | 0.109 | 0.094 | 0.08 | 0.067 | 0.055 | 0.044 | 0.034 | 0.025 |
| 0.77649999999997 | 0.168 | 0.146 | 0.127 | 0.11 | 0.094 | 0.08 | 0.067 | 0.055 | 0.044 | 0.034 | 0.025 |
| 0.77699999999997 | 0.168 | 0.147 | 0.127 | 0.11 | 0.094 | 0.08 | 0.067 | 0.055 | 0.045 | 0.035 | 0.025 |
| 0.77749999999997 | 0.168 | 0.147 | 0.128 | 0.11 | 0.095 | 0.08 | 0.067 | 0.056 | 0.045 | 0.035 | 0.026 |
| 0.77799999999997 | 0.169 | 0.147 | 0.128 | 0.111 | 0.095 | 0.081 | 0.068 | 0.056 | 0.045 | 0.035 | 0.026 |
| 0.77849999999997 | 0.169 | 0.148 | 0.128 | 0.111 | 0.095 | 0.081 | 0.068 | 0.056 | 0.045 | 0.035 | 0.026 |
| 0.77899999999997 | 0.169 | 0.148 | 0.129 | 0.111 | 0.095 | 0.081 | 0.068 | 0.056 | 0.045 | 0.036 | 0.026 |
| 0.779499999999969 | 0.17 | 0.148 | 0.129 | 0.111 | 0.096 | 0.081 | 0.068 | 0.057 | 0.046 | 0.036 | 0.027 |
| 0.779999999999969 | 0.17 | 0.148 | 0.129 | 0.112 | 0.096 | 0.082 | 0.069 | 0.057 | 0.046 | 0.036 | 0.027 |
| 0.780499999999969 | 0.17 | 0.149 | 0.129 | 0.112 | 0.096 | 0.082 | 0.069 | 0.057 | 0.046 | 0.036 | 0.027 |
| 0.780999999999969 | 0.171 | 0.149 | 0.13 | 0.112 | 0.097 | 0.082 | 0.069 | 0.057 | 0.046 | 0.037 | 0.027 |
| 0.781499999999969 | 0.171 | 0.149 | 0.13 | 0.113 | 0.097 | 0.082 | 0.069 | 0.058 | 0.047 | 0.037 | 0.028 |
| 0.781999999999969 | 0.171 | 0.15 | 0.13 | 0.113 | 0.097 | 0.083 | 0.07 | 0.058 | 0.047 | 0.037 | 0.028 |
| 0.782499999999969 | 0.172 | 0.15 | 0.131 | 0.113 | 0.097 | 0.083 | 0.07 | 0.058 | 0.047 | 0.037 | 0.028 |
| 0.782999999999969 | 0.172 | 0.15 | 0.131 | 0.113 | 0.098 | 0.083 | 0.07 | 0.058 | 0.047 | 0.037 | 0.028 |
| 0.783499999999969 | 0.172 | 0.151 | 0.131 | 0.114 | 0.098 | 0.084 | 0.071 | 0.059 | 0.048 | 0.038 | 0.029 |
| 0.783999999999969 | 0.173 | 0.151 | 0.132 | 0.114 | 0.098 | 0.084 | 0.071 | 0.059 | 0.048 | 0.038 | 0.029 |
| 0.784499999999969 | 0.173 | 0.151 | 0.132 | 0.114 | 0.098 | 0.084 | 0.071 | 0.059 | 0.048 | 0.038 | 0.029 |
| 0.784999999999969 | 0.173 | 0.152 | 0.132 | 0.115 | 0.099 | 0.084 | 0.071 | 0.059 | 0.048 | 0.038 | 0.029 |
| 0.785499999999969 | 0.174 | 0.152 | 0.132 | 0.115 | 0.099 | 0.085 | 0.072 | 0.06 | 0.049 | 0.039 | 0.03 |
| 0.785999999999969 | 0.174 | 0.152 | 0.133 | 0.115 | 0.099 | 0.085 | 0.072 | 0.06 | 0.049 | 0.039 | 0.03 |
| 0.786499999999969 | 0.174 | 0.153 | 0.133 | 0.116 | 0.1 | 0.085 | 0.072 | 0.06 | 0.049 | 0.039 | 0.03 |
| 0.786999999999969 | 0.175 | 0.153 | 0.133 | 0.116 | 0.1 | 0.086 | 0.072 | 0.06 | 0.05 | 0.039 | 0.03 |
| 0.787499999999969 | 0.175 | 0.153 | 0.134 | 0.116 | 0.1 | 0.086 | 0.073 | 0.061 | 0.05 | 0.04 | 0.031 |
| 0.787999999999969 | 0.175 | 0.154 | 0.134 | 0.116 | 0.101 | 0.086 | 0.073 | 0.061 | 0.05 | 0.04 | 0.031 |
| 0.788499999999968 | 0.176 | 0.154 | 0.134 | 0.117 | 0.101 | 0.086 | 0.073 | 0.061 | 0.05 | 0.04 | 0.031 |
| 0.788999999999968 | 0.176 | 0.154 | 0.135 | 0.117 | 0.101 | 0.087 | 0.074 | 0.062 | 0.051 | 0.04 | 0.031 |
| 0.789499999999968 | 0.176 | 0.155 | 0.135 | 0.117 | 0.101 | 0.087 | 0.074 | 0.062 | 0.051 | 0.041 | 0.032 |
| 0.789999999999968 | 0.177 | 0.155 | 0.135 | 0.118 | 0.102 | 0.087 | 0.074 | 0.062 | 0.051 | 0.041 | 0.032 |
| 0.790499999999968 | 0.177 | 0.155 | 0.136 | 0.118 | 0.102 | 0.088 | 0.074 | 0.062 | 0.051 | 0.041 | 0.032 |
| 0.790999999999968 | 0.177 | 0.156 | 0.136 | 0.118 | 0.102 | 0.088 | 0.075 | 0.063 | 0.052 | 0.042 | 0.032 |
| 0.791499999999968 | 0.178 | 0.156 | 0.136 | 0.119 | 0.103 | 0.088 | 0.075 | 0.063 | 0.052 | 0.042 | 0.033 |
| 0.791999999999968 | 0.178 | 0.156 | 0.137 | 0.119 | 0.103 | 0.088 | 0.075 | 0.063 | 0.052 | 0.042 | 0.033 |
| 0.792499999999968 | 0.178 | 0.157 | 0.137 | 0.119 | 0.103 | 0.089 | 0.075 | 0.063 | 0.052 | 0.042 | 0.033 |
| 0.792999999999968 | 0.179 | 0.157 | 0.137 | 0.119 | 0.103 | 0.089 | 0.076 | 0.064 | 0.053 | 0.043 | 0.033 |
| 0.793499999999968 | 0.179 | 0.157 | 0.138 | 0.12 | 0.104 | 0.089 | 0.076 | 0.064 | 0.053 | 0.043 | 0.034 |
| 0.793999999999968 | 0.18 | 0.158 | 0.138 | 0.12 | 0.104 | 0.09 | 0.076 | 0.064 | 0.053 | 0.043 | 0.034 |
| 0.794499999999968 | 0.18 | 0.158 | 0.138 | 0.12 | 0.104 | 0.09 | 0.077 | 0.065 | 0.053 | 0.043 | 0.034 |
| 0.794999999999968 | 0.18 | 0.158 | 0.138 | 0.121 | 0.105 | 0.09 | 0.077 | 0.065 | 0.054 | 0.044 | 0.034 |
| 0.795499999999968 | 0.181 | 0.159 | 0.139 | 0.121 | 0.105 | 0.09 | 0.077 | 0.065 | 0.054 | 0.044 | 0.035 |
| 0.795999999999968 | 0.181 | 0.159 | 0.139 | 0.121 | 0.105 | 0.091 | 0.077 | 0.065 | 0.054 | 0.044 | 0.035 |
| 0.796499999999968 | 0.181 | 0.159 | 0.139 | 0.122 | 0.106 | 0.091 | 0.078 | 0.066 | 0.055 | 0.044 | 0.035 |
| 0.796999999999968 | 0.182 | 0.16 | 0.14 | 0.122 | 0.106 | 0.091 | 0.078 | 0.066 | 0.055 | 0.045 | 0.035 |
| 0.797499999999967 | 0.182 | 0.16 | 0.14 | 0.122 | 0.106 | 0.092 | 0.078 | 0.066 | 0.055 | 0.045 | 0.036 |
| 0.797999999999967 | 0.182 | 0.16 | 0.14 | 0.123 | 0.106 | 0.092 | 0.079 | 0.066 | 0.055 | 0.045 | 0.036 |
| 0.798499999999967 | 0.183 | 0.161 | 0.141 | 0.123 | 0.107 | 0.092 | 0.079 | 0.067 | 0.056 | 0.045 | 0.036 |
| 0.798999999999967 | 0.183 | 0.161 | 0.141 | 0.123 | 0.107 | 0.092 | 0.079 | 0.067 | 0.056 | 0.046 | 0.036 |
| 0.799499999999967 | 0.183 | 0.161 | 0.141 | 0.124 | 0.107 | 0.093 | 0.079 | 0.067 | 0.056 | 0.046 | 0.037 |
| 0.799999999999967 | 0.184 | 0.162 | 0.142 | 0.124 | 0.108 | 0.093 | 0.08 | 0.068 | 0.056 | 0.046 | 0.037 |
| 0.800499999999967 | 0.184 | 0.162 | 0.142 | 0.124 | 0.108 | 0.093 | 0.08 | 0.068 | 0.057 | 0.047 | 0.037 |
| 0.800999999999967 | 0.184 | 0.162 | 0.142 | 0.124 | 0.108 | 0.094 | 0.08 | 0.068 | 0.057 | 0.047 | 0.037 |
| 0.801499999999967 | 0.185 | 0.163 | 0.143 | 0.125 | 0.109 | 0.094 | 0.081 | 0.068 | 0.057 | 0.047 | 0.038 |
| 0.801999999999967 | 0.185 | 0.163 | 0.143 | 0.125 | 0.109 | 0.094 | 0.081 | 0.069 | 0.058 | 0.047 | 0.038 |
| 0.802499999999967 | 0.186 | 0.163 | 0.143 | 0.125 | 0.109 | 0.095 | 0.081 | 0.069 | 0.058 | 0.048 | 0.038 |
| 0.802999999999967 | 0.186 | 0.164 | 0.144 | 0.126 | 0.11 | 0.095 | 0.081 | 0.069 | 0.058 | 0.048 | 0.038 |
| 0.803499999999967 | 0.186 | 0.164 | 0.144 | 0.126 | 0.11 | 0.095 | 0.082 | 0.07 | 0.058 | 0.048 | 0.039 |
| 0.803999999999967 | 0.187 | 0.164 | 0.144 | 0.126 | 0.11 | 0.095 | 0.082 | 0.07 | 0.059 | 0.048 | 0.039 |
| 0.804499999999967 | 0.187 | 0.165 | 0.145 | 0.127 | 0.111 | 0.096 | 0.082 | 0.07 | 0.059 | 0.049 | 0.039 |
| 0.804999999999967 | 0.187 | 0.165 | 0.145 | 0.127 | 0.111 | 0.096 | 0.083 | 0.07 | 0.059 | 0.049 | 0.04 |
| 0.805499999999967 | 0.188 | 0.165 | 0.145 | 0.127 | 0.111 | 0.096 | 0.083 | 0.071 | 0.06 | 0.049 | 0.04 |
| 0.805999999999967 | 0.188 | 0.166 | 0.146 | 0.128 | 0.111 | 0.097 | 0.083 | 0.071 | 0.06 | 0.05 | 0.04 |
| 0.806499999999967 | 0.188 | 0.166 | 0.146 | 0.128 | 0.112 | 0.097 | 0.084 | 0.071 | 0.06 | 0.05 | 0.04 |
| 0.806999999999966 | 0.189 | 0.166 | 0.146 | 0.128 | 0.112 | 0.097 | 0.084 | 0.072 | 0.06 | 0.05 | 0.041 |
| 0.807499999999966 | 0.189 | 0.167 | 0.147 | 0.129 | 0.112 | 0.098 | 0.084 | 0.072 | 0.061 | 0.05 | 0.041 |
| 0.807999999999966 | 0.189 | 0.167 | 0.147 | 0.129 | 0.113 | 0.098 | 0.084 | 0.072 | 0.061 | 0.051 | 0.041 |
| 0.808499999999966 | 0.19 | 0.167 | 0.147 | 0.129 | 0.113 | 0.098 | 0.085 | 0.072 | 0.061 | 0.051 | 0.041 |
| 0.808999999999966 | 0.19 | 0.168 | 0.148 | 0.13 | 0.113 | 0.099 | 0.085 | 0.073 | 0.062 | 0.051 | 0.042 |
| 0.809499999999966 | 0.191 | 0.168 | 0.148 | 0.13 | 0.114 | 0.099 | 0.085 | 0.073 | 0.062 | 0.051 | 0.042 |
| 0.809999999999966 | 0.191 | 0.169 | 0.148 | 0.13 | 0.114 | 0.099 | 0.086 | 0.073 | 0.062 | 0.052 | 0.042 |
| 0.810499999999966 | 0.191 | 0.169 | 0.149 | 0.131 | 0.114 | 0.099 | 0.086 | 0.074 | 0.062 | 0.052 | 0.043 |
| 0.810999999999966 | 0.192 | 0.169 | 0.149 | 0.131 | 0.115 | 0.1 | 0.086 | 0.074 | 0.063 | 0.052 | 0.043 |
| 0.811499999999966 | 0.192 | 0.17 | 0.149 | 0.131 | 0.115 | 0.1 | 0.087 | 0.074 | 0.063 | 0.053 | 0.043 |
| 0.811999999999966 | 0.192 | 0.17 | 0.15 | 0.132 | 0.115 | 0.1 | 0.087 | 0.075 | 0.063 | 0.053 | 0.043 |
| 0.812499999999966 | 0.193 | 0.17 | 0.15 | 0.132 | 0.116 | 0.101 | 0.087 | 0.075 | 0.064 | 0.053 | 0.044 |
| 0.812999999999966 | 0.193 | 0.171 | 0.151 | 0.132 | 0.116 | 0.101 | 0.088 | 0.075 | 0.064 | 0.053 | 0.044 |
| 0.813499999999966 | 0.194 | 0.171 | 0.151 | 0.133 | 0.116 | 0.101 | 0.088 | 0.075 | 0.064 | 0.054 | 0.044 |
| 0.813999999999966 | 0.194 | 0.171 | 0.151 | 0.133 | 0.117 | 0.102 | 0.088 | 0.076 | 0.064 | 0.054 | 0.045 |
| 0.814499999999966 | 0.194 | 0.172 | 0.152 | 0.133 | 0.117 | 0.102 | 0.088 | 0.076 | 0.065 | 0.054 | 0.045 |
| 0.814999999999966 | 0.195 | 0.172 | 0.152 | 0.134 | 0.117 | 0.102 | 0.089 | 0.076 | 0.065 | 0.055 | 0.045 |
| 0.815499999999966 | 0.195 | 0.173 | 0.152 | 0.134 | 0.118 | 0.103 | 0.089 | 0.077 | 0.065 | 0.055 | 0.045 |
| 0.815999999999965 | 0.195 | 0.173 | 0.153 | 0.134 | 0.118 | 0.103 | 0.089 | 0.077 | 0.066 | 0.055 | 0.046 |
| 0.816499999999965 | 0.196 | 0.173 | 0.153 | 0.135 | 0.118 | 0.103 | 0.09 | 0.077 | 0.066 | 0.056 | 0.046 |
| 0.816999999999965 | 0.196 | 0.174 | 0.153 | 0.135 | 0.119 | 0.104 | 0.09 | 0.078 | 0.066 | 0.056 | 0.046 |
| 0.817499999999965 | 0.197 | 0.174 | 0.154 | 0.135 | 0.119 | 0.104 | 0.09 | 0.078 | 0.067 | 0.056 | 0.047 |
| 0.817999999999965 | 0.197 | 0.174 | 0.154 | 0.136 | 0.119 | 0.104 | 0.091 | 0.078 | 0.067 | 0.056 | 0.047 |
| 0.818499999999965 | 0.197 | 0.175 | 0.154 | 0.136 | 0.12 | 0.105 | 0.091 | 0.079 | 0.067 | 0.057 | 0.047 |
| 0.818999999999965 | 0.198 | 0.175 | 0.155 | 0.136 | 0.12 | 0.105 | 0.091 | 0.079 | 0.067 | 0.057 | 0.047 |
| 0.819499999999965 | 0.198 | 0.175 | 0.155 | 0.137 | 0.12 | 0.105 | 0.092 | 0.079 | 0.068 | 0.057 | 0.048 |
| 0.819999999999965 | 0.198 | 0.176 | 0.155 | 0.137 | 0.121 | 0.106 | 0.092 | 0.079 | 0.068 | 0.058 | 0.048 |
| 0.820499999999965 | 0.199 | 0.176 | 0.156 | 0.137 | 0.121 | 0.106 | 0.092 | 0.08 | 0.068 | 0.058 | 0.048 |
| 0.820999999999965 | 0.199 | 0.177 | 0.156 | 0.138 | 0.121 | 0.106 | 0.093 | 0.08 | 0.069 | 0.058 | 0.049 |
| 0.821499999999965 | 0.2 | 0.177 | 0.157 | 0.138 | 0.122 | 0.107 | 0.093 | 0.08 | 0.069 | 0.058 | 0.049 |
| 0.821999999999965 | 0.2 | 0.177 | 0.157 | 0.139 | 0.122 | 0.107 | 0.093 | 0.081 | 0.069 | 0.059 | 0.049 |
| 0.822499999999965 | 0.2 | 0.178 | 0.157 | 0.139 | 0.122 | 0.107 | 0.094 | 0.081 | 0.07 | 0.059 | 0.049 |
| 0.822999999999965 | 0.201 | 0.178 | 0.158 | 0.139 | 0.123 | 0.108 | 0.094 | 0.081 | 0.07 | 0.059 | 0.05 |
| 0.823499999999965 | 0.201 | 0.178 | 0.158 | 0.14 | 0.123 | 0.108 | 0.094 | 0.082 | 0.07 | 0.06 | 0.05 |
| 0.823999999999965 | 0.202 | 0.179 | 0.158 | 0.14 | 0.123 | 0.108 | 0.094 | 0.082 | 0.07 | 0.06 | 0.05 |
| 0.824499999999965 | 0.202 | 0.179 | 0.159 | 0.14 | 0.124 | 0.109 | 0.095 | 0.082 | 0.071 | 0.06 | 0.051 |
| 0.824999999999964 | 0.202 | 0.18 | 0.159 | 0.141 | 0.124 | 0.109 | 0.095 | 0.083 | 0.071 | 0.061 | 0.051 |
| 0.825499999999964 | 0.203 | 0.18 | 0.159 | 0.141 | 0.124 | 0.109 | 0.095 | 0.083 | 0.071 | 0.061 | 0.051 |
| 0.825999999999964 | 0.203 | 0.18 | 0.16 | 0.141 | 0.125 | 0.11 | 0.096 | 0.083 | 0.072 | 0.061 | 0.052 |
| 0.826499999999964 | 0.204 | 0.181 | 0.16 | 0.142 | 0.125 | 0.11 | 0.096 | 0.084 | 0.072 | 0.062 | 0.052 |
| 0.826999999999964 | 0.204 | 0.181 | 0.161 | 0.142 | 0.125 | 0.11 | 0.096 | 0.084 | 0.072 | 0.062 | 0.052 |
| 0.827499999999964 | 0.204 | 0.181 | 0.161 | 0.142 | 0.126 | 0.111 | 0.097 | 0.084 | 0.073 | 0.062 | 0.052 |
| 0.827999999999964 | 0.205 | 0.182 | 0.161 | 0.143 | 0.126 | 0.111 | 0.097 | 0.085 | 0.073 | 0.062 | 0.053 |
| 0.828499999999964 | 0.205 | 0.182 | 0.162 | 0.143 | 0.126 | 0.111 | 0.097 | 0.085 | 0.073 | 0.063 | 0.053 |
| 0.828999999999964 | 0.206 | 0.183 | 0.162 | 0.143 | 0.127 | 0.112 | 0.098 | 0.085 | 0.074 | 0.063 | 0.053 |
| 0.829499999999964 | 0.206 | 0.183 | 0.162 | 0.144 | 0.127 | 0.112 | 0.098 | 0.085 | 0.074 | 0.063 | 0.054 |
| 0.829999999999964 | 0.206 | 0.183 | 0.163 | 0.144 | 0.127 | 0.112 | 0.098 | 0.086 | 0.074 | 0.064 | 0.054 |
| 0.830499999999964 | 0.207 | 0.184 | 0.163 | 0.145 | 0.128 | 0.113 | 0.099 | 0.086 | 0.075 | 0.064 | 0.054 |
| 0.830999999999964 | 0.207 | 0.184 | 0.164 | 0.145 | 0.128 | 0.113 | 0.099 | 0.086 | 0.075 | 0.064 | 0.055 |
| 0.831499999999964 | 0.208 | 0.185 | 0.164 | 0.145 | 0.129 | 0.113 | 0.099 | 0.087 | 0.075 | 0.065 | 0.055 |
| 0.831999999999964 | 0.208 | 0.185 | 0.164 | 0.146 | 0.129 | 0.114 | 0.1 | 0.087 | 0.076 | 0.065 | 0.055 |
| 0.832499999999964 | 0.208 | 0.185 | 0.165 | 0.146 | 0.129 | 0.114 | 0.1 | 0.087 | 0.076 | 0.065 | 0.056 |
| 0.832999999999964 | 0.209 | 0.186 | 0.165 | 0.146 | 0.13 | 0.114 | 0.1 | 0.088 | 0.076 | 0.066 | 0.056 |
| 0.833499999999964 | 0.209 | 0.186 | 0.165 | 0.147 | 0.13 | 0.115 | 0.101 | 0.088 | 0.077 | 0.066 | 0.056 |
| 0.833999999999963 | 0.21 | 0.186 | 0.166 | 0.147 | 0.13 | 0.115 | 0.101 | 0.088 | 0.077 | 0.066 | 0.056 |
| 0.834499999999963 | 0.21 | 0.187 | 0.166 | 0.147 | 0.131 | 0.115 | 0.101 | 0.089 | 0.077 | 0.067 | 0.057 |
| 0.834999999999963 | 0.21 | 0.187 | 0.167 | 0.148 | 0.131 | 0.116 | 0.102 | 0.089 | 0.077 | 0.067 | 0.057 |
| 0.835499999999963 | 0.211 | 0.188 | 0.167 | 0.148 | 0.131 | 0.116 | 0.102 | 0.089 | 0.078 | 0.067 | 0.057 |
| 0.835999999999963 | 0.211 | 0.188 | 0.167 | 0.149 | 0.132 | 0.116 | 0.102 | 0.09 | 0.078 | 0.067 | 0.058 |
| 0.836499999999963 | 0.212 | 0.188 | 0.168 | 0.149 | 0.132 | 0.117 | 0.103 | 0.09 | 0.078 | 0.068 | 0.058 |
| 0.836999999999963 | 0.212 | 0.189 | 0.168 | 0.149 | 0.132 | 0.117 | 0.103 | 0.09 | 0.079 | 0.068 | 0.058 |
| 0.837499999999963 | 0.212 | 0.189 | 0.168 | 0.15 | 0.133 | 0.117 | 0.104 | 0.091 | 0.079 | 0.068 | 0.059 |
| 0.837999999999963 | 0.213 | 0.19 | 0.169 | 0.15 | 0.133 | 0.118 | 0.104 | 0.091 | 0.079 | 0.069 | 0.059 |
| 0.838499999999963 | 0.213 | 0.19 | 0.169 | 0.15 | 0.134 | 0.118 | 0.104 | 0.091 | 0.08 | 0.069 | 0.059 |
| 0.838999999999963 | 0.214 | 0.19 | 0.17 | 0.151 | 0.134 | 0.119 | 0.105 | 0.092 | 0.08 | 0.069 | 0.06 |
| 0.839499999999963 | 0.214 | 0.191 | 0.17 | 0.151 | 0.134 | 0.119 | 0.105 | 0.092 | 0.08 | 0.07 | 0.06 |
| 0.839999999999963 | 0.214 | 0.191 | 0.17 | 0.152 | 0.135 | 0.119 | 0.105 | 0.092 | 0.081 | 0.07 | 0.06 |
| 0.840499999999963 | 0.215 | 0.192 | 0.171 | 0.152 | 0.135 | 0.12 | 0.106 | 0.093 | 0.081 | 0.07 | 0.061 |
| 0.840999999999963 | 0.215 | 0.192 | 0.171 | 0.152 | 0.135 | 0.12 | 0.106 | 0.093 | 0.081 | 0.071 | 0.061 |
| 0.841499999999963 | 0.216 | 0.192 | 0.172 | 0.153 | 0.136 | 0.12 | 0.106 | 0.094 | 0.082 | 0.071 | 0.061 |
| 0.841999999999963 | 0.216 | 0.193 | 0.172 | 0.153 | 0.136 | 0.121 | 0.107 | 0.094 | 0.082 | 0.071 | 0.062 |
| 0.842499999999963 | 0.217 | 0.193 | 0.172 | 0.153 | 0.136 | 0.121 | 0.107 | 0.094 | 0.082 | 0.072 | 0.062 |
| 0.842999999999963 | 0.217 | 0.194 | 0.173 | 0.154 | 0.137 | 0.121 | 0.107 | 0.095 | 0.083 | 0.072 | 0.062 |
| 0.843499999999962 | 0.217 | 0.194 | 0.173 | 0.154 | 0.137 | 0.122 | 0.108 | 0.095 | 0.083 | 0.072 | 0.063 |
| 0.843999999999962 | 0.218 | 0.194 | 0.173 | 0.155 | 0.138 | 0.122 | 0.108 | 0.095 | 0.083 | 0.073 | 0.063 |
| 0.844499999999962 | 0.218 | 0.195 | 0.174 | 0.155 | 0.138 | 0.122 | 0.108 | 0.096 | 0.084 | 0.073 | 0.063 |
| 0.844999999999962 | 0.219 | 0.195 | 0.174 | 0.155 | 0.138 | 0.123 | 0.109 | 0.096 | 0.084 | 0.073 | 0.063 |
| 0.845499999999962 | 0.219 | 0.196 | 0.175 | 0.156 | 0.139 | 0.123 | 0.109 | 0.096 | 0.085 | 0.074 | 0.064 |
| 0.845999999999962 | 0.219 | 0.196 | 0.175 | 0.156 | 0.139 | 0.124 | 0.109 | 0.097 | 0.085 | 0.074 | 0.064 |
| 0.846499999999962 | 0.22 | 0.196 | 0.175 | 0.157 | 0.139 | 0.124 | 0.11 | 0.097 | 0.085 | 0.074 | 0.064 |
| 0.846999999999962 | 0.22 | 0.197 | 0.176 | 0.157 | 0.14 | 0.124 | 0.11 | 0.097 | 0.086 | 0.075 | 0.065 |
| 0.847499999999962 | 0.221 | 0.197 | 0.176 | 0.157 | 0.14 | 0.125 | 0.111 | 0.098 | 0.086 | 0.075 | 0.065 |
| 0.847999999999962 | 0.221 | 0.198 | 0.177 | 0.158 | 0.141 | 0.125 | 0.111 | 0.098 | 0.086 | 0.075 | 0.065 |
| 0.848499999999962 | 0.222 | 0.198 | 0.177 | 0.158 | 0.141 | 0.125 | 0.111 | 0.098 | 0.087 | 0.076 | 0.066 |
| 0.848999999999962 | 0.222 | 0.199 | 0.177 | 0.158 | 0.141 | 0.126 | 0.112 | 0.099 | 0.087 | 0.076 | 0.066 |
| 0.849499999999962 | 0.222 | 0.199 | 0.178 | 0.159 | 0.142 | 0.126 | 0.112 | 0.099 | 0.087 | 0.076 | 0.066 |
| 0.849999999999962 | 0.223 | 0.199 | 0.178 | 0.159 | 0.142 | 0.127 | 0.112 | 0.099 | 0.088 | 0.077 | 0.067 |
| 0.850499999999962 | 0.223 | 0.2 | 0.179 | 0.16 | 0.142 | 0.127 | 0.113 | 0.1 | 0.088 | 0.077 | 0.067 |
| 0.850999999999962 | 0.224 | 0.2 | 0.179 | 0.16 | 0.143 | 0.127 | 0.113 | 0.1 | 0.088 | 0.077 | 0.068 |
| 0.851499999999962 | 0.224 | 0.201 | 0.179 | 0.16 | 0.143 | 0.128 | 0.113 | 0.101 | 0.089 | 0.078 | 0.068 |
| 0.851999999999962 | 0.225 | 0.201 | 0.18 | 0.161 | 0.144 | 0.128 | 0.114 | 0.101 | 0.089 | 0.078 | 0.068 |
| 0.852499999999961 | 0.225 | 0.201 | 0.18 | 0.161 | 0.144 | 0.128 | 0.114 | 0.101 | 0.089 | 0.079 | 0.069 |
| 0.852999999999961 | 0.225 | 0.202 | 0.181 | 0.162 | 0.144 | 0.129 | 0.115 | 0.102 | 0.09 | 0.079 | 0.069 |
| 0.853499999999961 | 0.226 | 0.202 | 0.181 | 0.162 | 0.145 | 0.129 | 0.115 | 0.102 | 0.09 | 0.079 | 0.069 |
| 0.853999999999961 | 0.226 | 0.203 | 0.182 | 0.162 | 0.145 | 0.13 | 0.115 | 0.102 | 0.09 | 0.08 | 0.07 |
| 0.854499999999961 | 0.227 | 0.203 | 0.182 | 0.163 | 0.146 | 0.13 | 0.116 | 0.103 | 0.091 | 0.08 | 0.07 |
| 0.854999999999961 | 0.227 | 0.204 | 0.182 | 0.163 | 0.146 | 0.13 | 0.116 | 0.103 | 0.091 | 0.08 | 0.07 |
| 0.855499999999961 | 0.228 | 0.204 | 0.183 | 0.164 | 0.146 | 0.131 | 0.116 | 0.103 | 0.092 | 0.081 | 0.071 |
| 0.855999999999961 | 0.228 | 0.204 | 0.183 | 0.164 | 0.147 | 0.131 | 0.117 | 0.104 | 0.092 | 0.081 | 0.071 |
| 0.856499999999961 | 0.229 | 0.205 | 0.184 | 0.164 | 0.147 | 0.131 | 0.117 | 0.104 | 0.092 | 0.081 | 0.071 |
| 0.856999999999961 | 0.229 | 0.205 | 0.184 | 0.165 | 0.148 | 0.132 | 0.118 | 0.105 | 0.093 | 0.082 | 0.072 |
| 0.857499999999961 | 0.229 | 0.206 | 0.184 | 0.165 | 0.148 | 0.132 | 0.118 | 0.105 | 0.093 | 0.082 | 0.072 |
| 0.857999999999961 | 0.23 | 0.206 | 0.185 | 0.166 | 0.148 | 0.133 | 0.118 | 0.105 | 0.093 | 0.082 | 0.072 |
| 0.858499999999961 | 0.23 | 0.207 | 0.185 | 0.166 | 0.149 | 0.133 | 0.119 | 0.106 | 0.094 | 0.083 | 0.073 |
| 0.858999999999961 | 0.231 | 0.207 | 0.186 | 0.166 | 0.149 | 0.133 | 0.119 | 0.106 | 0.094 | 0.083 | 0.073 |
| 0.859499999999961 | 0.231 | 0.207 | 0.186 | 0.167 | 0.149 | 0.134 | 0.119 | 0.106 | 0.094 | 0.083 | 0.073 |
| 0.859999999999961 | 0.232 | 0.208 | 0.186 | 0.167 | 0.15 | 0.134 | 0.12 | 0.107 | 0.095 | 0.084 | 0.074 |
| 0.860499999999961 | 0.232 | 0.208 | 0.187 | 0.168 | 0.15 | 0.135 | 0.12 | 0.107 | 0.095 | 0.084 | 0.074 |
| 0.860999999999961 | 0.233 | 0.209 | 0.187 | 0.168 | 0.151 | 0.135 | 0.121 | 0.107 | 0.096 | 0.085 | 0.074 |
| 0.86149999999996 | 0.233 | 0.209 | 0.188 | 0.168 | 0.151 | 0.135 | 0.121 | 0.108 | 0.096 | 0.085 | 0.075 |
| 0.86199999999996 | 0.233 | 0.21 | 0.188 | 0.169 | 0.151 | 0.136 | 0.121 | 0.108 | 0.096 | 0.085 | 0.075 |
| 0.86249999999996 | 0.234 | 0.21 | 0.189 | 0.169 | 0.152 | 0.136 | 0.122 | 0.109 | 0.097 | 0.086 | 0.076 |
| 0.86299999999996 | 0.234 | 0.21 | 0.189 | 0.17 | 0.152 | 0.136 | 0.122 | 0.109 | 0.097 | 0.086 | 0.076 |
| 0.86349999999996 | 0.235 | 0.211 | 0.189 | 0.17 | 0.153 | 0.137 | 0.122 | 0.109 | 0.097 | 0.086 | 0.076 |
| 0.86399999999996 | 0.235 | 0.211 | 0.19 | 0.171 | 0.153 | 0.137 | 0.123 | 0.11 | 0.098 | 0.087 | 0.077 |
| 0.86449999999996 | 0.236 | 0.212 | 0.19 | 0.171 | 0.153 | 0.138 | 0.123 | 0.11 | 0.098 | 0.087 | 0.077 |
| 0.86499999999996 | 0.236 | 0.212 | 0.191 | 0.171 | 0.154 | 0.138 | 0.124 | 0.11 | 0.098 | 0.087 | 0.077 |
| 0.86549999999996 | 0.237 | 0.213 | 0.191 | 0.172 | 0.154 | 0.138 | 0.124 | 0.111 | 0.099 | 0.088 | 0.078 |
| 0.86599999999996 | 0.237 | 0.213 | 0.192 | 0.172 | 0.155 | 0.139 | 0.124 | 0.111 | 0.099 | 0.088 | 0.078 |
| 0.86649999999996 | 0.237 | 0.213 | 0.192 | 0.173 | 0.155 | 0.139 | 0.125 | 0.112 | 0.1 | 0.089 | 0.078 |
| 0.86699999999996 | 0.238 | 0.214 | 0.192 | 0.173 | 0.156 | 0.14 | 0.125 | 0.112 | 0.1 | 0.089 | 0.079 |
| 0.86749999999996 | 0.238 | 0.214 | 0.193 | 0.173 | 0.156 | 0.14 | 0.126 | 0.112 | 0.1 | 0.089 | 0.079 |
| 0.86799999999996 | 0.239 | 0.215 | 0.193 | 0.174 | 0.156 | 0.14 | 0.126 | 0.113 | 0.101 | 0.09 | 0.079 |
| 0.86849999999996 | 0.239 | 0.215 | 0.194 | 0.174 | 0.157 | 0.141 | 0.126 | 0.113 | 0.101 | 0.09 | 0.08 |
| 0.86899999999996 | 0.24 | 0.216 | 0.194 | 0.175 | 0.157 | 0.141 | 0.127 | 0.114 | 0.101 | 0.09 | 0.08 |
| 0.86949999999996 | 0.24 | 0.216 | 0.195 | 0.175 | 0.158 | 0.142 | 0.127 | 0.114 | 0.102 | 0.091 | 0.081 |
| 0.86999999999996 | 0.241 | 0.217 | 0.195 | 0.176 | 0.158 | 0.142 | 0.128 | 0.114 | 0.102 | 0.091 | 0.081 |
| 0.870499999999959 | 0.241 | 0.217 | 0.195 | 0.176 | 0.158 | 0.142 | 0.128 | 0.115 | 0.103 | 0.092 | 0.081 |
| 0.870999999999959 | 0.242 | 0.217 | 0.196 | 0.176 | 0.159 | 0.143 | 0.128 | 0.115 | 0.103 | 0.092 | 0.082 |
| 0.871499999999959 | 0.242 | 0.218 | 0.196 | 0.177 | 0.159 | 0.143 | 0.129 | 0.115 | 0.103 | 0.092 | 0.082 |
| 0.871999999999959 | 0.243 | 0.218 | 0.197 | 0.177 | 0.16 | 0.144 | 0.129 | 0.116 | 0.104 | 0.093 | 0.082 |
| 0.872499999999959 | 0.243 | 0.219 | 0.197 | 0.178 | 0.16 | 0.144 | 0.13 | 0.116 | 0.104 | 0.093 | 0.083 |
| 0.872999999999959 | 0.243 | 0.219 | 0.198 | 0.178 | 0.16 | 0.144 | 0.13 | 0.117 | 0.105 | 0.093 | 0.083 |
| 0.873499999999959 | 0.244 | 0.22 | 0.198 | 0.179 | 0.161 | 0.145 | 0.13 | 0.117 | 0.105 | 0.094 | 0.084 |
| 0.873999999999959 | 0.244 | 0.22 | 0.199 | 0.179 | 0.161 | 0.145 | 0.131 | 0.117 | 0.105 | 0.094 | 0.084 |
| 0.874499999999959 | 0.245 | 0.221 | 0.199 | 0.179 | 0.162 | 0.146 | 0.131 | 0.118 | 0.106 | 0.095 | 0.084 |
| 0.874999999999959 | 0.245 | 0.221 | 0.199 | 0.18 | 0.162 | 0.146 | 0.132 | 0.118 | 0.106 | 0.095 | 0.085 |
| 0.875499999999959 | 0.246 | 0.222 | 0.2 | 0.18 | 0.163 | 0.147 | 0.132 | 0.119 | 0.106 | 0.095 | 0.085 |
| 0.875999999999959 | 0.246 | 0.222 | 0.2 | 0.181 | 0.163 | 0.147 | 0.132 | 0.119 | 0.107 | 0.096 | 0.085 |
| 0.876499999999959 | 0.247 | 0.222 | 0.201 | 0.181 | 0.163 | 0.147 | 0.133 | 0.119 | 0.107 | 0.096 | 0.086 |
| 0.876999999999959 | 0.247 | 0.223 | 0.201 | 0.182 | 0.164 | 0.148 | 0.133 | 0.12 | 0.108 | 0.096 | 0.086 |
| 0.877499999999959 | 0.248 | 0.223 | 0.202 | 0.182 | 0.164 | 0.148 | 0.134 | 0.12 | 0.108 | 0.097 | 0.087 |
| 0.877999999999959 | 0.248 | 0.224 | 0.202 | 0.182 | 0.165 | 0.149 | 0.134 | 0.121 | 0.108 | 0.097 | 0.087 |
| 0.878499999999959 | 0.249 | 0.224 | 0.203 | 0.183 | 0.165 | 0.149 | 0.134 | 0.121 | 0.109 | 0.098 | 0.087 |
| 0.878999999999959 | 0.249 | 0.225 | 0.203 | 0.183 | 0.166 | 0.149 | 0.135 | 0.121 | 0.109 | 0.098 | 0.088 |
| 0.879499999999958 | 0.25 | 0.225 | 0.203 | 0.184 | 0.166 | 0.15 | 0.135 | 0.122 | 0.11 | 0.098 | 0.088 |
| 0.879999999999958 | 0.25 | 0.226 | 0.204 | 0.184 | 0.166 | 0.15 | 0.136 | 0.122 | 0.11 | 0.099 | 0.088 |
| 0.880499999999958 | 0.251 | 0.226 | 0.204 | 0.185 | 0.167 | 0.151 | 0.136 | 0.123 | 0.11 | 0.099 | 0.089 |
| 0.880999999999958 | 0.251 | 0.227 | 0.205 | 0.185 | 0.167 | 0.151 | 0.136 | 0.123 | 0.111 | 0.1 | 0.089 |
| 0.881499999999958 | 0.251 | 0.227 | 0.205 | 0.186 | 0.168 | 0.152 | 0.137 | 0.123 | 0.111 | 0.1 | 0.09 |
| 0.881999999999958 | 0.252 | 0.228 | 0.206 | 0.186 | 0.168 | 0.152 | 0.137 | 0.124 | 0.112 | 0.1 | 0.09 |
| 0.882499999999958 | 0.252 | 0.228 | 0.206 | 0.186 | 0.169 | 0.152 | 0.138 | 0.124 | 0.112 | 0.101 | 0.09 |
| 0.882999999999958 | 0.253 | 0.228 | 0.207 | 0.187 | 0.169 | 0.153 | 0.138 | 0.125 | 0.112 | 0.101 | 0.091 |
| 0.883499999999958 | 0.253 | 0.229 | 0.207 | 0.187 | 0.169 | 0.153 | 0.139 | 0.125 | 0.113 | 0.102 | 0.091 |
| 0.883999999999958 | 0.254 | 0.229 | 0.207 | 0.188 | 0.17 | 0.154 | 0.139 | 0.126 | 0.113 | 0.102 | 0.092 |
| 0.884499999999958 | 0.254 | 0.23 | 0.208 | 0.188 | 0.17 | 0.154 | 0.139 | 0.126 | 0.114 | 0.102 | 0.092 |
| 0.884999999999958 | 0.255 | 0.23 | 0.208 | 0.189 | 0.171 | 0.155 | 0.14 | 0.126 | 0.114 | 0.103 | 0.092 |
| 0.885499999999958 | 0.255 | 0.231 | 0.209 | 0.189 | 0.171 | 0.155 | 0.14 | 0.127 | 0.114 | 0.103 | 0.093 |
| 0.885999999999958 | 0.256 | 0.231 | 0.209 | 0.19 | 0.172 | 0.155 | 0.141 | 0.127 | 0.115 | 0.104 | 0.093 |
| 0.886499999999958 | 0.256 | 0.232 | 0.21 | 0.19 | 0.172 | 0.156 | 0.141 | 0.128 | 0.115 | 0.104 | 0.094 |
| 0.886999999999958 | 0.257 | 0.232 | 0.21 | 0.19 | 0.172 | 0.156 | 0.141 | 0.128 | 0.116 | 0.104 | 0.094 |
| 0.887499999999958 | 0.257 | 0.233 | 0.211 | 0.191 | 0.173 | 0.157 | 0.142 | 0.128 | 0.116 | 0.105 | 0.094 |
| 0.887999999999958 | 0.258 | 0.233 | 0.211 | 0.191 | 0.173 | 0.157 | 0.142 | 0.129 | 0.116 | 0.105 | 0.095 |
| 0.888499999999957 | 0.258 | 0.234 | 0.212 | 0.192 | 0.174 | 0.158 | 0.143 | 0.129 | 0.117 | 0.106 | 0.095 |
| 0.888999999999957 | 0.259 | 0.234 | 0.212 | 0.192 | 0.174 | 0.158 | 0.143 | 0.13 | 0.117 | 0.106 | 0.096 |
| 0.889499999999957 | 0.259 | 0.235 | 0.213 | 0.193 | 0.175 | 0.158 | 0.144 | 0.13 | 0.118 | 0.106 | 0.096 |
| 0.889999999999957 | 0.26 | 0.235 | 0.213 | 0.193 | 0.175 | 0.159 | 0.144 | 0.13 | 0.118 | 0.107 | 0.096 |
| 0.890499999999957 | 0.26 | 0.236 | 0.213 | 0.194 | 0.176 | 0.159 | 0.144 | 0.131 | 0.119 | 0.107 | 0.097 |
| 0.890999999999957 | 0.261 | 0.236 | 0.214 | 0.194 | 0.176 | 0.16 | 0.145 | 0.131 | 0.119 | 0.108 | 0.097 |
| 0.891499999999957 | 0.261 | 0.237 | 0.214 | 0.195 | 0.176 | 0.16 | 0.145 | 0.132 | 0.119 | 0.108 | 0.098 |
| 0.891999999999957 | 0.262 | 0.237 | 0.215 | 0.195 | 0.177 | 0.161 | 0.146 | 0.132 | 0.12 | 0.108 | 0.098 |
| 0.892499999999957 | 0.262 | 0.238 | 0.215 | 0.195 | 0.177 | 0.161 | 0.146 | 0.133 | 0.12 | 0.109 | 0.098 |
| 0.892999999999957 | 0.263 | 0.238 | 0.216 | 0.196 | 0.178 | 0.161 | 0.147 | 0.133 | 0.121 | 0.109 | 0.099 |
| 0.893499999999957 | 0.263 | 0.238 | 0.216 | 0.196 | 0.178 | 0.162 | 0.147 | 0.133 | 0.121 | 0.11 | 0.099 |
| 0.893999999999957 | 0.264 | 0.239 | 0.217 | 0.197 | 0.179 | 0.162 | 0.147 | 0.134 | 0.121 | 0.11 | 0.1 |
| 0.894499999999957 | 0.264 | 0.239 | 0.217 | 0.197 | 0.179 | 0.163 | 0.148 | 0.134 | 0.122 | 0.11 | 0.1 |
| 0.894999999999957 | 0.265 | 0.24 | 0.218 | 0.198 | 0.18 | 0.163 | 0.148 | 0.135 | 0.122 | 0.111 | 0.1 |
| 0.895499999999957 | 0.265 | 0.24 | 0.218 | 0.198 | 0.18 | 0.164 | 0.149 | 0.135 | 0.123 | 0.111 | 0.101 |
| 0.895999999999957 | 0.266 | 0.241 | 0.219 | 0.199 | 0.181 | 0.164 | 0.149 | 0.136 | 0.123 | 0.112 | 0.101 |
| 0.896499999999957 | 0.266 | 0.241 | 0.219 | 0.199 | 0.181 | 0.165 | 0.15 | 0.136 | 0.124 | 0.112 | 0.102 |
| 0.896999999999957 | 0.267 | 0.242 | 0.22 | 0.2 | 0.181 | 0.165 | 0.15 | 0.136 | 0.124 | 0.113 | 0.102 |
| 0.897499999999956 | 0.267 | 0.242 | 0.22 | 0.2 | 0.182 | 0.165 | 0.151 | 0.137 | 0.124 | 0.113 | 0.102 |
| 0.897999999999956 | 0.268 | 0.243 | 0.221 | 0.201 | 0.182 | 0.166 | 0.151 | 0.137 | 0.125 | 0.113 | 0.103 |
| 0.898499999999956 | 0.268 | 0.243 | 0.221 | 0.201 | 0.183 | 0.166 | 0.151 | 0.138 | 0.125 | 0.114 | 0.103 |
| 0.898999999999956 | 0.269 | 0.244 | 0.222 | 0.201 | 0.183 | 0.167 | 0.152 | 0.138 | 0.126 | 0.114 | 0.104 |
| 0.899499999999956 | 0.269 | 0.244 | 0.222 | 0.202 | 0.184 | 0.167 | 0.152 | 0.139 | 0.126 | 0.115 | 0.104 |
| 0.899999999999956 | 0.27 | 0.245 | 0.223 | 0.202 | 0.184 | 0.168 | 0.153 | 0.139 | 0.127 | 0.115 | 0.105 |
| 0.900499999999956 | 0.27 | 0.245 | 0.223 | 0.203 | 0.185 | 0.168 | 0.153 | 0.14 | 0.127 | 0.116 | 0.105 |
| 0.900999999999956 | 0.271 | 0.246 | 0.224 | 0.203 | 0.185 | 0.169 | 0.154 | 0.14 | 0.127 | 0.116 | 0.105 |
| 0.901499999999956 | 0.271 | 0.246 | 0.224 | 0.204 | 0.186 | 0.169 | 0.154 | 0.14 | 0.128 | 0.116 | 0.106 |
| 0.901999999999956 | 0.272 | 0.247 | 0.224 | 0.204 | 0.186 | 0.17 | 0.155 | 0.141 | 0.128 | 0.117 | 0.106 |
| 0.902499999999956 | 0.272 | 0.247 | 0.225 | 0.205 | 0.187 | 0.17 | 0.155 | 0.141 | 0.129 | 0.117 | 0.107 |
| 0.902999999999956 | 0.273 | 0.248 | 0.225 | 0.205 | 0.187 | 0.17 | 0.155 | 0.142 | 0.129 | 0.118 | 0.107 |
| 0.903499999999956 | 0.273 | 0.248 | 0.226 | 0.206 | 0.188 | 0.171 | 0.156 | 0.142 | 0.13 | 0.118 | 0.107 |
| 0.903999999999956 | 0.274 | 0.249 | 0.226 | 0.206 | 0.188 | 0.171 | 0.156 | 0.143 | 0.13 | 0.119 | 0.108 |
| 0.904499999999956 | 0.274 | 0.249 | 0.227 | 0.207 | 0.188 | 0.172 | 0.157 | 0.143 | 0.13 | 0.119 | 0.108 |
| 0.904999999999956 | 0.275 | 0.25 | 0.227 | 0.207 | 0.189 | 0.172 | 0.157 | 0.143 | 0.131 | 0.119 | 0.109 |
| 0.905499999999956 | 0.275 | 0.25 | 0.228 | 0.208 | 0.189 | 0.173 | 0.158 | 0.144 | 0.131 | 0.12 | 0.109 |
| 0.905999999999956 | 0.276 | 0.251 | 0.228 | 0.208 | 0.19 | 0.173 | 0.158 | 0.144 | 0.132 | 0.12 | 0.11 |
| 0.906499999999956 | 0.276 | 0.251 | 0.229 | 0.209 | 0.19 | 0.174 | 0.159 | 0.145 | 0.132 | 0.121 | 0.11 |
| 0.906999999999955 | 0.277 | 0.252 | 0.229 | 0.209 | 0.191 | 0.174 | 0.159 | 0.145 | 0.133 | 0.121 | 0.11 |
| 0.907499999999955 | 0.278 | 0.252 | 0.23 | 0.21 | 0.191 | 0.175 | 0.16 | 0.146 | 0.133 | 0.122 | 0.111 |
| 0.907999999999955 | 0.278 | 0.253 | 0.23 | 0.21 | 0.192 | 0.175 | 0.16 | 0.146 | 0.134 | 0.122 | 0.111 |
| 0.908499999999955 | 0.279 | 0.253 | 0.231 | 0.211 | 0.192 | 0.176 | 0.16 | 0.147 | 0.134 | 0.122 | 0.112 |
| 0.908999999999955 | 0.279 | 0.254 | 0.231 | 0.211 | 0.193 | 0.176 | 0.161 | 0.147 | 0.134 | 0.123 | 0.112 |
| 0.909499999999955 | 0.28 | 0.254 | 0.232 | 0.212 | 0.193 | 0.177 | 0.161 | 0.148 | 0.135 | 0.123 | 0.113 |
| 0.909999999999955 | 0.28 | 0.255 | 0.232 | 0.212 | 0.194 | 0.177 | 0.162 | 0.148 | 0.135 | 0.124 | 0.113 |
| 0.910499999999955 | 0.281 | 0.255 | 0.233 | 0.213 | 0.194 | 0.177 | 0.162 | 0.148 | 0.136 | 0.124 | 0.114 |
| 0.910999999999955 | 0.281 | 0.256 | 0.233 | 0.213 | 0.195 | 0.178 | 0.163 | 0.149 | 0.136 | 0.125 | 0.114 |
| 0.911499999999955 | 0.282 | 0.257 | 0.234 | 0.214 | 0.195 | 0.178 | 0.163 | 0.149 | 0.137 | 0.125 | 0.114 |
| 0.911999999999955 | 0.282 | 0.257 | 0.234 | 0.214 | 0.196 | 0.179 | 0.164 | 0.15 | 0.137 | 0.126 | 0.115 |
| 0.912499999999955 | 0.283 | 0.258 | 0.235 | 0.215 | 0.196 | 0.179 | 0.164 | 0.15 | 0.138 | 0.126 | 0.115 |
| 0.912999999999955 | 0.283 | 0.258 | 0.235 | 0.215 | 0.197 | 0.18 | 0.165 | 0.151 | 0.138 | 0.126 | 0.116 |
| 0.913499999999955 | 0.284 | 0.259 | 0.236 | 0.216 | 0.197 | 0.18 | 0.165 | 0.151 | 0.139 | 0.127 | 0.116 |
| 0.913999999999955 | 0.284 | 0.259 | 0.236 | 0.216 | 0.198 | 0.181 | 0.166 | 0.152 | 0.139 | 0.127 | 0.117 |
| 0.914499999999955 | 0.285 | 0.26 | 0.237 | 0.216 | 0.198 | 0.181 | 0.166 | 0.152 | 0.139 | 0.128 | 0.117 |
| 0.914999999999955 | 0.285 | 0.26 | 0.237 | 0.217 | 0.199 | 0.182 | 0.166 | 0.153 | 0.14 | 0.128 | 0.117 |
| 0.915499999999955 | 0.286 | 0.261 | 0.238 | 0.217 | 0.199 | 0.182 | 0.167 | 0.153 | 0.14 | 0.129 | 0.118 |
| 0.915999999999954 | 0.287 | 0.261 | 0.238 | 0.218 | 0.199 | 0.183 | 0.167 | 0.154 | 0.141 | 0.129 | 0.118 |
| 0.916499999999954 | 0.287 | 0.262 | 0.239 | 0.218 | 0.2 | 0.183 | 0.168 | 0.154 | 0.141 | 0.13 | 0.119 |
| 0.916999999999954 | 0.288 | 0.262 | 0.239 | 0.219 | 0.2 | 0.184 | 0.168 | 0.154 | 0.142 | 0.13 | 0.119 |
| 0.917499999999954 | 0.288 | 0.263 | 0.24 | 0.219 | 0.201 | 0.184 | 0.169 | 0.155 | 0.142 | 0.13 | 0.12 |
| 0.917999999999954 | 0.289 | 0.263 | 0.241 | 0.22 | 0.201 | 0.185 | 0.169 | 0.155 | 0.143 | 0.131 | 0.12 |
| 0.918499999999954 | 0.289 | 0.264 | 0.241 | 0.221 | 0.202 | 0.185 | 0.17 | 0.156 | 0.143 | 0.131 | 0.121 |
| 0.918999999999954 | 0.29 | 0.264 | 0.242 | 0.221 | 0.202 | 0.186 | 0.17 | 0.156 | 0.144 | 0.132 | 0.121 |
| 0.919499999999954 | 0.29 | 0.265 | 0.242 | 0.222 | 0.203 | 0.186 | 0.171 | 0.157 | 0.144 | 0.132 | 0.122 |
| 0.919999999999954 | 0.291 | 0.265 | 0.243 | 0.222 | 0.203 | 0.187 | 0.171 | 0.157 | 0.144 | 0.133 | 0.122 |
| 0.920499999999954 | 0.291 | 0.266 | 0.243 | 0.223 | 0.204 | 0.187 | 0.172 | 0.158 | 0.145 | 0.133 | 0.122 |
| 0.920999999999954 | 0.292 | 0.266 | 0.244 | 0.223 | 0.204 | 0.188 | 0.172 | 0.158 | 0.145 | 0.134 | 0.123 |
| 0.921499999999954 | 0.293 | 0.267 | 0.244 | 0.224 | 0.205 | 0.188 | 0.173 | 0.159 | 0.146 | 0.134 | 0.123 |
| 0.921999999999954 | 0.293 | 0.268 | 0.245 | 0.224 | 0.205 | 0.189 | 0.173 | 0.159 | 0.146 | 0.135 | 0.124 |
| 0.922499999999954 | 0.294 | 0.268 | 0.245 | 0.225 | 0.206 | 0.189 | 0.174 | 0.16 | 0.147 | 0.135 | 0.124 |
| 0.922999999999954 | 0.294 | 0.269 | 0.246 | 0.225 | 0.206 | 0.19 | 0.174 | 0.16 | 0.147 | 0.136 | 0.125 |
| 0.923499999999954 | 0.295 | 0.269 | 0.246 | 0.226 | 0.207 | 0.19 | 0.175 | 0.161 | 0.148 | 0.136 | 0.125 |
| 0.923999999999954 | 0.295 | 0.27 | 0.247 | 0.226 | 0.207 | 0.191 | 0.175 | 0.161 | 0.148 | 0.136 | 0.126 |
| 0.924499999999954 | 0.296 | 0.27 | 0.247 | 0.227 | 0.208 | 0.191 | 0.176 | 0.162 | 0.149 | 0.137 | 0.126 |
| 0.924999999999953 | 0.296 | 0.271 | 0.248 | 0.227 | 0.208 | 0.192 | 0.176 | 0.162 | 0.149 | 0.137 | 0.127 |
| 0.925499999999953 | 0.297 | 0.271 | 0.248 | 0.228 | 0.209 | 0.192 | 0.177 | 0.163 | 0.15 | 0.138 | 0.127 |
| 0.925999999999953 | 0.297 | 0.272 | 0.249 | 0.228 | 0.209 | 0.193 | 0.177 | 0.163 | 0.15 | 0.138 | 0.127 |
| 0.926499999999953 | 0.298 | 0.272 | 0.249 | 0.229 | 0.21 | 0.193 | 0.178 | 0.163 | 0.151 | 0.139 | 0.128 |
| 0.926999999999953 | 0.299 | 0.273 | 0.25 | 0.229 | 0.21 | 0.194 | 0.178 | 0.164 | 0.151 | 0.139 | 0.128 |
| 0.927499999999953 | 0.299 | 0.273 | 0.25 | 0.23 | 0.211 | 0.194 | 0.179 | 0.164 | 0.152 | 0.14 | 0.129 |
| 0.927999999999953 | 0.3 | 0.274 | 0.251 | 0.23 | 0.212 | 0.195 | 0.179 | 0.165 | 0.152 | 0.14 | 0.129 |
| 0.928499999999953 | 0.3 | 0.275 | 0.252 | 0.231 | 0.212 | 0.195 | 0.18 | 0.165 | 0.153 | 0.141 | 0.13 |
| 0.928999999999953 | 0.301 | 0.275 | 0.252 | 0.231 | 0.213 | 0.196 | 0.18 | 0.166 | 0.153 | 0.141 | 0.13 |
| 0.929499999999953 | 0.301 | 0.276 | 0.253 | 0.232 | 0.213 | 0.196 | 0.181 | 0.166 | 0.153 | 0.142 | 0.131 |
| 0.929999999999953 | 0.302 | 0.276 | 0.253 | 0.232 | 0.214 | 0.197 | 0.181 | 0.167 | 0.154 | 0.142 | 0.131 |
| 0.930499999999953 | 0.303 | 0.277 | 0.254 | 0.233 | 0.214 | 0.197 | 0.182 | 0.167 | 0.154 | 0.143 | 0.132 |
| 0.930999999999953 | 0.303 | 0.277 | 0.254 | 0.233 | 0.215 | 0.198 | 0.182 | 0.168 | 0.155 | 0.143 | 0.132 |
| 0.931499999999953 | 0.304 | 0.278 | 0.255 | 0.234 | 0.215 | 0.198 | 0.183 | 0.168 | 0.155 | 0.144 | 0.133 |
| 0.931999999999953 | 0.304 | 0.278 | 0.255 | 0.234 | 0.216 | 0.199 | 0.183 | 0.169 | 0.156 | 0.144 | 0.133 |
| 0.932499999999953 | 0.305 | 0.279 | 0.256 | 0.235 | 0.216 | 0.199 | 0.184 | 0.169 | 0.156 | 0.144 | 0.134 |
| 0.932999999999953 | 0.305 | 0.28 | 0.256 | 0.236 | 0.217 | 0.2 | 0.184 | 0.17 | 0.157 | 0.145 | 0.134 |
| 0.933499999999953 | 0.306 | 0.28 | 0.257 | 0.236 | 0.217 | 0.2 | 0.185 | 0.17 | 0.157 | 0.145 | 0.135 |
| 0.933999999999953 | 0.306 | 0.281 | 0.257 | 0.237 | 0.218 | 0.201 | 0.185 | 0.171 | 0.158 | 0.146 | 0.135 |
| 0.934499999999952 | 0.307 | 0.281 | 0.258 | 0.237 | 0.218 | 0.201 | 0.186 | 0.171 | 0.158 | 0.146 | 0.135 |
| 0.934999999999952 | 0.308 | 0.282 | 0.259 | 0.238 | 0.219 | 0.202 | 0.186 | 0.172 | 0.159 | 0.147 | 0.136 |
| 0.935499999999952 | 0.308 | 0.282 | 0.259 | 0.238 | 0.219 | 0.202 | 0.187 | 0.172 | 0.159 | 0.147 | 0.136 |
| 0.935999999999952 | 0.309 | 0.283 | 0.26 | 0.239 | 0.22 | 0.203 | 0.187 | 0.173 | 0.16 | 0.148 | 0.137 |
| 0.936499999999952 | 0.309 | 0.283 | 0.26 | 0.239 | 0.22 | 0.203 | 0.188 | 0.173 | 0.16 | 0.148 | 0.137 |
| 0.936999999999952 | 0.31 | 0.284 | 0.261 | 0.24 | 0.221 | 0.204 | 0.188 | 0.174 | 0.161 | 0.149 | 0.138 |
| 0.937499999999952 | 0.31 | 0.285 | 0.261 | 0.24 | 0.221 | 0.204 | 0.189 | 0.174 | 0.161 | 0.149 | 0.138 |
| 0.937999999999952 | 0.311 | 0.285 | 0.262 | 0.241 | 0.222 | 0.205 | 0.189 | 0.175 | 0.162 | 0.15 | 0.139 |
| 0.938499999999952 | 0.312 | 0.286 | 0.262 | 0.241 | 0.222 | 0.205 | 0.19 | 0.175 | 0.162 | 0.15 | 0.139 |
| 0.938999999999952 | 0.312 | 0.286 | 0.263 | 0.242 | 0.223 | 0.206 | 0.19 | 0.176 | 0.163 | 0.151 | 0.14 |
| 0.939499999999952 | 0.313 | 0.287 | 0.263 | 0.242 | 0.224 | 0.206 | 0.191 | 0.176 | 0.163 | 0.151 | 0.14 |
| 0.939999999999952 | 0.313 | 0.287 | 0.264 | 0.243 | 0.224 | 0.207 | 0.191 | 0.177 | 0.164 | 0.152 | 0.141 |
| 0.940499999999952 | 0.314 | 0.288 | 0.265 | 0.244 | 0.225 | 0.207 | 0.192 | 0.177 | 0.164 | 0.152 | 0.141 |
| 0.940999999999952 | 0.315 | 0.289 | 0.265 | 0.244 | 0.225 | 0.208 | 0.192 | 0.178 | 0.165 | 0.153 | 0.142 |
| 0.941499999999952 | 0.315 | 0.289 | 0.266 | 0.245 | 0.226 | 0.208 | 0.193 | 0.178 | 0.165 | 0.153 | 0.142 |
| 0.941999999999952 | 0.316 | 0.29 | 0.266 | 0.245 | 0.226 | 0.209 | 0.193 | 0.179 | 0.166 | 0.154 | 0.143 |
| 0.942499999999952 | 0.316 | 0.29 | 0.267 | 0.246 | 0.227 | 0.209 | 0.194 | 0.179 | 0.166 | 0.154 | 0.143 |
| 0.942999999999952 | 0.317 | 0.291 | 0.267 | 0.246 | 0.227 | 0.21 | 0.194 | 0.18 | 0.167 | 0.155 | 0.144 |
| 0.943499999999951 | 0.317 | 0.291 | 0.268 | 0.247 | 0.228 | 0.211 | 0.195 | 0.18 | 0.167 | 0.155 | 0.144 |
| 0.943999999999951 | 0.318 | 0.292 | 0.269 | 0.247 | 0.228 | 0.211 | 0.195 | 0.181 | 0.168 | 0.156 | 0.145 |
| 0.944499999999951 | 0.319 | 0.293 | 0.269 | 0.248 | 0.229 | 0.212 | 0.196 | 0.181 | 0.168 | 0.156 | 0.145 |
| 0.944999999999951 | 0.319 | 0.293 | 0.27 | 0.249 | 0.229 | 0.212 | 0.196 | 0.182 | 0.169 | 0.157 | 0.146 |
| 0.945499999999951 | 0.32 | 0.294 | 0.27 | 0.249 | 0.23 | 0.213 | 0.197 | 0.183 | 0.169 | 0.157 | 0.146 |
| 0.945999999999951 | 0.32 | 0.294 | 0.271 | 0.25 | 0.231 | 0.213 | 0.197 | 0.183 | 0.17 | 0.158 | 0.147 |
| 0.946499999999951 | 0.321 | 0.295 | 0.271 | 0.25 | 0.231 | 0.214 | 0.198 | 0.184 | 0.17 | 0.158 | 0.147 |
| 0.946999999999951 | 0.322 | 0.295 | 0.272 | 0.251 | 0.232 | 0.214 | 0.198 | 0.184 | 0.171 | 0.159 | 0.148 |
| 0.947499999999951 | 0.322 | 0.296 | 0.272 | 0.251 | 0.232 | 0.215 | 0.199 | 0.185 | 0.171 | 0.159 | 0.148 |
| 0.947999999999951 | 0.323 | 0.297 | 0.273 | 0.252 | 0.233 | 0.215 | 0.2 | 0.185 | 0.172 | 0.16 | 0.149 |
| 0.948499999999951 | 0.323 | 0.297 | 0.274 | 0.252 | 0.233 | 0.216 | 0.2 | 0.186 | 0.172 | 0.16 | 0.149 |
| 0.948999999999951 | 0.324 | 0.298 | 0.274 | 0.253 | 0.234 | 0.216 | 0.201 | 0.186 | 0.173 | 0.161 | 0.15 |
| 0.949499999999951 | 0.325 | 0.298 | 0.275 | 0.254 | 0.234 | 0.217 | 0.201 | 0.187 | 0.173 | 0.161 | 0.15 |
| 0.949999999999951 | 0.325 | 0.299 | 0.275 | 0.254 | 0.235 | 0.217 | 0.202 | 0.187 | 0.174 | 0.162 | 0.151 |
| 0.950499999999951 | 0.326 | 0.299 | 0.276 | 0.255 | 0.235 | 0.218 | 0.202 | 0.188 | 0.175 | 0.162 | 0.151 |
| 0.950999999999951 | 0.326 | 0.3 | 0.276 | 0.255 | 0.236 | 0.219 | 0.203 | 0.188 | 0.175 | 0.163 | 0.152 |
| 0.951499999999951 | 0.327 | 0.301 | 0.277 | 0.256 | 0.237 | 0.219 | 0.203 | 0.189 | 0.176 | 0.163 | 0.152 |
| 0.951999999999951 | 0.328 | 0.301 | 0.278 | 0.256 | 0.237 | 0.22 | 0.204 | 0.189 | 0.176 | 0.164 | 0.153 |
| 0.95249999999995 | 0.328 | 0.302 | 0.278 | 0.257 | 0.238 | 0.22 | 0.204 | 0.19 | 0.177 | 0.164 | 0.153 |
| 0.95299999999995 | 0.329 | 0.302 | 0.279 | 0.257 | 0.238 | 0.221 | 0.205 | 0.19 | 0.177 | 0.165 | 0.154 |
| 0.95349999999995 | 0.329 | 0.303 | 0.279 | 0.258 | 0.239 | 0.221 | 0.205 | 0.191 | 0.178 | 0.165 | 0.154 |
| 0.95399999999995 | 0.33 | 0.304 | 0.28 | 0.259 | 0.239 | 0.222 | 0.206 | 0.191 | 0.178 | 0.166 | 0.155 |
| 0.95449999999995 | 0.331 | 0.304 | 0.281 | 0.259 | 0.24 | 0.222 | 0.206 | 0.192 | 0.179 | 0.167 | 0.155 |
| 0.95499999999995 | 0.331 | 0.305 | 0.281 | 0.26 | 0.24 | 0.223 | 0.207 | 0.193 | 0.179 | 0.167 | 0.156 |
| 0.95549999999995 | 0.332 | 0.305 | 0.282 | 0.26 | 0.241 | 0.224 | 0.208 | 0.193 | 0.18 | 0.168 | 0.156 |
| 0.95599999999995 | 0.332 | 0.306 | 0.282 | 0.261 | 0.242 | 0.224 | 0.208 | 0.194 | 0.18 | 0.168 | 0.157 |
| 0.95649999999995 | 0.333 | 0.307 | 0.283 | 0.261 | 0.242 | 0.225 | 0.209 | 0.194 | 0.181 | 0.169 | 0.157 |
| 0.95699999999995 | 0.334 | 0.307 | 0.283 | 0.262 | 0.243 | 0.225 | 0.209 | 0.195 | 0.181 | 0.169 | 0.158 |
| 0.95749999999995 | 0.334 | 0.308 | 0.284 | 0.263 | 0.243 | 0.226 | 0.21 | 0.195 | 0.182 | 0.17 | 0.158 |
| 0.95799999999995 | 0.335 | 0.308 | 0.285 | 0.263 | 0.244 | 0.226 | 0.21 | 0.196 | 0.182 | 0.17 | 0.159 |
| 0.95849999999995 | 0.336 | 0.309 | 0.285 | 0.264 | 0.244 | 0.227 | 0.211 | 0.196 | 0.183 | 0.171 | 0.159 |
| 0.95899999999995 | 0.336 | 0.31 | 0.286 | 0.264 | 0.245 | 0.227 | 0.211 | 0.197 | 0.183 | 0.171 | 0.16 |
| 0.95949999999995 | 0.337 | 0.31 | 0.286 | 0.265 | 0.246 | 0.228 | 0.212 | 0.197 | 0.184 | 0.172 | 0.161 |
| 0.95999999999995 | 0.337 | 0.311 | 0.287 | 0.265 | 0.246 | 0.229 | 0.213 | 0.198 | 0.185 | 0.172 | 0.161 |
| 0.96049999999995 | 0.338 | 0.311 | 0.288 | 0.266 | 0.247 | 0.229 | 0.213 | 0.198 | 0.185 | 0.173 | 0.162 |
| 0.96099999999995 | 0.339 | 0.312 | 0.288 | 0.267 | 0.247 | 0.23 | 0.214 | 0.199 | 0.186 | 0.173 | 0.162 |
| 0.961499999999949 | 0.339 | 0.313 | 0.289 | 0.267 | 0.248 | 0.23 | 0.214 | 0.2 | 0.186 | 0.174 | 0.163 |
| 0.961999999999949 | 0.34 | 0.313 | 0.289 | 0.268 | 0.248 | 0.231 | 0.215 | 0.2 | 0.187 | 0.174 | 0.163 |
| 0.962499999999949 | 0.34 | 0.314 | 0.29 | 0.268 | 0.249 | 0.231 | 0.215 | 0.201 | 0.187 | 0.175 | 0.164 |
| 0.962999999999949 | 0.341 | 0.314 | 0.291 | 0.269 | 0.25 | 0.232 | 0.216 | 0.201 | 0.188 | 0.176 | 0.164 |
| 0.963499999999949 | 0.342 | 0.315 | 0.291 | 0.27 | 0.25 | 0.232 | 0.216 | 0.202 | 0.188 | 0.176 | 0.165 |
| 0.963999999999949 | 0.342 | 0.316 | 0.292 | 0.27 | 0.251 | 0.233 | 0.217 | 0.202 | 0.189 | 0.177 | 0.165 |
| 0.964499999999949 | 0.343 | 0.316 | 0.292 | 0.271 | 0.251 | 0.234 | 0.218 | 0.203 | 0.189 | 0.177 | 0.166 |
| 0.964999999999949 | 0.344 | 0.317 | 0.293 | 0.271 | 0.252 | 0.234 | 0.218 | 0.203 | 0.19 | 0.178 | 0.166 |
| 0.965499999999949 | 0.344 | 0.317 | 0.294 | 0.272 | 0.252 | 0.235 | 0.219 | 0.204 | 0.191 | 0.178 | 0.167 |
| 0.965999999999949 | 0.345 | 0.318 | 0.294 | 0.273 | 0.253 | 0.235 | 0.219 | 0.205 | 0.191 | 0.179 | 0.167 |
| 0.966499999999949 | 0.345 | 0.319 | 0.295 | 0.273 | 0.254 | 0.236 | 0.22 | 0.205 | 0.192 | 0.179 | 0.168 |
| 0.966999999999949 | 0.346 | 0.319 | 0.295 | 0.274 | 0.254 | 0.236 | 0.22 | 0.206 | 0.192 | 0.18 | 0.169 |
| 0.967499999999949 | 0.347 | 0.32 | 0.296 | 0.274 | 0.255 | 0.237 | 0.221 | 0.206 | 0.193 | 0.18 | 0.169 |
| 0.967999999999949 | 0.347 | 0.321 | 0.297 | 0.275 | 0.255 | 0.238 | 0.221 | 0.207 | 0.193 | 0.181 | 0.17 |
| 0.968499999999949 | 0.348 | 0.321 | 0.297 | 0.275 | 0.256 | 0.238 | 0.222 | 0.207 | 0.194 | 0.181 | 0.17 |
| 0.968999999999949 | 0.349 | 0.322 | 0.298 | 0.276 | 0.257 | 0.239 | 0.223 | 0.208 | 0.194 | 0.182 | 0.171 |
| 0.969499999999949 | 0.349 | 0.322 | 0.298 | 0.277 | 0.257 | 0.239 | 0.223 | 0.208 | 0.195 | 0.183 | 0.171 |
| 0.969999999999949 | 0.35 | 0.323 | 0.299 | 0.277 | 0.258 | 0.24 | 0.224 | 0.209 | 0.196 | 0.183 | 0.172 |
| 0.970499999999948 | 0.351 | 0.324 | 0.3 | 0.278 | 0.258 | 0.24 | 0.224 | 0.21 | 0.196 | 0.184 | 0.172 |
| 0.970999999999948 | 0.351 | 0.324 | 0.3 | 0.278 | 0.259 | 0.241 | 0.225 | 0.21 | 0.197 | 0.184 | 0.173 |
| 0.971499999999948 | 0.352 | 0.325 | 0.301 | 0.279 | 0.259 | 0.242 | 0.225 | 0.211 | 0.197 | 0.185 | 0.173 |
| 0.971999999999948 | 0.352 | 0.326 | 0.301 | 0.28 | 0.26 | 0.242 | 0.226 | 0.211 | 0.198 | 0.185 | 0.174 |
| 0.972499999999948 | 0.353 | 0.326 | 0.302 | 0.28 | 0.261 | 0.243 | 0.227 | 0.212 | 0.198 | 0.186 | 0.175 |
| 0.972999999999948 | 0.354 | 0.327 | 0.303 | 0.281 | 0.261 | 0.243 | 0.227 | 0.212 | 0.199 | 0.186 | 0.175 |
| 0.973499999999948 | 0.354 | 0.327 | 0.303 | 0.282 | 0.262 | 0.244 | 0.228 | 0.213 | 0.199 | 0.187 | 0.176 |
| 0.973999999999948 | 0.355 | 0.328 | 0.304 | 0.282 | 0.262 | 0.245 | 0.228 | 0.214 | 0.2 | 0.188 | 0.176 |
| 0.974499999999948 | 0.356 | 0.329 | 0.305 | 0.283 | 0.263 | 0.245 | 0.229 | 0.214 | 0.201 | 0.188 | 0.177 |
| 0.974999999999948 | 0.356 | 0.329 | 0.305 | 0.283 | 0.264 | 0.246 | 0.23 | 0.215 | 0.201 | 0.189 | 0.177 |
| 0.975499999999948 | 0.357 | 0.33 | 0.306 | 0.284 | 0.264 | 0.246 | 0.23 | 0.215 | 0.202 | 0.189 | 0.178 |
| 0.975999999999948 | 0.358 | 0.331 | 0.306 | 0.285 | 0.265 | 0.247 | 0.231 | 0.216 | 0.202 | 0.19 | 0.178 |
| 0.976499999999948 | 0.358 | 0.331 | 0.307 | 0.285 | 0.265 | 0.248 | 0.231 | 0.216 | 0.203 | 0.19 | 0.179 |
| 0.976999999999948 | 0.359 | 0.332 | 0.308 | 0.286 | 0.266 | 0.248 | 0.232 | 0.217 | 0.203 | 0.191 | 0.179 |
| 0.977499999999948 | 0.36 | 0.333 | 0.308 | 0.286 | 0.267 | 0.249 | 0.232 | 0.218 | 0.204 | 0.192 | 0.18 |
| 0.977999999999948 | 0.36 | 0.333 | 0.309 | 0.287 | 0.267 | 0.249 | 0.233 | 0.218 | 0.205 | 0.192 | 0.181 |
| 0.978499999999948 | 0.361 | 0.334 | 0.309 | 0.288 | 0.268 | 0.25 | 0.234 | 0.219 | 0.205 | 0.193 | 0.181 |
| 0.978999999999948 | 0.362 | 0.334 | 0.31 | 0.288 | 0.268 | 0.251 | 0.234 | 0.219 | 0.206 | 0.193 | 0.182 |
| 0.979499999999947 | 0.362 | 0.335 | 0.311 | 0.289 | 0.269 | 0.251 | 0.235 | 0.22 | 0.206 | 0.194 | 0.182 |
| 0.979999999999947 | 0.363 | 0.336 | 0.311 | 0.289 | 0.27 | 0.252 | 0.235 | 0.22 | 0.207 | 0.194 | 0.183 |
| 0.980499999999947 | 0.363 | 0.336 | 0.312 | 0.29 | 0.27 | 0.252 | 0.236 | 0.221 | 0.207 | 0.195 | 0.183 |
| 0.980999999999947 | 0.364 | 0.337 | 0.313 | 0.291 | 0.271 | 0.253 | 0.237 | 0.222 | 0.208 | 0.195 | 0.184 |
| 0.981499999999947 | 0.365 | 0.338 | 0.313 | 0.291 | 0.271 | 0.254 | 0.237 | 0.222 | 0.209 | 0.196 | 0.185 |
| 0.981999999999947 | 0.365 | 0.338 | 0.314 | 0.292 | 0.272 | 0.254 | 0.238 | 0.223 | 0.209 | 0.197 | 0.185 |
| 0.982499999999947 | 0.366 | 0.339 | 0.315 | 0.293 | 0.273 | 0.255 | 0.238 | 0.223 | 0.21 | 0.197 | 0.186 |
| 0.982999999999947 | 0.367 | 0.34 | 0.315 | 0.293 | 0.273 | 0.255 | 0.239 | 0.224 | 0.21 | 0.198 | 0.186 |
| 0.983499999999947 | 0.367 | 0.34 | 0.316 | 0.294 | 0.274 | 0.256 | 0.24 | 0.225 | 0.211 | 0.198 | 0.187 |
| 0.983999999999947 | 0.368 | 0.341 | 0.316 | 0.294 | 0.275 | 0.257 | 0.24 | 0.225 | 0.211 | 0.199 | 0.187 |
| 0.984499999999947 | 0.369 | 0.342 | 0.317 | 0.295 | 0.275 | 0.257 | 0.241 | 0.226 | 0.212 | 0.2 | 0.188 |
| 0.984999999999947 | 0.369 | 0.342 | 0.318 | 0.296 | 0.276 | 0.258 | 0.241 | 0.226 | 0.213 | 0.2 | 0.189 |
| 0.985499999999947 | 0.37 | 0.343 | 0.318 | 0.296 | 0.276 | 0.258 | 0.242 | 0.227 | 0.213 | 0.201 | 0.189 |
| 0.985999999999947 | 0.371 | 0.343 | 0.319 | 0.297 | 0.277 | 0.259 | 0.243 | 0.228 | 0.214 | 0.201 | 0.19 |
| 0.986499999999947 | 0.371 | 0.344 | 0.32 | 0.298 | 0.278 | 0.26 | 0.243 | 0.228 | 0.214 | 0.202 | 0.19 |
| 0.986999999999947 | 0.372 | 0.345 | 0.32 | 0.298 | 0.278 | 0.26 | 0.244 | 0.229 | 0.215 | 0.202 | 0.191 |
| 0.987499999999947 | 0.373 | 0.345 | 0.321 | 0.299 | 0.279 | 0.261 | 0.244 | 0.229 | 0.216 | 0.203 | 0.191 |
| 0.987999999999947 | 0.373 | 0.346 | 0.322 | 0.299 | 0.28 | 0.261 | 0.245 | 0.23 | 0.216 | 0.204 | 0.192 |
| 0.988499999999946 | 0.374 | 0.347 | 0.322 | 0.3 | 0.28 | 0.262 | 0.246 | 0.231 | 0.217 | 0.204 | 0.193 |
| 0.988999999999946 | 0.375 | 0.347 | 0.323 | 0.301 | 0.281 | 0.263 | 0.246 | 0.231 | 0.217 | 0.205 | 0.193 |
| 0.989499999999946 | 0.375 | 0.348 | 0.324 | 0.301 | 0.281 | 0.263 | 0.247 | 0.232 | 0.218 | 0.205 | 0.194 |
| 0.989999999999946 | 0.376 | 0.349 | 0.324 | 0.302 | 0.282 | 0.264 | 0.247 | 0.232 | 0.219 | 0.206 | 0.194 |
| 0.990499999999946 | 0.377 | 0.349 | 0.325 | 0.303 | 0.283 | 0.265 | 0.248 | 0.233 | 0.219 | 0.207 | 0.195 |
| 0.990999999999946 | 0.377 | 0.35 | 0.325 | 0.303 | 0.283 | 0.265 | 0.249 | 0.234 | 0.22 | 0.207 | 0.196 |
| 0.991499999999946 | 0.378 | 0.351 | 0.326 | 0.304 | 0.284 | 0.266 | 0.249 | 0.234 | 0.22 | 0.208 | 0.196 |
| 0.991999999999946 | 0.379 | 0.351 | 0.327 | 0.305 | 0.285 | 0.266 | 0.25 | 0.235 | 0.221 | 0.208 | 0.197 |
| 0.992499999999946 | 0.38 | 0.352 | 0.327 | 0.305 | 0.285 | 0.267 | 0.25 | 0.235 | 0.222 | 0.209 | 0.197 |
| 0.992999999999946 | 0.38 | 0.353 | 0.328 | 0.306 | 0.286 | 0.268 | 0.251 | 0.236 | 0.222 | 0.209 | 0.198 |
| 0.993499999999946 | 0.381 | 0.353 | 0.329 | 0.307 | 0.286 | 0.268 | 0.252 | 0.237 | 0.223 | 0.21 | 0.198 |
| 0.993999999999946 | 0.382 | 0.354 | 0.329 | 0.307 | 0.287 | 0.269 | 0.252 | 0.237 | 0.223 | 0.211 | 0.199 |
| 0.994499999999946 | 0.382 | 0.355 | 0.33 | 0.308 | 0.288 | 0.269 | 0.253 | 0.238 | 0.224 | 0.211 | 0.2 |
| 0.994999999999946 | 0.383 | 0.355 | 0.331 | 0.308 | 0.288 | 0.27 | 0.254 | 0.238 | 0.225 | 0.212 | 0.2 |
| 0.995499999999946 | 0.384 | 0.356 | 0.331 | 0.309 | 0.289 | 0.271 | 0.254 | 0.239 | 0.225 | 0.212 | 0.201 |
| 0.995999999999946 | 0.384 | 0.357 | 0.332 | 0.31 | 0.29 | 0.271 | 0.255 | 0.24 | 0.226 | 0.213 | 0.201 |
| 0.996499999999946 | 0.385 | 0.357 | 0.333 | 0.31 | 0.29 | 0.272 | 0.255 | 0.24 | 0.226 | 0.214 | 0.202 |
| 0.996999999999946 | 0.386 | 0.358 | 0.333 | 0.311 | 0.291 | 0.273 | 0.256 | 0.241 | 0.227 | 0.214 | 0.203 |
| 0.997499999999945 | 0.386 | 0.359 | 0.334 | 0.312 | 0.292 | 0.273 | 0.257 | 0.241 | 0.228 | 0.215 | 0.203 |
| 0.997999999999945 | 0.387 | 0.359 | 0.335 | 0.312 | 0.292 | 0.274 | 0.257 | 0.242 | 0.228 | 0.215 | 0.204 |
| 0.998499999999945 | 0.388 | 0.36 | 0.335 | 0.313 | 0.293 | 0.275 | 0.258 | 0.243 | 0.229 | 0.216 | 0.204 |
| 0.998999999999945 | 0.388 | 0.361 | 0.336 | 0.314 | 0.293 | 0.275 | 0.259 | 0.243 | 0.229 | 0.217 | 0.205 |
| 0.999499999999945 | 0.389 | 0.361 | 0.337 | 0.314 | 0.294 | 0.276 | 0.259 | 0.244 | 0.23 | 0.217 | 0.206 |
| 0.999999999999945 | 0.39 | 0.362 | 0.337 | 0.315 | 0.295 | 0.276 | 0.26 | 0.245 | 0.231 | 0.218 | 0.206 |